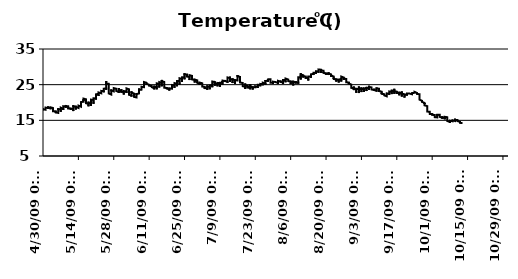
| Category | Temperature (oC) | date |
|---|---|---|
| 10/13/09 | 14.26 |  |
| 10/13/09 | 14.28 |  |
| 10/13/09 | 14.27 |  |
| 10/13/09 | 14.23 |  |
| 10/13/09 | 14.25 |  |
| 10/13/09 | 14.19 |  |
| 10/13/09 | 14.14 |  |
| 10/13/09 | 14.12 |  |
| 10/13/09 | 14.14 |  |
| 10/13/09 | 14.13 |  |
| 10/13/09 | 14.1 |  |
| 10/13/09 | 14.08 |  |
| 10/13/09 | 14.08 |  |
| 10/13/09 | 14.07 |  |
| 10/13/09 | 14.06 |  |
| 10/13/09 | 14.07 |  |
| 10/13/09 | 14.08 |  |
| 10/13/09 | 14.09 |  |
| 10/13/09 | 14.1 |  |
| 10/13/09 | 14.12 |  |
| 10/13/09 | 14.13 |  |
| 10/13/09 | 14.14 |  |
| 10/13/09 | 14.15 |  |
| 10/13/09 | 14.16 |  |
| 10/13/09 | 14.17 |  |
| 10/13/09 | 14.18 |  |
| 10/13/09 | 14.2 |  |
| 10/13/09 | 14.21 |  |
| 10/13/09 | 14.23 |  |
| 10/13/09 | 14.24 |  |
| 10/13/09 | 14.26 |  |
| 10/13/09 | 14.28 |  |
| 10/12/09 | 14.29 |  |
| 10/12/09 | 14.29 |  |
| 10/12/09 | 14.3 |  |
| 10/12/09 | 14.31 |  |
| 10/12/09 | 14.34 |  |
| 10/12/09 | 14.35 |  |
| 10/12/09 | 14.36 |  |
| 10/12/09 | 14.36 |  |
| 10/12/09 | 14.36 |  |
| 10/12/09 | 14.37 |  |
| 10/12/09 | 14.39 |  |
| 10/12/09 | 14.39 |  |
| 10/12/09 | 14.4 |  |
| 10/12/09 | 14.4 |  |
| 10/12/09 | 14.39 |  |
| 10/12/09 | 14.38 |  |
| 10/12/09 | 14.39 |  |
| 10/12/09 | 14.38 |  |
| 10/12/09 | 14.37 |  |
| 10/12/09 | 14.35 |  |
| 10/12/09 | 14.28 |  |
| 10/12/09 | 14.22 |  |
| 10/12/09 | 14.2 |  |
| 10/12/09 | 14.18 |  |
| 10/12/09 | 14.17 |  |
| 10/12/09 | 14.14 |  |
| 10/12/09 | 14.1 |  |
| 10/12/09 | 14.11 |  |
| 10/12/09 | 14.12 |  |
| 10/12/09 | 14.13 |  |
| 10/12/09 | 14.17 |  |
| 10/12/09 | 14.2 |  |
| 10/12/09 | 14.22 |  |
| 10/12/09 | 14.23 |  |
| 10/12/09 | 14.28 |  |
| 10/12/09 | 14.34 |  |
| 10/12/09 | 14.39 |  |
| 10/12/09 | 14.44 |  |
| 10/12/09 | 14.48 |  |
| 10/12/09 | 14.49 |  |
| 10/12/09 | 14.52 |  |
| 10/12/09 | 14.55 |  |
| 10/12/09 | 14.58 |  |
| 10/12/09 | 14.63 |  |
| 10/12/09 | 14.67 |  |
| 10/12/09 | 14.7 |  |
| 10/12/09 | 14.72 |  |
| 10/12/09 | 14.76 |  |
| 10/11/09 | 14.79 |  |
| 10/11/09 | 14.82 |  |
| 10/11/09 | 14.85 |  |
| 10/11/09 | 14.89 |  |
| 10/11/09 | 14.95 |  |
| 10/11/09 | 15.03 |  |
| 10/11/09 | 15.08 |  |
| 10/11/09 | 15.17 |  |
| 10/11/09 | 15.2 |  |
| 10/11/09 | 15.26 |  |
| 10/11/09 | 15.27 |  |
| 10/11/09 | 15.29 |  |
| 10/11/09 | 15.29 |  |
| 10/11/09 | 15.33 |  |
| 10/11/09 | 15.27 |  |
| 10/11/09 | 15.12 |  |
| 10/11/09 | 15.22 |  |
| 10/11/09 | 15.28 |  |
| 10/11/09 | 15.16 |  |
| 10/11/09 | 15.03 |  |
| 10/11/09 | 14.78 |  |
| 10/11/09 | 14.79 |  |
| 10/11/09 | 14.79 |  |
| 10/11/09 | 14.72 |  |
| 10/11/09 | 14.7 |  |
| 10/11/09 | 14.68 |  |
| 10/11/09 | 14.67 |  |
| 10/11/09 | 14.71 |  |
| 10/11/09 | 14.7 |  |
| 10/11/09 | 14.71 |  |
| 10/11/09 | 14.71 |  |
| 10/11/09 | 14.74 |  |
| 10/11/09 | 14.76 |  |
| 10/11/09 | 14.8 |  |
| 10/11/09 | 14.8 |  |
| 10/11/09 | 14.81 |  |
| 10/11/09 | 14.83 |  |
| 10/11/09 | 14.86 |  |
| 10/11/09 | 14.89 |  |
| 10/11/09 | 14.91 |  |
| 10/11/09 | 14.94 |  |
| 10/11/09 | 14.97 |  |
| 10/11/09 | 15 |  |
| 10/11/09 | 15.01 |  |
| 10/11/09 | 15.03 |  |
| 10/11/09 | 15.06 |  |
| 10/11/09 | 15.08 |  |
| 10/11/09 | 15.12 |  |
| 10/10/09 | 15.15 |  |
| 10/10/09 | 15.23 |  |
| 10/10/09 | 15.27 |  |
| 10/10/09 | 15.33 |  |
| 10/10/09 | 15.4 |  |
| 10/10/09 | 15.47 |  |
| 10/10/09 | 15.55 |  |
| 10/10/09 | 15.57 |  |
| 10/10/09 | 15.54 |  |
| 10/10/09 | 15.54 |  |
| 10/10/09 | 15.38 |  |
| 10/10/09 | 15.37 |  |
| 10/10/09 | 15.56 |  |
| 10/10/09 | 15.35 |  |
| 10/10/09 | 15.3 |  |
| 10/10/09 | 15.28 |  |
| 10/10/09 | 15.14 |  |
| 10/10/09 | 15.05 |  |
| 10/10/09 | 14.97 |  |
| 10/10/09 | 14.97 |  |
| 10/10/09 | 14.89 |  |
| 10/10/09 | 14.86 |  |
| 10/10/09 | 14.82 |  |
| 10/10/09 | 14.79 |  |
| 10/10/09 | 14.76 |  |
| 10/10/09 | 14.78 |  |
| 10/10/09 | 14.75 |  |
| 10/10/09 | 14.75 |  |
| 10/10/09 | 14.76 |  |
| 10/10/09 | 14.76 |  |
| 10/10/09 | 14.77 |  |
| 10/10/09 | 14.79 |  |
| 10/10/09 | 14.82 |  |
| 10/10/09 | 14.85 |  |
| 10/10/09 | 14.88 |  |
| 10/10/09 | 14.92 |  |
| 10/10/09 | 14.92 |  |
| 10/10/09 | 14.91 |  |
| 10/10/09 | 14.83 |  |
| 10/10/09 | 14.74 |  |
| 10/10/09 | 14.73 |  |
| 10/10/09 | 14.83 |  |
| 10/10/09 | 14.84 |  |
| 10/10/09 | 14.86 |  |
| 10/10/09 | 14.89 |  |
| 10/10/09 | 14.98 |  |
| 10/10/09 | 15.01 |  |
| 10/10/09 | 15.03 |  |
| 10/9/09 | 15.03 |  |
| 10/9/09 | 14.95 |  |
| 10/9/09 | 14.98 |  |
| 10/9/09 | 15.03 |  |
| 10/9/09 | 15 |  |
| 10/9/09 | 14.97 |  |
| 10/9/09 | 14.92 |  |
| 10/9/09 | 14.82 |  |
| 10/9/09 | 14.8 |  |
| 10/9/09 | 14.81 |  |
| 10/9/09 | 14.81 |  |
| 10/9/09 | 14.93 |  |
| 10/9/09 | 14.85 |  |
| 10/9/09 | 14.74 |  |
| 10/9/09 | 14.71 |  |
| 10/9/09 | 14.69 |  |
| 10/9/09 | 14.74 |  |
| 10/9/09 | 14.71 |  |
| 10/9/09 | 14.71 |  |
| 10/9/09 | 14.76 |  |
| 10/9/09 | 14.73 |  |
| 10/9/09 | 14.72 |  |
| 10/9/09 | 14.71 |  |
| 10/9/09 | 14.7 |  |
| 10/9/09 | 14.68 |  |
| 10/9/09 | 14.67 |  |
| 10/9/09 | 14.67 |  |
| 10/9/09 | 14.67 |  |
| 10/9/09 | 14.65 |  |
| 10/9/09 | 14.66 |  |
| 10/9/09 | 14.66 |  |
| 10/9/09 | 14.68 |  |
| 10/9/09 | 14.69 |  |
| 10/9/09 | 14.69 |  |
| 10/9/09 | 14.67 |  |
| 10/9/09 | 14.65 |  |
| 10/9/09 | 14.63 |  |
| 10/9/09 | 14.61 |  |
| 10/9/09 | 14.64 |  |
| 10/9/09 | 14.68 |  |
| 10/9/09 | 14.73 |  |
| 10/9/09 | 14.77 |  |
| 10/9/09 | 14.73 |  |
| 10/9/09 | 14.69 |  |
| 10/9/09 | 14.83 |  |
| 10/9/09 | 14.94 |  |
| 10/9/09 | 14.93 |  |
| 10/9/09 | 14.9 |  |
| 10/8/09 | 14.9 |  |
| 10/8/09 | 14.92 |  |
| 10/8/09 | 14.86 |  |
| 10/8/09 | 14.84 |  |
| 10/8/09 | 15 |  |
| 10/8/09 | 15.03 |  |
| 10/8/09 | 15.01 |  |
| 10/8/09 | 14.99 |  |
| 10/8/09 | 14.89 |  |
| 10/8/09 | 14.89 |  |
| 10/8/09 | 14.75 |  |
| 10/8/09 | 14.56 |  |
| 10/8/09 | 14.42 |  |
| 10/8/09 | 14.55 |  |
| 10/8/09 | 14.48 |  |
| 10/8/09 | 14.59 |  |
| 10/8/09 | 14.64 |  |
| 10/8/09 | 14.48 |  |
| 10/8/09 | 14.26 |  |
| 10/8/09 | 14.25 |  |
| 10/8/09 | 14.31 |  |
| 10/8/09 | 14.34 |  |
| 10/8/09 | 14.25 |  |
| 10/8/09 | 14.22 |  |
| 10/8/09 | 14.24 |  |
| 10/8/09 | 14.26 |  |
| 10/8/09 | 14.26 |  |
| 10/8/09 | 14.24 |  |
| 10/8/09 | 14.24 |  |
| 10/8/09 | 14.24 |  |
| 10/8/09 | 14.25 |  |
| 10/8/09 | 14.29 |  |
| 10/8/09 | 14.33 |  |
| 10/8/09 | 14.36 |  |
| 10/8/09 | 14.39 |  |
| 10/8/09 | 14.44 |  |
| 10/8/09 | 14.48 |  |
| 10/8/09 | 14.51 |  |
| 10/8/09 | 14.53 |  |
| 10/8/09 | 14.55 |  |
| 10/8/09 | 14.56 |  |
| 10/8/09 | 14.59 |  |
| 10/8/09 | 14.64 |  |
| 10/8/09 | 14.67 |  |
| 10/8/09 | 14.71 |  |
| 10/8/09 | 14.74 |  |
| 10/8/09 | 14.75 |  |
| 10/8/09 | 14.79 |  |
| 10/7/09 | 14.81 |  |
| 10/7/09 | 14.84 |  |
| 10/7/09 | 14.87 |  |
| 10/7/09 | 14.88 |  |
| 10/7/09 | 14.9 |  |
| 10/7/09 | 14.91 |  |
| 10/7/09 | 14.92 |  |
| 10/7/09 | 14.94 |  |
| 10/7/09 | 14.96 |  |
| 10/7/09 | 14.96 |  |
| 10/7/09 | 14.96 |  |
| 10/7/09 | 14.96 |  |
| 10/7/09 | 14.97 |  |
| 10/7/09 | 14.99 |  |
| 10/7/09 | 14.98 |  |
| 10/7/09 | 14.99 |  |
| 10/7/09 | 14.98 |  |
| 10/7/09 | 14.97 |  |
| 10/7/09 | 14.96 |  |
| 10/7/09 | 14.94 |  |
| 10/7/09 | 14.95 |  |
| 10/7/09 | 14.98 |  |
| 10/7/09 | 15.03 |  |
| 10/7/09 | 15.01 |  |
| 10/7/09 | 15.06 |  |
| 10/7/09 | 15.06 |  |
| 10/7/09 | 15.07 |  |
| 10/7/09 | 15.09 |  |
| 10/7/09 | 15.14 |  |
| 10/7/09 | 15.16 |  |
| 10/7/09 | 15.18 |  |
| 10/7/09 | 15.2 |  |
| 10/7/09 | 15.23 |  |
| 10/7/09 | 15.25 |  |
| 10/7/09 | 15.27 |  |
| 10/7/09 | 15.32 |  |
| 10/7/09 | 15.44 |  |
| 10/7/09 | 15.69 |  |
| 10/7/09 | 15.57 |  |
| 10/7/09 | 15.7 |  |
| 10/7/09 | 15.58 |  |
| 10/7/09 | 15.63 |  |
| 10/7/09 | 15.52 |  |
| 10/7/09 | 15.4 |  |
| 10/7/09 | 15.54 |  |
| 10/7/09 | 15.58 |  |
| 10/7/09 | 15.86 |  |
| 10/7/09 | 15.93 |  |
| 10/6/09 | 15.99 |  |
| 10/6/09 | 15.84 |  |
| 10/6/09 | 15.69 |  |
| 10/6/09 | 15.6 |  |
| 10/6/09 | 15.56 |  |
| 10/6/09 | 15.57 |  |
| 10/6/09 | 15.55 |  |
| 10/6/09 | 15.5 |  |
| 10/6/09 | 15.55 |  |
| 10/6/09 | 15.61 |  |
| 10/6/09 | 15.6 |  |
| 10/6/09 | 15.62 |  |
| 10/6/09 | 15.62 |  |
| 10/6/09 | 15.72 |  |
| 10/6/09 | 15.66 |  |
| 10/6/09 | 16.08 |  |
| 10/6/09 | 15.86 |  |
| 10/6/09 | 15.68 |  |
| 10/6/09 | 15.48 |  |
| 10/6/09 | 15.46 |  |
| 10/6/09 | 15.41 |  |
| 10/6/09 | 15.54 |  |
| 10/6/09 | 15.52 |  |
| 10/6/09 | 15.29 |  |
| 10/6/09 | 15.29 |  |
| 10/6/09 | 15.28 |  |
| 10/6/09 | 15.25 |  |
| 10/6/09 | 15.23 |  |
| 10/6/09 | 15.22 |  |
| 10/6/09 | 15.22 |  |
| 10/6/09 | 15.25 |  |
| 10/6/09 | 15.27 |  |
| 10/6/09 | 15.31 |  |
| 10/6/09 | 15.32 |  |
| 10/6/09 | 15.35 |  |
| 10/6/09 | 15.38 |  |
| 10/6/09 | 15.42 |  |
| 10/6/09 | 15.44 |  |
| 10/6/09 | 15.49 |  |
| 10/6/09 | 15.53 |  |
| 10/6/09 | 15.55 |  |
| 10/6/09 | 15.58 |  |
| 10/6/09 | 15.61 |  |
| 10/6/09 | 15.65 |  |
| 10/6/09 | 15.67 |  |
| 10/6/09 | 15.68 |  |
| 10/6/09 | 15.71 |  |
| 10/6/09 | 15.76 |  |
| 10/5/09 | 15.8 |  |
| 10/5/09 | 15.85 |  |
| 10/5/09 | 15.9 |  |
| 10/5/09 | 15.97 |  |
| 10/5/09 | 16.02 |  |
| 10/5/09 | 16.07 |  |
| 10/5/09 | 16.11 |  |
| 10/5/09 | 16.12 |  |
| 10/5/09 | 16.11 |  |
| 10/5/09 | 16.08 |  |
| 10/5/09 | 16.17 |  |
| 10/5/09 | 15.99 |  |
| 10/5/09 | 16.15 |  |
| 10/5/09 | 15.99 |  |
| 10/5/09 | 15.78 |  |
| 10/5/09 | 15.75 |  |
| 10/5/09 | 15.81 |  |
| 10/5/09 | 15.69 |  |
| 10/5/09 | 15.71 |  |
| 10/5/09 | 15.76 |  |
| 10/5/09 | 15.75 |  |
| 10/5/09 | 15.65 |  |
| 10/5/09 | 15.59 |  |
| 10/5/09 | 15.6 |  |
| 10/5/09 | 15.45 |  |
| 10/5/09 | 15.45 |  |
| 10/5/09 | 15.44 |  |
| 10/5/09 | 15.43 |  |
| 10/5/09 | 15.4 |  |
| 10/5/09 | 15.4 |  |
| 10/5/09 | 15.41 |  |
| 10/5/09 | 15.45 |  |
| 10/5/09 | 15.5 |  |
| 10/5/09 | 15.53 |  |
| 10/5/09 | 15.55 |  |
| 10/5/09 | 15.58 |  |
| 10/5/09 | 15.61 |  |
| 10/5/09 | 15.65 |  |
| 10/5/09 | 15.67 |  |
| 10/5/09 | 15.71 |  |
| 10/5/09 | 15.73 |  |
| 10/5/09 | 15.75 |  |
| 10/5/09 | 15.75 |  |
| 10/5/09 | 15.81 |  |
| 10/5/09 | 15.83 |  |
| 10/5/09 | 15.88 |  |
| 10/5/09 | 15.89 |  |
| 10/5/09 | 15.92 |  |
| 10/4/09 | 15.96 |  |
| 10/4/09 | 16 |  |
| 10/4/09 | 16.03 |  |
| 10/4/09 | 16.07 |  |
| 10/4/09 | 16.1 |  |
| 10/4/09 | 16.14 |  |
| 10/4/09 | 16.16 |  |
| 10/4/09 | 16.19 |  |
| 10/4/09 | 16.23 |  |
| 10/4/09 | 16.23 |  |
| 10/4/09 | 16.23 |  |
| 10/4/09 | 16.24 |  |
| 10/4/09 | 16.27 |  |
| 10/4/09 | 16.3 |  |
| 10/4/09 | 16.31 |  |
| 10/4/09 | 16.3 |  |
| 10/4/09 | 16.27 |  |
| 10/4/09 | 16.25 |  |
| 10/4/09 | 16.26 |  |
| 10/4/09 | 16.24 |  |
| 10/4/09 | 16.22 |  |
| 10/4/09 | 16.21 |  |
| 10/4/09 | 16.23 |  |
| 10/4/09 | 16.2 |  |
| 10/4/09 | 16.15 |  |
| 10/4/09 | 16.11 |  |
| 10/4/09 | 16.07 |  |
| 10/4/09 | 16.05 |  |
| 10/4/09 | 16.07 |  |
| 10/4/09 | 16.09 |  |
| 10/4/09 | 16.13 |  |
| 10/4/09 | 16.16 |  |
| 10/4/09 | 16.19 |  |
| 10/4/09 | 16.23 |  |
| 10/4/09 | 16.26 |  |
| 10/4/09 | 16.29 |  |
| 10/4/09 | 16.32 |  |
| 10/4/09 | 16.34 |  |
| 10/4/09 | 16.37 |  |
| 10/4/09 | 16.4 |  |
| 10/4/09 | 16.43 |  |
| 10/4/09 | 16.46 |  |
| 10/4/09 | 16.46 |  |
| 10/4/09 | 16.49 |  |
| 10/4/09 | 16.51 |  |
| 10/4/09 | 16.55 |  |
| 10/4/09 | 16.51 |  |
| 10/4/09 | 16.56 |  |
| 10/3/09 | 16.56 |  |
| 10/3/09 | 16.49 |  |
| 10/3/09 | 16.48 |  |
| 10/3/09 | 16.58 |  |
| 10/3/09 | 16.65 |  |
| 10/3/09 | 16.66 |  |
| 10/3/09 | 16.63 |  |
| 10/3/09 | 16.57 |  |
| 10/3/09 | 16.47 |  |
| 10/3/09 | 16.39 |  |
| 10/3/09 | 16.27 |  |
| 10/3/09 | 16.73 |  |
| 10/3/09 | 16.59 |  |
| 10/3/09 | 16.74 |  |
| 10/3/09 | 16.17 |  |
| 10/3/09 | 16.37 |  |
| 10/3/09 | 16.29 |  |
| 10/3/09 | 16.07 |  |
| 10/3/09 | 15.82 |  |
| 10/3/09 | 15.74 |  |
| 10/3/09 | 15.79 |  |
| 10/3/09 | 15.85 |  |
| 10/3/09 | 15.96 |  |
| 10/3/09 | 15.85 |  |
| 10/3/09 | 15.77 |  |
| 10/3/09 | 15.75 |  |
| 10/3/09 | 15.72 |  |
| 10/3/09 | 15.7 |  |
| 10/3/09 | 15.69 |  |
| 10/3/09 | 15.69 |  |
| 10/3/09 | 15.68 |  |
| 10/3/09 | 15.69 |  |
| 10/3/09 | 15.7 |  |
| 10/3/09 | 15.7 |  |
| 10/3/09 | 15.72 |  |
| 10/3/09 | 15.74 |  |
| 10/3/09 | 15.75 |  |
| 10/3/09 | 15.76 |  |
| 10/3/09 | 15.77 |  |
| 10/3/09 | 15.78 |  |
| 10/3/09 | 15.8 |  |
| 10/3/09 | 15.82 |  |
| 10/3/09 | 15.83 |  |
| 10/3/09 | 15.83 |  |
| 10/3/09 | 15.84 |  |
| 10/3/09 | 15.84 |  |
| 10/3/09 | 15.86 |  |
| 10/3/09 | 15.88 |  |
| 10/2/09 | 15.89 |  |
| 10/2/09 | 15.91 |  |
| 10/2/09 | 15.92 |  |
| 10/2/09 | 15.95 |  |
| 10/2/09 | 15.96 |  |
| 10/2/09 | 15.96 |  |
| 10/2/09 | 15.97 |  |
| 10/2/09 | 15.97 |  |
| 10/2/09 | 15.97 |  |
| 10/2/09 | 15.97 |  |
| 10/2/09 | 15.97 |  |
| 10/2/09 | 15.98 |  |
| 10/2/09 | 15.98 |  |
| 10/2/09 | 15.98 |  |
| 10/2/09 | 15.98 |  |
| 10/2/09 | 15.98 |  |
| 10/2/09 | 15.98 |  |
| 10/2/09 | 15.98 |  |
| 10/2/09 | 15.98 |  |
| 10/2/09 | 15.97 |  |
| 10/2/09 | 15.98 |  |
| 10/2/09 | 15.99 |  |
| 10/2/09 | 15.99 |  |
| 10/2/09 | 15.98 |  |
| 10/2/09 | 15.96 |  |
| 10/2/09 | 15.95 |  |
| 10/2/09 | 15.97 |  |
| 10/2/09 | 15.96 |  |
| 10/2/09 | 15.94 |  |
| 10/2/09 | 15.94 |  |
| 10/2/09 | 15.95 |  |
| 10/2/09 | 15.98 |  |
| 10/2/09 | 16.01 |  |
| 10/2/09 | 16.05 |  |
| 10/2/09 | 16.07 |  |
| 10/2/09 | 16.11 |  |
| 10/2/09 | 16.14 |  |
| 10/2/09 | 16.15 |  |
| 10/2/09 | 16.17 |  |
| 10/2/09 | 16.19 |  |
| 10/2/09 | 16.23 |  |
| 10/2/09 | 16.27 |  |
| 10/2/09 | 16.28 |  |
| 10/2/09 | 16.32 |  |
| 10/2/09 | 16.36 |  |
| 10/2/09 | 16.4 |  |
| 10/2/09 | 16.44 |  |
| 10/2/09 | 16.49 |  |
| 10/1/09 | 16.54 |  |
| 10/1/09 | 16.58 |  |
| 10/1/09 | 16.63 |  |
| 10/1/09 | 16.68 |  |
| 10/1/09 | 16.72 |  |
| 10/1/09 | 16.81 |  |
| 10/1/09 | 16.88 |  |
| 10/1/09 | 16.92 |  |
| 10/1/09 | 16.91 |  |
| 10/1/09 | 16.7 |  |
| 10/1/09 | 16.71 |  |
| 10/1/09 | 16.71 |  |
| 10/1/09 | 17 |  |
| 10/1/09 | 16.89 |  |
| 10/1/09 | 16.6 |  |
| 10/1/09 | 16.45 |  |
| 10/1/09 | 16.5 |  |
| 10/1/09 | 16.47 |  |
| 10/1/09 | 16.42 |  |
| 10/1/09 | 16.37 |  |
| 10/1/09 | 16.31 |  |
| 10/1/09 | 16.26 |  |
| 10/1/09 | 16.19 |  |
| 10/1/09 | 16.21 |  |
| 10/1/09 | 16.21 |  |
| 10/1/09 | 16.22 |  |
| 10/1/09 | 16.2 |  |
| 10/1/09 | 16.2 |  |
| 10/1/09 | 16.19 |  |
| 10/1/09 | 16.19 |  |
| 10/1/09 | 16.21 |  |
| 10/1/09 | 16.27 |  |
| 10/1/09 | 16.29 |  |
| 10/1/09 | 16.34 |  |
| 10/1/09 | 16.37 |  |
| 10/1/09 | 16.4 |  |
| 10/1/09 | 16.43 |  |
| 10/1/09 | 16.45 |  |
| 10/1/09 | 16.48 |  |
| 10/1/09 | 16.5 |  |
| 10/1/09 | 16.55 |  |
| 10/1/09 | 16.58 |  |
| 10/1/09 | 16.61 |  |
| 10/1/09 | 16.63 |  |
| 10/1/09 | 16.63 |  |
| 10/1/09 | 16.68 |  |
| 10/1/09 | 16.71 |  |
| 10/1/09 | 16.75 |  |
| 9/30/09 | 16.8 |  |
| 9/30/09 | 16.82 |  |
| 9/30/09 | 16.86 |  |
| 9/30/09 | 16.91 |  |
| 9/30/09 | 16.94 |  |
| 9/30/09 | 16.98 |  |
| 9/30/09 | 17.03 |  |
| 9/30/09 | 17.07 |  |
| 9/30/09 | 17.09 |  |
| 9/30/09 | 17.15 |  |
| 9/30/09 | 17.19 |  |
| 9/30/09 | 17.22 |  |
| 9/30/09 | 17.18 |  |
| 9/30/09 | 17.22 |  |
| 9/30/09 | 17.19 |  |
| 9/30/09 | 17.17 |  |
| 9/30/09 | 17.17 |  |
| 9/30/09 | 17.15 |  |
| 9/30/09 | 17.14 |  |
| 9/30/09 | 17.13 |  |
| 9/30/09 | 17.11 |  |
| 9/30/09 | 17.09 |  |
| 9/30/09 | 17.03 |  |
| 9/30/09 | 17 |  |
| 9/30/09 | 17.01 |  |
| 9/30/09 | 17.02 |  |
| 9/30/09 | 16.99 |  |
| 9/30/09 | 16.99 |  |
| 9/30/09 | 16.99 |  |
| 9/30/09 | 17 |  |
| 9/30/09 | 17.01 |  |
| 9/30/09 | 17.04 |  |
| 9/30/09 | 17.06 |  |
| 9/30/09 | 17.09 |  |
| 9/30/09 | 17.12 |  |
| 9/30/09 | 17.13 |  |
| 9/30/09 | 17.17 |  |
| 9/30/09 | 17.2 |  |
| 9/30/09 | 17.22 |  |
| 9/30/09 | 17.24 |  |
| 9/30/09 | 17.27 |  |
| 9/30/09 | 17.29 |  |
| 9/30/09 | 17.31 |  |
| 9/30/09 | 17.32 |  |
| 9/30/09 | 17.34 |  |
| 9/30/09 | 17.36 |  |
| 9/30/09 | 17.4 |  |
| 9/30/09 | 17.42 |  |
| 9/29/09 | 17.46 |  |
| 9/29/09 | 17.48 |  |
| 9/29/09 | 17.5 |  |
| 9/29/09 | 17.53 |  |
| 9/29/09 | 17.55 |  |
| 9/29/09 | 17.55 |  |
| 9/29/09 | 17.57 |  |
| 9/29/09 | 17.58 |  |
| 9/29/09 | 17.59 |  |
| 9/29/09 | 17.62 |  |
| 9/29/09 | 17.66 |  |
| 9/29/09 | 17.69 |  |
| 9/29/09 | 17.74 |  |
| 9/29/09 | 17.77 |  |
| 9/29/09 | 17.81 |  |
| 9/29/09 | 17.84 |  |
| 9/29/09 | 17.86 |  |
| 9/29/09 | 17.89 |  |
| 9/29/09 | 17.93 |  |
| 9/29/09 | 17.96 |  |
| 9/29/09 | 17.97 |  |
| 9/29/09 | 17.99 |  |
| 9/29/09 | 17.97 |  |
| 9/29/09 | 18.01 |  |
| 9/29/09 | 18.02 |  |
| 9/29/09 | 18.08 |  |
| 9/29/09 | 18.07 |  |
| 9/29/09 | 18.06 |  |
| 9/29/09 | 18.1 |  |
| 9/29/09 | 18.12 |  |
| 9/29/09 | 18.16 |  |
| 9/29/09 | 18.21 |  |
| 9/29/09 | 18.29 |  |
| 9/29/09 | 18.33 |  |
| 9/29/09 | 18.4 |  |
| 9/29/09 | 18.46 |  |
| 9/29/09 | 18.52 |  |
| 9/29/09 | 18.59 |  |
| 9/29/09 | 18.65 |  |
| 9/29/09 | 18.7 |  |
| 9/29/09 | 18.77 |  |
| 9/29/09 | 18.84 |  |
| 9/29/09 | 18.87 |  |
| 9/29/09 | 18.94 |  |
| 9/29/09 | 18.99 |  |
| 9/29/09 | 19.05 |  |
| 9/29/09 | 19.08 |  |
| 9/29/09 | 19.12 |  |
| 9/28/09 | 19.2 |  |
| 9/28/09 | 19.22 |  |
| 9/28/09 | 19.26 |  |
| 9/28/09 | 19.29 |  |
| 9/28/09 | 19.3 |  |
| 9/28/09 | 19.36 |  |
| 9/28/09 | 19.36 |  |
| 9/28/09 | 19.41 |  |
| 9/28/09 | 19.42 |  |
| 9/28/09 | 19.47 |  |
| 9/28/09 | 19.54 |  |
| 9/28/09 | 19.58 |  |
| 9/28/09 | 19.63 |  |
| 9/28/09 | 19.67 |  |
| 9/28/09 | 19.69 |  |
| 9/28/09 | 19.76 |  |
| 9/28/09 | 19.8 |  |
| 9/28/09 | 19.86 |  |
| 9/28/09 | 19.89 |  |
| 9/28/09 | 19.89 |  |
| 9/28/09 | 19.89 |  |
| 9/28/09 | 19.82 |  |
| 9/28/09 | 19.72 |  |
| 9/28/09 | 19.68 |  |
| 9/28/09 | 19.64 |  |
| 9/28/09 | 19.59 |  |
| 9/28/09 | 19.57 |  |
| 9/28/09 | 19.55 |  |
| 9/28/09 | 19.55 |  |
| 9/28/09 | 19.56 |  |
| 9/28/09 | 19.58 |  |
| 9/28/09 | 19.6 |  |
| 9/28/09 | 19.62 |  |
| 9/28/09 | 19.65 |  |
| 9/28/09 | 19.67 |  |
| 9/28/09 | 19.7 |  |
| 9/28/09 | 19.72 |  |
| 9/28/09 | 19.74 |  |
| 9/28/09 | 19.76 |  |
| 9/28/09 | 19.79 |  |
| 9/28/09 | 19.83 |  |
| 9/28/09 | 19.88 |  |
| 9/28/09 | 19.92 |  |
| 9/28/09 | 19.99 |  |
| 9/28/09 | 20.04 |  |
| 9/28/09 | 20.06 |  |
| 9/28/09 | 20.1 |  |
| 9/28/09 | 20.13 |  |
| 9/27/09 | 20.16 |  |
| 9/27/09 | 20.2 |  |
| 9/27/09 | 20.22 |  |
| 9/27/09 | 20.26 |  |
| 9/27/09 | 20.3 |  |
| 9/27/09 | 20.34 |  |
| 9/27/09 | 20.38 |  |
| 9/27/09 | 20.43 |  |
| 9/27/09 | 20.44 |  |
| 9/27/09 | 20.48 |  |
| 9/27/09 | 20.48 |  |
| 9/27/09 | 20.41 |  |
| 9/27/09 | 20.35 |  |
| 9/27/09 | 20.29 |  |
| 9/27/09 | 20.29 |  |
| 9/27/09 | 20.31 |  |
| 9/27/09 | 20.32 |  |
| 9/27/09 | 20.38 |  |
| 9/27/09 | 20.36 |  |
| 9/27/09 | 20.34 |  |
| 9/27/09 | 20.33 |  |
| 9/27/09 | 20.35 |  |
| 9/27/09 | 20.36 |  |
| 9/27/09 | 20.37 |  |
| 9/27/09 | 20.38 |  |
| 9/27/09 | 20.37 |  |
| 9/27/09 | 20.37 |  |
| 9/27/09 | 20.36 |  |
| 9/27/09 | 20.36 |  |
| 9/27/09 | 20.38 |  |
| 9/27/09 | 20.39 |  |
| 9/27/09 | 20.4 |  |
| 9/27/09 | 20.43 |  |
| 9/27/09 | 20.45 |  |
| 9/27/09 | 20.47 |  |
| 9/27/09 | 20.5 |  |
| 9/27/09 | 20.51 |  |
| 9/27/09 | 20.54 |  |
| 9/27/09 | 20.56 |  |
| 9/27/09 | 20.57 |  |
| 9/27/09 | 20.59 |  |
| 9/27/09 | 20.63 |  |
| 9/27/09 | 20.65 |  |
| 9/27/09 | 20.67 |  |
| 9/27/09 | 20.69 |  |
| 9/27/09 | 20.72 |  |
| 9/27/09 | 20.73 |  |
| 9/27/09 | 20.76 |  |
| 9/26/09 | 20.79 |  |
| 9/26/09 | 20.81 |  |
| 9/26/09 | 20.83 |  |
| 9/26/09 | 20.87 |  |
| 9/26/09 | 20.9 |  |
| 9/26/09 | 20.94 |  |
| 9/26/09 | 20.98 |  |
| 9/26/09 | 21 |  |
| 9/26/09 | 21.03 |  |
| 9/26/09 | 21 |  |
| 9/26/09 | 21.03 |  |
| 9/26/09 | 21.07 |  |
| 9/26/09 | 21.14 |  |
| 9/26/09 | 21.19 |  |
| 9/26/09 | 21.24 |  |
| 9/26/09 | 21.28 |  |
| 9/26/09 | 21.31 |  |
| 9/26/09 | 21.35 |  |
| 9/26/09 | 21.4 |  |
| 9/26/09 | 21.44 |  |
| 9/26/09 | 21.48 |  |
| 9/26/09 | 21.51 |  |
| 9/26/09 | 21.54 |  |
| 9/26/09 | 21.56 |  |
| 9/26/09 | 21.59 |  |
| 9/26/09 | 21.62 |  |
| 9/26/09 | 21.64 |  |
| 9/26/09 | 21.67 |  |
| 9/26/09 | 21.68 |  |
| 9/26/09 | 21.7 |  |
| 9/26/09 | 21.73 |  |
| 9/26/09 | 21.78 |  |
| 9/26/09 | 21.8 |  |
| 9/26/09 | 21.84 |  |
| 9/26/09 | 21.87 |  |
| 9/26/09 | 21.9 |  |
| 9/26/09 | 21.92 |  |
| 9/26/09 | 21.95 |  |
| 9/26/09 | 21.98 |  |
| 9/26/09 | 21.99 |  |
| 9/26/09 | 22.02 |  |
| 9/26/09 | 22.07 |  |
| 9/26/09 | 22.11 |  |
| 9/26/09 | 22.15 |  |
| 9/26/09 | 22.19 |  |
| 9/26/09 | 22.24 |  |
| 9/26/09 | 22.32 |  |
| 9/26/09 | 22.37 |  |
| 9/25/09 | 22.4 |  |
| 9/25/09 | 22.46 |  |
| 9/25/09 | 22.51 |  |
| 9/25/09 | 22.57 |  |
| 9/25/09 | 22.65 |  |
| 9/25/09 | 22.69 |  |
| 9/25/09 | 22.74 |  |
| 9/25/09 | 22.79 |  |
| 9/25/09 | 22.84 |  |
| 9/25/09 | 22.87 |  |
| 9/25/09 | 22.89 |  |
| 9/25/09 | 22.93 |  |
| 9/25/09 | 22.93 |  |
| 9/25/09 | 22.92 |  |
| 9/25/09 | 22.93 |  |
| 9/25/09 | 22.93 |  |
| 9/25/09 | 22.87 |  |
| 9/25/09 | 22.83 |  |
| 9/25/09 | 22.78 |  |
| 9/25/09 | 22.71 |  |
| 9/25/09 | 22.62 |  |
| 9/25/09 | 22.54 |  |
| 9/25/09 | 22.46 |  |
| 9/25/09 | 22.36 |  |
| 9/25/09 | 22.29 |  |
| 9/25/09 | 22.27 |  |
| 9/25/09 | 22.25 |  |
| 9/25/09 | 22.23 |  |
| 9/25/09 | 22.22 |  |
| 9/25/09 | 22.23 |  |
| 9/25/09 | 22.27 |  |
| 9/25/09 | 22.3 |  |
| 9/25/09 | 22.32 |  |
| 9/25/09 | 22.36 |  |
| 9/25/09 | 22.41 |  |
| 9/25/09 | 22.44 |  |
| 9/25/09 | 22.48 |  |
| 9/25/09 | 22.52 |  |
| 9/25/09 | 22.55 |  |
| 9/25/09 | 22.59 |  |
| 9/25/09 | 22.63 |  |
| 9/25/09 | 22.68 |  |
| 9/25/09 | 22.72 |  |
| 9/25/09 | 22.74 |  |
| 9/25/09 | 22.81 |  |
| 9/25/09 | 22.85 |  |
| 9/25/09 | 22.9 |  |
| 9/25/09 | 22.95 |  |
| 9/24/09 | 23 |  |
| 9/24/09 | 23.04 |  |
| 9/24/09 | 23.07 |  |
| 9/24/09 | 23.11 |  |
| 9/24/09 | 23.07 |  |
| 9/24/09 | 23.03 |  |
| 9/24/09 | 23 |  |
| 9/24/09 | 22.97 |  |
| 9/24/09 | 22.98 |  |
| 9/24/09 | 22.98 |  |
| 9/24/09 | 22.97 |  |
| 9/24/09 | 22.93 |  |
| 9/24/09 | 22.92 |  |
| 9/24/09 | 22.98 |  |
| 9/24/09 | 22.97 |  |
| 9/24/09 | 22.91 |  |
| 9/24/09 | 22.91 |  |
| 9/24/09 | 23.02 |  |
| 9/24/09 | 23.01 |  |
| 9/24/09 | 23.01 |  |
| 9/24/09 | 22.93 |  |
| 9/24/09 | 22.82 |  |
| 9/24/09 | 22.75 |  |
| 9/24/09 | 22.71 |  |
| 9/24/09 | 22.68 |  |
| 9/24/09 | 22.66 |  |
| 9/24/09 | 22.64 |  |
| 9/24/09 | 22.62 |  |
| 9/24/09 | 22.62 |  |
| 9/24/09 | 22.63 |  |
| 9/24/09 | 22.64 |  |
| 9/24/09 | 22.65 |  |
| 9/24/09 | 22.67 |  |
| 9/24/09 | 22.69 |  |
| 9/24/09 | 22.71 |  |
| 9/24/09 | 22.75 |  |
| 9/24/09 | 22.78 |  |
| 9/24/09 | 22.78 |  |
| 9/24/09 | 22.8 |  |
| 9/24/09 | 22.8 |  |
| 9/24/09 | 22.78 |  |
| 9/24/09 | 22.7 |  |
| 9/24/09 | 22.65 |  |
| 9/24/09 | 22.66 |  |
| 9/24/09 | 22.67 |  |
| 9/24/09 | 22.69 |  |
| 9/24/09 | 22.68 |  |
| 9/24/09 | 22.66 |  |
| 9/23/09 | 22.64 |  |
| 9/23/09 | 22.69 |  |
| 9/23/09 | 22.73 |  |
| 9/23/09 | 22.78 |  |
| 9/23/09 | 22.77 |  |
| 9/23/09 | 22.83 |  |
| 9/23/09 | 22.79 |  |
| 9/23/09 | 22.72 |  |
| 9/23/09 | 22.71 |  |
| 9/23/09 | 22.74 |  |
| 9/23/09 | 22.73 |  |
| 9/23/09 | 22.73 |  |
| 9/23/09 | 22.6 |  |
| 9/23/09 | 22.5 |  |
| 9/23/09 | 22.46 |  |
| 9/23/09 | 22.53 |  |
| 9/23/09 | 22.4 |  |
| 9/23/09 | 22.48 |  |
| 9/23/09 | 22.5 |  |
| 9/23/09 | 22.44 |  |
| 9/23/09 | 22.39 |  |
| 9/23/09 | 22.32 |  |
| 9/23/09 | 22.26 |  |
| 9/23/09 | 22.3 |  |
| 9/23/09 | 22.3 |  |
| 9/23/09 | 22.21 |  |
| 9/23/09 | 22.18 |  |
| 9/23/09 | 22.17 |  |
| 9/23/09 | 22.15 |  |
| 9/23/09 | 22.13 |  |
| 9/23/09 | 22.13 |  |
| 9/23/09 | 22.14 |  |
| 9/23/09 | 22.15 |  |
| 9/23/09 | 22.17 |  |
| 9/23/09 | 22.2 |  |
| 9/23/09 | 22.22 |  |
| 9/23/09 | 22.24 |  |
| 9/23/09 | 22.26 |  |
| 9/23/09 | 22.29 |  |
| 9/23/09 | 22.31 |  |
| 9/23/09 | 22.34 |  |
| 9/23/09 | 22.36 |  |
| 9/23/09 | 22.38 |  |
| 9/23/09 | 22.41 |  |
| 9/23/09 | 22.43 |  |
| 9/23/09 | 22.46 |  |
| 9/23/09 | 22.48 |  |
| 9/23/09 | 22.5 |  |
| 9/22/09 | 22.52 |  |
| 9/22/09 | 22.52 |  |
| 9/22/09 | 22.53 |  |
| 9/22/09 | 22.52 |  |
| 9/22/09 | 22.53 |  |
| 9/22/09 | 22.55 |  |
| 9/22/09 | 22.56 |  |
| 9/22/09 | 22.55 |  |
| 9/22/09 | 22.54 |  |
| 9/22/09 | 22.54 |  |
| 9/22/09 | 22.56 |  |
| 9/22/09 | 22.57 |  |
| 9/22/09 | 22.56 |  |
| 9/22/09 | 22.56 |  |
| 9/22/09 | 22.5 |  |
| 9/22/09 | 22.45 |  |
| 9/22/09 | 22.43 |  |
| 9/22/09 | 22.4 |  |
| 9/22/09 | 22.4 |  |
| 9/22/09 | 22.36 |  |
| 9/22/09 | 22.34 |  |
| 9/22/09 | 22.33 |  |
| 9/22/09 | 22.3 |  |
| 9/22/09 | 22.3 |  |
| 9/22/09 | 22.29 |  |
| 9/22/09 | 22.27 |  |
| 9/22/09 | 22.27 |  |
| 9/22/09 | 22.28 |  |
| 9/22/09 | 22.29 |  |
| 9/22/09 | 22.31 |  |
| 9/22/09 | 22.31 |  |
| 9/22/09 | 22.33 |  |
| 9/22/09 | 22.35 |  |
| 9/22/09 | 22.36 |  |
| 9/22/09 | 22.39 |  |
| 9/22/09 | 22.42 |  |
| 9/22/09 | 22.45 |  |
| 9/22/09 | 22.47 |  |
| 9/22/09 | 22.49 |  |
| 9/22/09 | 22.53 |  |
| 9/22/09 | 22.56 |  |
| 9/22/09 | 22.54 |  |
| 9/22/09 | 22.54 |  |
| 9/22/09 | 22.55 |  |
| 9/22/09 | 22.48 |  |
| 9/22/09 | 22.5 |  |
| 9/22/09 | 22.49 |  |
| 9/22/09 | 22.52 |  |
| 9/21/09 | 22.55 |  |
| 9/21/09 | 22.61 |  |
| 9/21/09 | 22.62 |  |
| 9/21/09 | 22.63 |  |
| 9/21/09 | 22.59 |  |
| 9/21/09 | 22.56 |  |
| 9/21/09 | 22.57 |  |
| 9/21/09 | 22.59 |  |
| 9/21/09 | 22.6 |  |
| 9/21/09 | 22.63 |  |
| 9/21/09 | 22.56 |  |
| 9/21/09 | 22.49 |  |
| 9/21/09 | 22.47 |  |
| 9/21/09 | 22.4 |  |
| 9/21/09 | 22.4 |  |
| 9/21/09 | 22.39 |  |
| 9/21/09 | 22.4 |  |
| 9/21/09 | 22.33 |  |
| 9/21/09 | 22.28 |  |
| 9/21/09 | 22.28 |  |
| 9/21/09 | 22.24 |  |
| 9/21/09 | 22.27 |  |
| 9/21/09 | 22.3 |  |
| 9/21/09 | 22.22 |  |
| 9/21/09 | 22.16 |  |
| 9/21/09 | 22.1 |  |
| 9/21/09 | 22.02 |  |
| 9/21/09 | 22 |  |
| 9/21/09 | 21.96 |  |
| 9/21/09 | 21.94 |  |
| 9/21/09 | 21.92 |  |
| 9/21/09 | 21.93 |  |
| 9/21/09 | 21.96 |  |
| 9/21/09 | 21.99 |  |
| 9/21/09 | 22.04 |  |
| 9/21/09 | 22.09 |  |
| 9/21/09 | 22.15 |  |
| 9/21/09 | 22.22 |  |
| 9/21/09 | 22.27 |  |
| 9/21/09 | 22.28 |  |
| 9/21/09 | 22.33 |  |
| 9/21/09 | 22.34 |  |
| 9/21/09 | 22.35 |  |
| 9/21/09 | 22.25 |  |
| 9/21/09 | 22.26 |  |
| 9/21/09 | 22.18 |  |
| 9/21/09 | 22.15 |  |
| 9/21/09 | 22.12 |  |
| 9/20/09 | 22.08 |  |
| 9/20/09 | 22.02 |  |
| 9/20/09 | 22.02 |  |
| 9/20/09 | 22.15 |  |
| 9/20/09 | 22.26 |  |
| 9/20/09 | 22.28 |  |
| 9/20/09 | 22.21 |  |
| 9/20/09 | 22.03 |  |
| 9/20/09 | 22.03 |  |
| 9/20/09 | 22 |  |
| 9/20/09 | 22.02 |  |
| 9/20/09 | 22.13 |  |
| 9/20/09 | 22 |  |
| 9/20/09 | 21.92 |  |
| 9/20/09 | 21.9 |  |
| 9/20/09 | 21.89 |  |
| 9/20/09 | 21.91 |  |
| 9/20/09 | 22 |  |
| 9/20/09 | 21.91 |  |
| 9/20/09 | 21.8 |  |
| 9/20/09 | 21.69 |  |
| 9/20/09 | 21.71 |  |
| 9/20/09 | 21.7 |  |
| 9/20/09 | 21.57 |  |
| 9/20/09 | 21.51 |  |
| 9/20/09 | 21.44 |  |
| 9/20/09 | 21.43 |  |
| 9/20/09 | 21.4 |  |
| 9/20/09 | 21.36 |  |
| 9/20/09 | 21.34 |  |
| 9/20/09 | 21.35 |  |
| 9/20/09 | 21.36 |  |
| 9/20/09 | 21.4 |  |
| 9/20/09 | 21.48 |  |
| 9/20/09 | 21.53 |  |
| 9/20/09 | 21.57 |  |
| 9/20/09 | 21.6 |  |
| 9/20/09 | 21.67 |  |
| 9/20/09 | 21.71 |  |
| 9/20/09 | 21.76 |  |
| 9/20/09 | 21.81 |  |
| 9/20/09 | 21.89 |  |
| 9/20/09 | 21.94 |  |
| 9/20/09 | 22.01 |  |
| 9/20/09 | 22.07 |  |
| 9/20/09 | 22.16 |  |
| 9/20/09 | 22.24 |  |
| 9/20/09 | 22.33 |  |
| 9/19/09 | 22.44 |  |
| 9/19/09 | 22.53 |  |
| 9/19/09 | 22.61 |  |
| 9/19/09 | 22.67 |  |
| 9/19/09 | 22.6 |  |
| 9/19/09 | 22.69 |  |
| 9/19/09 | 22.65 |  |
| 9/19/09 | 22.7 |  |
| 9/19/09 | 22.67 |  |
| 9/19/09 | 23.09 |  |
| 9/19/09 | 23.01 |  |
| 9/19/09 | 22.8 |  |
| 9/19/09 | 23 |  |
| 9/19/09 | 22.87 |  |
| 9/19/09 | 22.41 |  |
| 9/19/09 | 22.47 |  |
| 9/19/09 | 22.57 |  |
| 9/19/09 | 22.37 |  |
| 9/19/09 | 22.31 |  |
| 9/19/09 | 22.47 |  |
| 9/19/09 | 22.35 |  |
| 9/19/09 | 22.16 |  |
| 9/19/09 | 22 |  |
| 9/19/09 | 21.84 |  |
| 9/19/09 | 21.75 |  |
| 9/19/09 | 21.78 |  |
| 9/19/09 | 21.68 |  |
| 9/19/09 | 21.63 |  |
| 9/19/09 | 21.59 |  |
| 9/19/09 | 21.64 |  |
| 9/19/09 | 21.66 |  |
| 9/19/09 | 21.69 |  |
| 9/19/09 | 21.73 |  |
| 9/19/09 | 21.78 |  |
| 9/19/09 | 21.83 |  |
| 9/19/09 | 21.9 |  |
| 9/19/09 | 21.95 |  |
| 9/19/09 | 22.01 |  |
| 9/19/09 | 22.07 |  |
| 9/19/09 | 22.12 |  |
| 9/19/09 | 22.17 |  |
| 9/19/09 | 22.22 |  |
| 9/19/09 | 22.27 |  |
| 9/19/09 | 22.33 |  |
| 9/19/09 | 22.41 |  |
| 9/19/09 | 22.47 |  |
| 9/19/09 | 22.54 |  |
| 9/19/09 | 22.62 |  |
| 9/18/09 | 22.72 |  |
| 9/18/09 | 22.78 |  |
| 9/18/09 | 22.84 |  |
| 9/18/09 | 22.96 |  |
| 9/18/09 | 22.92 |  |
| 9/18/09 | 23.01 |  |
| 9/18/09 | 23.09 |  |
| 9/18/09 | 22.98 |  |
| 9/18/09 | 22.7 |  |
| 9/18/09 | 22.69 |  |
| 9/18/09 | 22.69 |  |
| 9/18/09 | 22.45 |  |
| 9/18/09 | 22.42 |  |
| 9/18/09 | 22.39 |  |
| 9/18/09 | 22.35 |  |
| 9/18/09 | 22.21 |  |
| 9/18/09 | 22.2 |  |
| 9/18/09 | 22.18 |  |
| 9/18/09 | 22.17 |  |
| 9/18/09 | 22.22 |  |
| 9/18/09 | 22.16 |  |
| 9/18/09 | 22.02 |  |
| 9/18/09 | 21.95 |  |
| 9/18/09 | 21.93 |  |
| 9/18/09 | 21.94 |  |
| 9/18/09 | 21.97 |  |
| 9/18/09 | 21.97 |  |
| 9/18/09 | 21.96 |  |
| 9/18/09 | 21.96 |  |
| 9/18/09 | 21.97 |  |
| 9/18/09 | 22 |  |
| 9/18/09 | 22.03 |  |
| 9/18/09 | 22.06 |  |
| 9/18/09 | 22.1 |  |
| 9/18/09 | 22.14 |  |
| 9/18/09 | 22.19 |  |
| 9/18/09 | 22.22 |  |
| 9/18/09 | 22.26 |  |
| 9/18/09 | 22.29 |  |
| 9/18/09 | 22.32 |  |
| 9/18/09 | 22.36 |  |
| 9/18/09 | 22.42 |  |
| 9/18/09 | 22.47 |  |
| 9/18/09 | 22.53 |  |
| 9/18/09 | 22.57 |  |
| 9/18/09 | 22.62 |  |
| 9/18/09 | 22.67 |  |
| 9/18/09 | 22.72 |  |
| 9/17/09 | 22.78 |  |
| 9/17/09 | 22.86 |  |
| 9/17/09 | 22.92 |  |
| 9/17/09 | 22.98 |  |
| 9/17/09 | 23.03 |  |
| 9/17/09 | 23.1 |  |
| 9/17/09 | 23.14 |  |
| 9/17/09 | 23.21 |  |
| 9/17/09 | 23.24 |  |
| 9/17/09 | 23.25 |  |
| 9/17/09 | 23.24 |  |
| 9/17/09 | 23.23 |  |
| 9/17/09 | 23.23 |  |
| 9/17/09 | 23.13 |  |
| 9/17/09 | 23.03 |  |
| 9/17/09 | 22.96 |  |
| 9/17/09 | 22.86 |  |
| 9/17/09 | 22.75 |  |
| 9/17/09 | 22.68 |  |
| 9/17/09 | 22.62 |  |
| 9/17/09 | 22.56 |  |
| 9/17/09 | 22.54 |  |
| 9/17/09 | 22.5 |  |
| 9/17/09 | 22.43 |  |
| 9/17/09 | 22.39 |  |
| 9/17/09 | 22.36 |  |
| 9/17/09 | 22.34 |  |
| 9/17/09 | 22.34 |  |
| 9/17/09 | 22.29 |  |
| 9/17/09 | 22.3 |  |
| 9/17/09 | 22.32 |  |
| 9/17/09 | 22.35 |  |
| 9/17/09 | 22.38 |  |
| 9/17/09 | 22.42 |  |
| 9/17/09 | 22.46 |  |
| 9/17/09 | 22.51 |  |
| 9/17/09 | 22.54 |  |
| 9/17/09 | 22.58 |  |
| 9/17/09 | 22.63 |  |
| 9/17/09 | 22.67 |  |
| 9/17/09 | 22.73 |  |
| 9/17/09 | 22.79 |  |
| 9/17/09 | 22.85 |  |
| 9/17/09 | 22.91 |  |
| 9/17/09 | 22.97 |  |
| 9/17/09 | 23.03 |  |
| 9/17/09 | 23.07 |  |
| 9/17/09 | 23.14 |  |
| 9/16/09 | 23.21 |  |
| 9/16/09 | 23.28 |  |
| 9/16/09 | 23.35 |  |
| 9/16/09 | 23.42 |  |
| 9/16/09 | 23.5 |  |
| 9/16/09 | 23.59 |  |
| 9/16/09 | 23.63 |  |
| 9/16/09 | 23.72 |  |
| 9/16/09 | 23.83 |  |
| 9/16/09 | 23.85 |  |
| 9/16/09 | 23.8 |  |
| 9/16/09 | 23.78 |  |
| 9/16/09 | 23.85 |  |
| 9/16/09 | 23.86 |  |
| 9/16/09 | 23.78 |  |
| 9/16/09 | 23.67 |  |
| 9/16/09 | 23.53 |  |
| 9/16/09 | 23.41 |  |
| 9/16/09 | 23.32 |  |
| 9/16/09 | 23.19 |  |
| 9/16/09 | 23.1 |  |
| 9/16/09 | 22.92 |  |
| 9/16/09 | 22.78 |  |
| 9/16/09 | 22.61 |  |
| 9/16/09 | 22.52 |  |
| 9/16/09 | 22.47 |  |
| 9/16/09 | 22.4 |  |
| 9/16/09 | 22.37 |  |
| 9/16/09 | 22.38 |  |
| 9/16/09 | 22.39 |  |
| 9/16/09 | 22.4 |  |
| 9/16/09 | 22.43 |  |
| 9/16/09 | 22.46 |  |
| 9/16/09 | 22.5 |  |
| 9/16/09 | 22.55 |  |
| 9/16/09 | 22.61 |  |
| 9/16/09 | 22.65 |  |
| 9/16/09 | 22.71 |  |
| 9/16/09 | 22.78 |  |
| 9/16/09 | 22.86 |  |
| 9/16/09 | 22.93 |  |
| 9/16/09 | 23.01 |  |
| 9/16/09 | 23.07 |  |
| 9/16/09 | 23.15 |  |
| 9/16/09 | 23.19 |  |
| 9/16/09 | 23.24 |  |
| 9/16/09 | 23.23 |  |
| 9/16/09 | 23.29 |  |
| 9/15/09 | 23.25 |  |
| 9/15/09 | 23.35 |  |
| 9/15/09 | 23.23 |  |
| 9/15/09 | 23.57 |  |
| 9/15/09 | 23.44 |  |
| 9/15/09 | 23.56 |  |
| 9/15/09 | 23.39 |  |
| 9/15/09 | 23.38 |  |
| 9/15/09 | 23.34 |  |
| 9/15/09 | 23.25 |  |
| 9/15/09 | 23.14 |  |
| 9/15/09 | 23.18 |  |
| 9/15/09 | 23.22 |  |
| 9/15/09 | 23.07 |  |
| 9/15/09 | 23.03 |  |
| 9/15/09 | 22.93 |  |
| 9/15/09 | 22.88 |  |
| 9/15/09 | 22.82 |  |
| 9/15/09 | 22.69 |  |
| 9/15/09 | 22.64 |  |
| 9/15/09 | 22.66 |  |
| 9/15/09 | 22.61 |  |
| 9/15/09 | 22.56 |  |
| 9/15/09 | 22.49 |  |
| 9/15/09 | 22.43 |  |
| 9/15/09 | 22.39 |  |
| 9/15/09 | 22.38 |  |
| 9/15/09 | 22.35 |  |
| 9/15/09 | 22.33 |  |
| 9/15/09 | 22.33 |  |
| 9/15/09 | 22.33 |  |
| 9/15/09 | 22.35 |  |
| 9/15/09 | 22.38 |  |
| 9/15/09 | 22.41 |  |
| 9/15/09 | 22.45 |  |
| 9/15/09 | 22.48 |  |
| 9/15/09 | 22.52 |  |
| 9/15/09 | 22.55 |  |
| 9/15/09 | 22.58 |  |
| 9/15/09 | 22.62 |  |
| 9/15/09 | 22.66 |  |
| 9/15/09 | 22.7 |  |
| 9/15/09 | 22.73 |  |
| 9/15/09 | 22.78 |  |
| 9/15/09 | 22.83 |  |
| 9/15/09 | 22.89 |  |
| 9/15/09 | 22.96 |  |
| 9/15/09 | 23.03 |  |
| 9/14/09 | 23.1 |  |
| 9/14/09 | 23.16 |  |
| 9/14/09 | 23.21 |  |
| 9/14/09 | 23.25 |  |
| 9/14/09 | 23.32 |  |
| 9/14/09 | 23.2 |  |
| 9/14/09 | 23.13 |  |
| 9/14/09 | 23.13 |  |
| 9/14/09 | 23.13 |  |
| 9/14/09 | 23.16 |  |
| 9/14/09 | 22.93 |  |
| 9/14/09 | 23 |  |
| 9/14/09 | 22.95 |  |
| 9/14/09 | 22.89 |  |
| 9/14/09 | 22.76 |  |
| 9/14/09 | 22.55 |  |
| 9/14/09 | 22.44 |  |
| 9/14/09 | 22.5 |  |
| 9/14/09 | 22.24 |  |
| 9/14/09 | 22.25 |  |
| 9/14/09 | 22.32 |  |
| 9/14/09 | 22.52 |  |
| 9/14/09 | 22.39 |  |
| 9/14/09 | 22.28 |  |
| 9/14/09 | 22.19 |  |
| 9/14/09 | 22.15 |  |
| 9/14/09 | 22.13 |  |
| 9/14/09 | 22.11 |  |
| 9/14/09 | 22.09 |  |
| 9/14/09 | 22.08 |  |
| 9/14/09 | 22.08 |  |
| 9/14/09 | 22.1 |  |
| 9/14/09 | 22.14 |  |
| 9/14/09 | 22.17 |  |
| 9/14/09 | 22.22 |  |
| 9/14/09 | 22.27 |  |
| 9/14/09 | 22.3 |  |
| 9/14/09 | 22.35 |  |
| 9/14/09 | 22.39 |  |
| 9/14/09 | 22.43 |  |
| 9/14/09 | 22.48 |  |
| 9/14/09 | 22.54 |  |
| 9/14/09 | 22.6 |  |
| 9/14/09 | 22.68 |  |
| 9/14/09 | 22.64 |  |
| 9/14/09 | 22.66 |  |
| 9/14/09 | 22.65 |  |
| 9/14/09 | 22.61 |  |
| 9/13/09 | 22.57 |  |
| 9/13/09 | 22.7 |  |
| 9/13/09 | 22.8 |  |
| 9/13/09 | 22.63 |  |
| 9/13/09 | 22.65 |  |
| 9/13/09 | 22.68 |  |
| 9/13/09 | 22.66 |  |
| 9/13/09 | 22.65 |  |
| 9/13/09 | 22.65 |  |
| 9/13/09 | 22.5 |  |
| 9/13/09 | 22.54 |  |
| 9/13/09 | 22.55 |  |
| 9/13/09 | 22.29 |  |
| 9/13/09 | 22.17 |  |
| 9/13/09 | 22.13 |  |
| 9/13/09 | 22.2 |  |
| 9/13/09 | 22.39 |  |
| 9/13/09 | 22.2 |  |
| 9/13/09 | 22.04 |  |
| 9/13/09 | 21.91 |  |
| 9/13/09 | 21.74 |  |
| 9/13/09 | 21.6 |  |
| 9/13/09 | 21.55 |  |
| 9/13/09 | 21.62 |  |
| 9/13/09 | 21.66 |  |
| 9/13/09 | 21.58 |  |
| 9/13/09 | 21.51 |  |
| 9/13/09 | 21.51 |  |
| 9/13/09 | 21.5 |  |
| 9/13/09 | 21.5 |  |
| 9/13/09 | 21.49 |  |
| 9/13/09 | 21.5 |  |
| 9/13/09 | 21.54 |  |
| 9/13/09 | 21.56 |  |
| 9/13/09 | 21.62 |  |
| 9/13/09 | 21.65 |  |
| 9/13/09 | 21.69 |  |
| 9/13/09 | 21.73 |  |
| 9/13/09 | 21.75 |  |
| 9/13/09 | 21.78 |  |
| 9/13/09 | 21.8 |  |
| 9/13/09 | 21.83 |  |
| 9/13/09 | 21.85 |  |
| 9/13/09 | 21.88 |  |
| 9/13/09 | 21.9 |  |
| 9/13/09 | 21.93 |  |
| 9/13/09 | 21.96 |  |
| 9/13/09 | 21.98 |  |
| 9/12/09 | 22.01 |  |
| 9/12/09 | 22.03 |  |
| 9/12/09 | 22.05 |  |
| 9/12/09 | 22.08 |  |
| 9/12/09 | 22.1 |  |
| 9/12/09 | 22.12 |  |
| 9/12/09 | 22.1 |  |
| 9/12/09 | 22.15 |  |
| 9/12/09 | 22.18 |  |
| 9/12/09 | 22.18 |  |
| 9/12/09 | 22.06 |  |
| 9/12/09 | 22.02 |  |
| 9/12/09 | 22 |  |
| 9/12/09 | 21.97 |  |
| 9/12/09 | 21.99 |  |
| 9/12/09 | 22.02 |  |
| 9/12/09 | 22.02 |  |
| 9/12/09 | 21.98 |  |
| 9/12/09 | 21.99 |  |
| 9/12/09 | 21.98 |  |
| 9/12/09 | 21.97 |  |
| 9/12/09 | 21.96 |  |
| 9/12/09 | 22.01 |  |
| 9/12/09 | 21.96 |  |
| 9/12/09 | 21.89 |  |
| 9/12/09 | 21.88 |  |
| 9/12/09 | 21.9 |  |
| 9/12/09 | 21.91 |  |
| 9/12/09 | 21.9 |  |
| 9/12/09 | 21.89 |  |
| 9/12/09 | 21.88 |  |
| 9/12/09 | 21.89 |  |
| 9/12/09 | 21.92 |  |
| 9/12/09 | 21.94 |  |
| 9/12/09 | 21.97 |  |
| 9/12/09 | 21.99 |  |
| 9/12/09 | 22.02 |  |
| 9/12/09 | 22.05 |  |
| 9/12/09 | 22.08 |  |
| 9/12/09 | 22.11 |  |
| 9/12/09 | 22.13 |  |
| 9/12/09 | 22.16 |  |
| 9/12/09 | 22.19 |  |
| 9/12/09 | 22.22 |  |
| 9/12/09 | 22.27 |  |
| 9/12/09 | 22.29 |  |
| 9/12/09 | 22.34 |  |
| 9/12/09 | 22.38 |  |
| 9/11/09 | 22.42 |  |
| 9/11/09 | 22.44 |  |
| 9/11/09 | 22.46 |  |
| 9/11/09 | 22.47 |  |
| 9/11/09 | 22.51 |  |
| 9/11/09 | 22.55 |  |
| 9/11/09 | 22.56 |  |
| 9/11/09 | 22.58 |  |
| 9/11/09 | 22.64 |  |
| 9/11/09 | 22.68 |  |
| 9/11/09 | 22.69 |  |
| 9/11/09 | 22.69 |  |
| 9/11/09 | 22.65 |  |
| 9/11/09 | 22.67 |  |
| 9/11/09 | 22.75 |  |
| 9/11/09 | 22.78 |  |
| 9/11/09 | 22.85 |  |
| 9/11/09 | 22.75 |  |
| 9/11/09 | 22.89 |  |
| 9/11/09 | 22.73 |  |
| 9/11/09 | 22.63 |  |
| 9/11/09 | 22.58 |  |
| 9/11/09 | 22.54 |  |
| 9/11/09 | 22.51 |  |
| 9/11/09 | 22.44 |  |
| 9/11/09 | 22.38 |  |
| 9/11/09 | 22.29 |  |
| 9/11/09 | 22.31 |  |
| 9/11/09 | 22.32 |  |
| 9/11/09 | 22.36 |  |
| 9/11/09 | 22.38 |  |
| 9/11/09 | 22.41 |  |
| 9/11/09 | 22.46 |  |
| 9/11/09 | 22.51 |  |
| 9/11/09 | 22.58 |  |
| 9/11/09 | 22.64 |  |
| 9/11/09 | 22.71 |  |
| 9/11/09 | 22.74 |  |
| 9/11/09 | 22.76 |  |
| 9/11/09 | 22.82 |  |
| 9/11/09 | 22.84 |  |
| 9/11/09 | 22.87 |  |
| 9/11/09 | 22.94 |  |
| 9/11/09 | 22.98 |  |
| 9/11/09 | 23.03 |  |
| 9/11/09 | 23.09 |  |
| 9/11/09 | 23.15 |  |
| 9/10/09 | 23.2 |  |
| 9/10/09 | 23.25 |  |
| 9/10/09 | 23.31 |  |
| 9/10/09 | 23.36 |  |
| 9/10/09 | 23.43 |  |
| 9/10/09 | 23.48 |  |
| 9/10/09 | 23.54 |  |
| 9/10/09 | 23.59 |  |
| 9/10/09 | 23.59 |  |
| 9/10/09 | 23.6 |  |
| 9/10/09 | 23.65 |  |
| 9/10/09 | 23.64 |  |
| 9/10/09 | 23.57 |  |
| 9/10/09 | 23.61 |  |
| 9/10/09 | 23.62 |  |
| 9/10/09 | 23.59 |  |
| 9/10/09 | 23.53 |  |
| 9/10/09 | 23.49 |  |
| 9/10/09 | 23.47 |  |
| 9/10/09 | 23.43 |  |
| 9/10/09 | 23.31 |  |
| 9/10/09 | 23.27 |  |
| 9/10/09 | 23.24 |  |
| 9/10/09 | 23.22 |  |
| 9/10/09 | 23.19 |  |
| 9/10/09 | 23.17 |  |
| 9/10/09 | 23.15 |  |
| 9/10/09 | 23.13 |  |
| 9/10/09 | 23.14 |  |
| 9/10/09 | 23.16 |  |
| 9/10/09 | 23.19 |  |
| 9/10/09 | 23.21 |  |
| 9/10/09 | 23.24 |  |
| 9/10/09 | 23.28 |  |
| 9/10/09 | 23.32 |  |
| 9/10/09 | 23.36 |  |
| 9/10/09 | 23.4 |  |
| 9/10/09 | 23.43 |  |
| 9/10/09 | 23.46 |  |
| 9/10/09 | 23.5 |  |
| 9/10/09 | 23.54 |  |
| 9/10/09 | 23.57 |  |
| 9/10/09 | 23.61 |  |
| 9/10/09 | 23.67 |  |
| 9/10/09 | 23.72 |  |
| 9/10/09 | 23.77 |  |
| 9/10/09 | 23.82 |  |
| 9/10/09 | 23.88 |  |
| 9/9/09 | 23.92 |  |
| 9/9/09 | 23.91 |  |
| 9/9/09 | 23.9 |  |
| 9/9/09 | 23.9 |  |
| 9/9/09 | 23.96 |  |
| 9/9/09 | 24 |  |
| 9/9/09 | 24.06 |  |
| 9/9/09 | 24.06 |  |
| 9/9/09 | 24.02 |  |
| 9/9/09 | 24.06 |  |
| 9/9/09 | 24.21 |  |
| 9/9/09 | 24.4 |  |
| 9/9/09 | 24.38 |  |
| 9/9/09 | 24.34 |  |
| 9/9/09 | 24.27 |  |
| 9/9/09 | 24.24 |  |
| 9/9/09 | 24.35 |  |
| 9/9/09 | 24.04 |  |
| 9/9/09 | 23.9 |  |
| 9/9/09 | 23.87 |  |
| 9/9/09 | 23.83 |  |
| 9/9/09 | 23.67 |  |
| 9/9/09 | 23.36 |  |
| 9/9/09 | 23.15 |  |
| 9/9/09 | 23.13 |  |
| 9/9/09 | 23.1 |  |
| 9/9/09 | 23.09 |  |
| 9/9/09 | 23.05 |  |
| 9/9/09 | 23.03 |  |
| 9/9/09 | 23.03 |  |
| 9/9/09 | 23.06 |  |
| 9/9/09 | 23.08 |  |
| 9/9/09 | 23.11 |  |
| 9/9/09 | 23.13 |  |
| 9/9/09 | 23.16 |  |
| 9/9/09 | 23.18 |  |
| 9/9/09 | 23.21 |  |
| 9/9/09 | 23.24 |  |
| 9/9/09 | 23.27 |  |
| 9/9/09 | 23.3 |  |
| 9/9/09 | 23.32 |  |
| 9/9/09 | 23.34 |  |
| 9/9/09 | 23.37 |  |
| 9/9/09 | 23.4 |  |
| 9/9/09 | 23.43 |  |
| 9/9/09 | 23.46 |  |
| 9/9/09 | 23.49 |  |
| 9/9/09 | 23.53 |  |
| 9/8/09 | 23.57 |  |
| 9/8/09 | 23.6 |  |
| 9/8/09 | 23.62 |  |
| 9/8/09 | 23.65 |  |
| 9/8/09 | 23.69 |  |
| 9/8/09 | 23.73 |  |
| 9/8/09 | 23.74 |  |
| 9/8/09 | 23.79 |  |
| 9/8/09 | 23.83 |  |
| 9/8/09 | 23.85 |  |
| 9/8/09 | 23.83 |  |
| 9/8/09 | 23.87 |  |
| 9/8/09 | 23.88 |  |
| 9/8/09 | 23.85 |  |
| 9/8/09 | 23.79 |  |
| 9/8/09 | 23.75 |  |
| 9/8/09 | 23.75 |  |
| 9/8/09 | 23.72 |  |
| 9/8/09 | 23.63 |  |
| 9/8/09 | 23.49 |  |
| 9/8/09 | 23.34 |  |
| 9/8/09 | 23.34 |  |
| 9/8/09 | 23.33 |  |
| 9/8/09 | 23.32 |  |
| 9/8/09 | 23.29 |  |
| 9/8/09 | 23.27 |  |
| 9/8/09 | 23.26 |  |
| 9/8/09 | 23.28 |  |
| 9/8/09 | 23.28 |  |
| 9/8/09 | 23.28 |  |
| 9/8/09 | 23.28 |  |
| 9/8/09 | 23.29 |  |
| 9/8/09 | 23.3 |  |
| 9/8/09 | 23.32 |  |
| 9/8/09 | 23.34 |  |
| 9/8/09 | 23.36 |  |
| 9/8/09 | 23.39 |  |
| 9/8/09 | 23.41 |  |
| 9/8/09 | 23.43 |  |
| 9/8/09 | 23.46 |  |
| 9/8/09 | 23.48 |  |
| 9/8/09 | 23.5 |  |
| 9/8/09 | 23.52 |  |
| 9/8/09 | 23.53 |  |
| 9/8/09 | 23.56 |  |
| 9/8/09 | 23.59 |  |
| 9/8/09 | 23.61 |  |
| 9/8/09 | 23.64 |  |
| 9/7/09 | 23.66 |  |
| 9/7/09 | 23.69 |  |
| 9/7/09 | 23.72 |  |
| 9/7/09 | 23.74 |  |
| 9/7/09 | 23.77 |  |
| 9/7/09 | 23.8 |  |
| 9/7/09 | 23.83 |  |
| 9/7/09 | 23.86 |  |
| 9/7/09 | 23.89 |  |
| 9/7/09 | 23.92 |  |
| 9/7/09 | 23.94 |  |
| 9/7/09 | 23.94 |  |
| 9/7/09 | 23.93 |  |
| 9/7/09 | 23.95 |  |
| 9/7/09 | 23.91 |  |
| 9/7/09 | 23.9 |  |
| 9/7/09 | 23.88 |  |
| 9/7/09 | 23.87 |  |
| 9/7/09 | 23.84 |  |
| 9/7/09 | 23.85 |  |
| 9/7/09 | 23.82 |  |
| 9/7/09 | 23.81 |  |
| 9/7/09 | 23.8 |  |
| 9/7/09 | 23.77 |  |
| 9/7/09 | 23.77 |  |
| 9/7/09 | 23.78 |  |
| 9/7/09 | 23.77 |  |
| 9/7/09 | 23.77 |  |
| 9/7/09 | 23.77 |  |
| 9/7/09 | 23.79 |  |
| 9/7/09 | 23.8 |  |
| 9/7/09 | 23.82 |  |
| 9/7/09 | 23.85 |  |
| 9/7/09 | 23.86 |  |
| 9/7/09 | 23.9 |  |
| 9/7/09 | 23.93 |  |
| 9/7/09 | 23.96 |  |
| 9/7/09 | 23.99 |  |
| 9/7/09 | 24.02 |  |
| 9/7/09 | 24.04 |  |
| 9/7/09 | 24.09 |  |
| 9/7/09 | 24.12 |  |
| 9/7/09 | 24.17 |  |
| 9/7/09 | 24.21 |  |
| 9/7/09 | 24.24 |  |
| 9/7/09 | 24.27 |  |
| 9/7/09 | 24.3 |  |
| 9/7/09 | 24.34 |  |
| 9/6/09 | 24.38 |  |
| 9/6/09 | 24.4 |  |
| 9/6/09 | 24.41 |  |
| 9/6/09 | 24.43 |  |
| 9/6/09 | 24.46 |  |
| 9/6/09 | 24.53 |  |
| 9/6/09 | 24.62 |  |
| 9/6/09 | 24.64 |  |
| 9/6/09 | 24.68 |  |
| 9/6/09 | 24.73 |  |
| 9/6/09 | 24.84 |  |
| 9/6/09 | 24.9 |  |
| 9/6/09 | 24.88 |  |
| 9/6/09 | 24.74 |  |
| 9/6/09 | 24.71 |  |
| 9/6/09 | 24.69 |  |
| 9/6/09 | 24.62 |  |
| 9/6/09 | 24.49 |  |
| 9/6/09 | 24.39 |  |
| 9/6/09 | 24.29 |  |
| 9/6/09 | 24.12 |  |
| 9/6/09 | 24.01 |  |
| 9/6/09 | 23.89 |  |
| 9/6/09 | 23.73 |  |
| 9/6/09 | 23.57 |  |
| 9/6/09 | 23.45 |  |
| 9/6/09 | 23.38 |  |
| 9/6/09 | 23.34 |  |
| 9/6/09 | 23.32 |  |
| 9/6/09 | 23.3 |  |
| 9/6/09 | 23.31 |  |
| 9/6/09 | 23.34 |  |
| 9/6/09 | 23.39 |  |
| 9/6/09 | 23.44 |  |
| 9/6/09 | 23.51 |  |
| 9/6/09 | 23.57 |  |
| 9/6/09 | 23.64 |  |
| 9/6/09 | 23.71 |  |
| 9/6/09 | 23.78 |  |
| 9/6/09 | 23.87 |  |
| 9/6/09 | 23.96 |  |
| 9/6/09 | 24.04 |  |
| 9/6/09 | 24.11 |  |
| 9/6/09 | 24.17 |  |
| 9/6/09 | 24.17 |  |
| 9/6/09 | 24.27 |  |
| 9/6/09 | 24.28 |  |
| 9/6/09 | 24.45 |  |
| 9/5/09 | 24.15 |  |
| 9/5/09 | 24.27 |  |
| 9/5/09 | 24.15 |  |
| 9/5/09 | 24.05 |  |
| 9/5/09 | 24.12 |  |
| 9/5/09 | 24.01 |  |
| 9/5/09 | 23.96 |  |
| 9/5/09 | 23.86 |  |
| 9/5/09 | 23.83 |  |
| 9/5/09 | 24.08 |  |
| 9/5/09 | 24.36 |  |
| 9/5/09 | 24.2 |  |
| 9/5/09 | 24.45 |  |
| 9/5/09 | 24.35 |  |
| 9/5/09 | 23.82 |  |
| 9/5/09 | 23.7 |  |
| 9/5/09 | 23.7 |  |
| 9/5/09 | 23.76 |  |
| 9/5/09 | 23.53 |  |
| 9/5/09 | 23.6 |  |
| 9/5/09 | 23.52 |  |
| 9/5/09 | 23.48 |  |
| 9/5/09 | 23.46 |  |
| 9/5/09 | 23.44 |  |
| 9/5/09 | 23.28 |  |
| 9/5/09 | 23.21 |  |
| 9/5/09 | 23.18 |  |
| 9/5/09 | 23.16 |  |
| 9/5/09 | 23.13 |  |
| 9/5/09 | 23.13 |  |
| 9/5/09 | 23.15 |  |
| 9/5/09 | 23.18 |  |
| 9/5/09 | 23.23 |  |
| 9/5/09 | 23.28 |  |
| 9/5/09 | 23.35 |  |
| 9/5/09 | 23.41 |  |
| 9/5/09 | 23.47 |  |
| 9/5/09 | 23.51 |  |
| 9/5/09 | 23.54 |  |
| 9/5/09 | 23.6 |  |
| 9/5/09 | 23.66 |  |
| 9/5/09 | 23.7 |  |
| 9/5/09 | 23.83 |  |
| 9/5/09 | 23.89 |  |
| 9/5/09 | 23.96 |  |
| 9/5/09 | 24.04 |  |
| 9/5/09 | 24.04 |  |
| 9/5/09 | 23.91 |  |
| 9/4/09 | 24 |  |
| 9/4/09 | 23.97 |  |
| 9/4/09 | 24.01 |  |
| 9/4/09 | 24.03 |  |
| 9/4/09 | 23.82 |  |
| 9/4/09 | 23.74 |  |
| 9/4/09 | 23.63 |  |
| 9/4/09 | 23.64 |  |
| 9/4/09 | 23.77 |  |
| 9/4/09 | 23.71 |  |
| 9/4/09 | 23.67 |  |
| 9/4/09 | 23.63 |  |
| 9/4/09 | 23.69 |  |
| 9/4/09 | 23.7 |  |
| 9/4/09 | 23.55 |  |
| 9/4/09 | 23.47 |  |
| 9/4/09 | 23.39 |  |
| 9/4/09 | 23.38 |  |
| 9/4/09 | 23.32 |  |
| 9/4/09 | 23.31 |  |
| 9/4/09 | 23.24 |  |
| 9/4/09 | 23.18 |  |
| 9/4/09 | 23.11 |  |
| 9/4/09 | 23.12 |  |
| 9/4/09 | 23.03 |  |
| 9/4/09 | 22.92 |  |
| 9/4/09 | 22.89 |  |
| 9/4/09 | 22.88 |  |
| 9/4/09 | 22.86 |  |
| 9/4/09 | 22.84 |  |
| 9/4/09 | 22.86 |  |
| 9/4/09 | 22.9 |  |
| 9/4/09 | 22.94 |  |
| 9/4/09 | 23 |  |
| 9/4/09 | 23.06 |  |
| 9/4/09 | 23.1 |  |
| 9/4/09 | 23.17 |  |
| 9/4/09 | 23.23 |  |
| 9/4/09 | 23.31 |  |
| 9/4/09 | 23.4 |  |
| 9/4/09 | 23.49 |  |
| 9/4/09 | 23.58 |  |
| 9/4/09 | 23.65 |  |
| 9/4/09 | 23.73 |  |
| 9/4/09 | 23.78 |  |
| 9/4/09 | 23.83 |  |
| 9/4/09 | 23.81 |  |
| 9/4/09 | 23.81 |  |
| 9/3/09 | 23.88 |  |
| 9/3/09 | 23.92 |  |
| 9/3/09 | 23.87 |  |
| 9/3/09 | 23.81 |  |
| 9/3/09 | 23.84 |  |
| 9/3/09 | 23.79 |  |
| 9/3/09 | 23.82 |  |
| 9/3/09 | 23.81 |  |
| 9/3/09 | 23.59 |  |
| 9/3/09 | 23.62 |  |
| 9/3/09 | 23.64 |  |
| 9/3/09 | 23.67 |  |
| 9/3/09 | 23.92 |  |
| 9/3/09 | 23.63 |  |
| 9/3/09 | 23.85 |  |
| 9/3/09 | 24.18 |  |
| 9/3/09 | 24.09 |  |
| 9/3/09 | 23.99 |  |
| 9/3/09 | 23.96 |  |
| 9/3/09 | 24.05 |  |
| 9/3/09 | 23.86 |  |
| 9/3/09 | 23.62 |  |
| 9/3/09 | 23.25 |  |
| 9/3/09 | 22.92 |  |
| 9/3/09 | 22.91 |  |
| 9/3/09 | 22.85 |  |
| 9/3/09 | 22.73 |  |
| 9/3/09 | 22.74 |  |
| 9/3/09 | 22.73 |  |
| 9/3/09 | 22.7 |  |
| 9/3/09 | 22.73 |  |
| 9/3/09 | 22.77 |  |
| 9/3/09 | 22.82 |  |
| 9/3/09 | 22.86 |  |
| 9/3/09 | 22.93 |  |
| 9/3/09 | 23 |  |
| 9/3/09 | 23.07 |  |
| 9/3/09 | 23.16 |  |
| 9/3/09 | 23.24 |  |
| 9/3/09 | 23.32 |  |
| 9/3/09 | 23.42 |  |
| 9/3/09 | 23.52 |  |
| 9/3/09 | 23.59 |  |
| 9/3/09 | 23.66 |  |
| 9/3/09 | 23.71 |  |
| 9/3/09 | 23.78 |  |
| 9/3/09 | 23.81 |  |
| 9/3/09 | 23.77 |  |
| 9/2/09 | 24.01 |  |
| 9/2/09 | 23.9 |  |
| 9/2/09 | 23.83 |  |
| 9/2/09 | 23.77 |  |
| 9/2/09 | 23.71 |  |
| 9/2/09 | 23.63 |  |
| 9/2/09 | 23.66 |  |
| 9/2/09 | 23.64 |  |
| 9/2/09 | 23.78 |  |
| 9/2/09 | 23.97 |  |
| 9/2/09 | 23.73 |  |
| 9/2/09 | 24.05 |  |
| 9/2/09 | 24 |  |
| 9/2/09 | 24.05 |  |
| 9/2/09 | 24.48 |  |
| 9/2/09 | 24.28 |  |
| 9/2/09 | 24.46 |  |
| 9/2/09 | 24.25 |  |
| 9/2/09 | 24.29 |  |
| 9/2/09 | 24.04 |  |
| 9/2/09 | 23.68 |  |
| 9/2/09 | 22.99 |  |
| 9/2/09 | 23 |  |
| 9/2/09 | 22.78 |  |
| 9/2/09 | 22.72 |  |
| 9/2/09 | 22.65 |  |
| 9/2/09 | 22.65 |  |
| 9/2/09 | 22.65 |  |
| 9/2/09 | 22.64 |  |
| 9/2/09 | 22.63 |  |
| 9/2/09 | 22.64 |  |
| 9/2/09 | 22.68 |  |
| 9/2/09 | 22.72 |  |
| 9/2/09 | 22.78 |  |
| 9/2/09 | 22.85 |  |
| 9/2/09 | 22.9 |  |
| 9/2/09 | 22.96 |  |
| 9/2/09 | 23.01 |  |
| 9/2/09 | 23.06 |  |
| 9/2/09 | 23.11 |  |
| 9/2/09 | 23.18 |  |
| 9/2/09 | 23.24 |  |
| 9/2/09 | 23.31 |  |
| 9/2/09 | 23.39 |  |
| 9/2/09 | 23.5 |  |
| 9/2/09 | 23.58 |  |
| 9/2/09 | 23.69 |  |
| 9/2/09 | 23.76 |  |
| 9/1/09 | 23.86 |  |
| 9/1/09 | 23.95 |  |
| 9/1/09 | 23.88 |  |
| 9/1/09 | 23.85 |  |
| 9/1/09 | 23.81 |  |
| 9/1/09 | 23.91 |  |
| 9/1/09 | 23.85 |  |
| 9/1/09 | 23.85 |  |
| 9/1/09 | 23.69 |  |
| 9/1/09 | 23.63 |  |
| 9/1/09 | 23.64 |  |
| 9/1/09 | 24.12 |  |
| 9/1/09 | 24.13 |  |
| 9/1/09 | 23.96 |  |
| 9/1/09 | 23.95 |  |
| 9/1/09 | 23.87 |  |
| 9/1/09 | 23.89 |  |
| 9/1/09 | 24.02 |  |
| 9/1/09 | 23.99 |  |
| 9/1/09 | 23.73 |  |
| 9/1/09 | 23.59 |  |
| 9/1/09 | 23.46 |  |
| 9/1/09 | 23.33 |  |
| 9/1/09 | 23.14 |  |
| 9/1/09 | 22.92 |  |
| 9/1/09 | 22.75 |  |
| 9/1/09 | 22.74 |  |
| 9/1/09 | 22.77 |  |
| 9/1/09 | 22.78 |  |
| 9/1/09 | 22.79 |  |
| 9/1/09 | 22.81 |  |
| 9/1/09 | 22.86 |  |
| 9/1/09 | 22.89 |  |
| 9/1/09 | 22.93 |  |
| 9/1/09 | 22.98 |  |
| 9/1/09 | 23.03 |  |
| 9/1/09 | 23.09 |  |
| 9/1/09 | 23.14 |  |
| 9/1/09 | 23.2 |  |
| 9/1/09 | 23.25 |  |
| 9/1/09 | 23.3 |  |
| 9/1/09 | 23.35 |  |
| 9/1/09 | 23.4 |  |
| 9/1/09 | 23.48 |  |
| 9/1/09 | 23.55 |  |
| 9/1/09 | 23.64 |  |
| 9/1/09 | 23.73 |  |
| 9/1/09 | 23.8 |  |
| 8/31/09 | 23.87 |  |
| 8/31/09 | 23.96 |  |
| 8/31/09 | 24.07 |  |
| 8/31/09 | 24.17 |  |
| 8/31/09 | 24.27 |  |
| 8/31/09 | 24.33 |  |
| 8/31/09 | 24.43 |  |
| 8/31/09 | 24.46 |  |
| 8/31/09 | 24.29 |  |
| 8/31/09 | 24.69 |  |
| 8/31/09 | 24.25 |  |
| 8/31/09 | 24.34 |  |
| 8/31/09 | 24.09 |  |
| 8/31/09 | 23.99 |  |
| 8/31/09 | 24.03 |  |
| 8/31/09 | 24.02 |  |
| 8/31/09 | 24.07 |  |
| 8/31/09 | 24.1 |  |
| 8/31/09 | 24.09 |  |
| 8/31/09 | 24.01 |  |
| 8/31/09 | 23.99 |  |
| 8/31/09 | 23.8 |  |
| 8/31/09 | 23.76 |  |
| 8/31/09 | 23.68 |  |
| 8/31/09 | 23.56 |  |
| 8/31/09 | 23.47 |  |
| 8/31/09 | 23.4 |  |
| 8/31/09 | 23.37 |  |
| 8/31/09 | 23.34 |  |
| 8/31/09 | 23.3 |  |
| 8/31/09 | 23.27 |  |
| 8/31/09 | 23.29 |  |
| 8/31/09 | 23.29 |  |
| 8/31/09 | 23.37 |  |
| 8/31/09 | 23.43 |  |
| 8/31/09 | 23.5 |  |
| 8/31/09 | 23.56 |  |
| 8/31/09 | 23.62 |  |
| 8/31/09 | 23.68 |  |
| 8/31/09 | 23.73 |  |
| 8/31/09 | 23.77 |  |
| 8/31/09 | 23.82 |  |
| 8/31/09 | 23.86 |  |
| 8/31/09 | 23.91 |  |
| 8/31/09 | 23.96 |  |
| 8/31/09 | 24 |  |
| 8/31/09 | 24.03 |  |
| 8/31/09 | 24.06 |  |
| 8/30/09 | 24.1 |  |
| 8/30/09 | 24.13 |  |
| 8/30/09 | 24.17 |  |
| 8/30/09 | 24.2 |  |
| 8/30/09 | 24.24 |  |
| 8/30/09 | 24.28 |  |
| 8/30/09 | 24.33 |  |
| 8/30/09 | 24.36 |  |
| 8/30/09 | 24.41 |  |
| 8/30/09 | 24.47 |  |
| 8/30/09 | 24.49 |  |
| 8/30/09 | 24.5 |  |
| 8/30/09 | 24.51 |  |
| 8/30/09 | 24.55 |  |
| 8/30/09 | 24.57 |  |
| 8/30/09 | 24.61 |  |
| 8/30/09 | 24.55 |  |
| 8/30/09 | 24.54 |  |
| 8/30/09 | 24.56 |  |
| 8/30/09 | 24.55 |  |
| 8/30/09 | 24.57 |  |
| 8/30/09 | 24.58 |  |
| 8/30/09 | 24.62 |  |
| 8/30/09 | 24.63 |  |
| 8/30/09 | 24.55 |  |
| 8/30/09 | 24.48 |  |
| 8/30/09 | 24.48 |  |
| 8/30/09 | 24.48 |  |
| 8/30/09 | 24.45 |  |
| 8/30/09 | 24.45 |  |
| 8/30/09 | 24.49 |  |
| 8/30/09 | 24.52 |  |
| 8/30/09 | 24.57 |  |
| 8/30/09 | 24.63 |  |
| 8/30/09 | 24.69 |  |
| 8/30/09 | 24.74 |  |
| 8/30/09 | 24.78 |  |
| 8/30/09 | 24.83 |  |
| 8/30/09 | 24.86 |  |
| 8/30/09 | 24.9 |  |
| 8/30/09 | 24.94 |  |
| 8/30/09 | 24.97 |  |
| 8/30/09 | 25 |  |
| 8/30/09 | 25.04 |  |
| 8/30/09 | 25.08 |  |
| 8/30/09 | 25.13 |  |
| 8/30/09 | 25.18 |  |
| 8/30/09 | 25.24 |  |
| 8/29/09 | 25.31 |  |
| 8/29/09 | 25.37 |  |
| 8/29/09 | 25.44 |  |
| 8/29/09 | 25.51 |  |
| 8/29/09 | 25.59 |  |
| 8/29/09 | 25.66 |  |
| 8/29/09 | 25.7 |  |
| 8/29/09 | 25.73 |  |
| 8/29/09 | 25.7 |  |
| 8/29/09 | 25.64 |  |
| 8/29/09 | 25.6 |  |
| 8/29/09 | 25.73 |  |
| 8/29/09 | 25.71 |  |
| 8/29/09 | 25.47 |  |
| 8/29/09 | 25.52 |  |
| 8/29/09 | 25.32 |  |
| 8/29/09 | 25.3 |  |
| 8/29/09 | 25.25 |  |
| 8/29/09 | 25.21 |  |
| 8/29/09 | 25.19 |  |
| 8/29/09 | 25.26 |  |
| 8/29/09 | 25.29 |  |
| 8/29/09 | 25.18 |  |
| 8/29/09 | 25.15 |  |
| 8/29/09 | 25.14 |  |
| 8/29/09 | 25.17 |  |
| 8/29/09 | 25.17 |  |
| 8/29/09 | 25.17 |  |
| 8/29/09 | 25.16 |  |
| 8/29/09 | 25.18 |  |
| 8/29/09 | 25.19 |  |
| 8/29/09 | 25.21 |  |
| 8/29/09 | 25.23 |  |
| 8/29/09 | 25.25 |  |
| 8/29/09 | 25.28 |  |
| 8/29/09 | 25.3 |  |
| 8/29/09 | 25.33 |  |
| 8/29/09 | 25.36 |  |
| 8/29/09 | 25.38 |  |
| 8/29/09 | 25.41 |  |
| 8/29/09 | 25.44 |  |
| 8/29/09 | 25.47 |  |
| 8/29/09 | 25.5 |  |
| 8/29/09 | 25.53 |  |
| 8/29/09 | 25.55 |  |
| 8/29/09 | 25.59 |  |
| 8/29/09 | 25.62 |  |
| 8/29/09 | 25.64 |  |
| 8/28/09 | 25.67 |  |
| 8/28/09 | 25.7 |  |
| 8/28/09 | 25.73 |  |
| 8/28/09 | 25.76 |  |
| 8/28/09 | 25.78 |  |
| 8/28/09 | 25.8 |  |
| 8/28/09 | 25.83 |  |
| 8/28/09 | 25.86 |  |
| 8/28/09 | 25.88 |  |
| 8/28/09 | 25.9 |  |
| 8/28/09 | 25.91 |  |
| 8/28/09 | 25.93 |  |
| 8/28/09 | 25.91 |  |
| 8/28/09 | 25.85 |  |
| 8/28/09 | 25.78 |  |
| 8/28/09 | 25.76 |  |
| 8/28/09 | 25.74 |  |
| 8/28/09 | 25.72 |  |
| 8/28/09 | 25.72 |  |
| 8/28/09 | 25.71 |  |
| 8/28/09 | 25.72 |  |
| 8/28/09 | 25.77 |  |
| 8/28/09 | 25.87 |  |
| 8/28/09 | 25.81 |  |
| 8/28/09 | 25.81 |  |
| 8/28/09 | 25.82 |  |
| 8/28/09 | 25.82 |  |
| 8/28/09 | 25.83 |  |
| 8/28/09 | 25.82 |  |
| 8/28/09 | 25.82 |  |
| 8/28/09 | 25.83 |  |
| 8/28/09 | 25.86 |  |
| 8/28/09 | 25.87 |  |
| 8/28/09 | 25.91 |  |
| 8/28/09 | 25.93 |  |
| 8/28/09 | 25.99 |  |
| 8/28/09 | 26.05 |  |
| 8/28/09 | 26.09 |  |
| 8/28/09 | 26.12 |  |
| 8/28/09 | 26.16 |  |
| 8/28/09 | 26.24 |  |
| 8/28/09 | 26.28 |  |
| 8/28/09 | 26.33 |  |
| 8/28/09 | 26.37 |  |
| 8/28/09 | 26.43 |  |
| 8/28/09 | 26.5 |  |
| 8/28/09 | 26.55 |  |
| 8/28/09 | 26.61 |  |
| 8/27/09 | 26.68 |  |
| 8/27/09 | 26.74 |  |
| 8/27/09 | 26.81 |  |
| 8/27/09 | 26.86 |  |
| 8/27/09 | 26.96 |  |
| 8/27/09 | 26.99 |  |
| 8/27/09 | 27.12 |  |
| 8/27/09 | 27.21 |  |
| 8/27/09 | 27.26 |  |
| 8/27/09 | 27.19 |  |
| 8/27/09 | 27.07 |  |
| 8/27/09 | 26.99 |  |
| 8/27/09 | 26.8 |  |
| 8/27/09 | 26.66 |  |
| 8/27/09 | 26.85 |  |
| 8/27/09 | 26.7 |  |
| 8/27/09 | 26.62 |  |
| 8/27/09 | 26.57 |  |
| 8/27/09 | 26.5 |  |
| 8/27/09 | 26.44 |  |
| 8/27/09 | 26.46 |  |
| 8/27/09 | 26.48 |  |
| 8/27/09 | 26.42 |  |
| 8/27/09 | 26.37 |  |
| 8/27/09 | 26.36 |  |
| 8/27/09 | 26.32 |  |
| 8/27/09 | 26.29 |  |
| 8/27/09 | 26.28 |  |
| 8/27/09 | 26.32 |  |
| 8/27/09 | 26.32 |  |
| 8/27/09 | 26.32 |  |
| 8/27/09 | 26.34 |  |
| 8/27/09 | 26.38 |  |
| 8/27/09 | 26.41 |  |
| 8/27/09 | 26.46 |  |
| 8/27/09 | 26.5 |  |
| 8/27/09 | 26.56 |  |
| 8/27/09 | 26.62 |  |
| 8/27/09 | 26.68 |  |
| 8/27/09 | 26.72 |  |
| 8/27/09 | 26.81 |  |
| 8/27/09 | 26.87 |  |
| 8/27/09 | 26.94 |  |
| 8/27/09 | 27.01 |  |
| 8/27/09 | 27.06 |  |
| 8/27/09 | 27.12 |  |
| 8/27/09 | 27.16 |  |
| 8/27/09 | 27.23 |  |
| 8/26/09 | 27.28 |  |
| 8/26/09 | 27.36 |  |
| 8/26/09 | 27.41 |  |
| 8/26/09 | 27.45 |  |
| 8/26/09 | 27.53 |  |
| 8/26/09 | 27.47 |  |
| 8/26/09 | 27.49 |  |
| 8/26/09 | 27.42 |  |
| 8/26/09 | 27.27 |  |
| 8/26/09 | 27.13 |  |
| 8/26/09 | 26.86 |  |
| 8/26/09 | 26.9 |  |
| 8/26/09 | 26.91 |  |
| 8/26/09 | 26.6 |  |
| 8/26/09 | 26.54 |  |
| 8/26/09 | 26.43 |  |
| 8/26/09 | 26.46 |  |
| 8/26/09 | 26.32 |  |
| 8/26/09 | 26.33 |  |
| 8/26/09 | 26.24 |  |
| 8/26/09 | 26.13 |  |
| 8/26/09 | 25.92 |  |
| 8/26/09 | 25.92 |  |
| 8/26/09 | 26.04 |  |
| 8/26/09 | 26 |  |
| 8/26/09 | 25.92 |  |
| 8/26/09 | 25.89 |  |
| 8/26/09 | 25.86 |  |
| 8/26/09 | 25.84 |  |
| 8/26/09 | 25.82 |  |
| 8/26/09 | 25.82 |  |
| 8/26/09 | 25.85 |  |
| 8/26/09 | 25.9 |  |
| 8/26/09 | 25.96 |  |
| 8/26/09 | 26.02 |  |
| 8/26/09 | 26.1 |  |
| 8/26/09 | 26.15 |  |
| 8/26/09 | 26.22 |  |
| 8/26/09 | 26.29 |  |
| 8/26/09 | 26.37 |  |
| 8/26/09 | 26.43 |  |
| 8/26/09 | 26.49 |  |
| 8/26/09 | 26.41 |  |
| 8/26/09 | 26.61 |  |
| 8/26/09 | 26.47 |  |
| 8/26/09 | 26.49 |  |
| 8/26/09 | 26.46 |  |
| 8/26/09 | 26.46 |  |
| 8/25/09 | 26.42 |  |
| 8/25/09 | 26.41 |  |
| 8/25/09 | 26.41 |  |
| 8/25/09 | 26.33 |  |
| 8/25/09 | 26.3 |  |
| 8/25/09 | 26.3 |  |
| 8/25/09 | 26.33 |  |
| 8/25/09 | 26.38 |  |
| 8/25/09 | 26.48 |  |
| 8/25/09 | 26.53 |  |
| 8/25/09 | 26.37 |  |
| 8/25/09 | 26.37 |  |
| 8/25/09 | 26.36 |  |
| 8/25/09 | 26.18 |  |
| 8/25/09 | 25.99 |  |
| 8/25/09 | 26.04 |  |
| 8/25/09 | 26.01 |  |
| 8/25/09 | 26.05 |  |
| 8/25/09 | 26.01 |  |
| 8/25/09 | 25.91 |  |
| 8/25/09 | 25.81 |  |
| 8/25/09 | 25.82 |  |
| 8/25/09 | 25.76 |  |
| 8/25/09 | 25.74 |  |
| 8/25/09 | 25.64 |  |
| 8/25/09 | 25.59 |  |
| 8/25/09 | 25.56 |  |
| 8/25/09 | 25.55 |  |
| 8/25/09 | 25.53 |  |
| 8/25/09 | 25.53 |  |
| 8/25/09 | 25.52 |  |
| 8/25/09 | 25.53 |  |
| 8/25/09 | 25.57 |  |
| 8/25/09 | 25.61 |  |
| 8/25/09 | 25.66 |  |
| 8/25/09 | 25.71 |  |
| 8/25/09 | 25.77 |  |
| 8/25/09 | 25.82 |  |
| 8/25/09 | 25.88 |  |
| 8/25/09 | 25.93 |  |
| 8/25/09 | 25.97 |  |
| 8/25/09 | 26.05 |  |
| 8/25/09 | 26.12 |  |
| 8/25/09 | 26.16 |  |
| 8/25/09 | 26.2 |  |
| 8/25/09 | 26.31 |  |
| 8/25/09 | 26.37 |  |
| 8/25/09 | 26.44 |  |
| 8/24/09 | 26.53 |  |
| 8/24/09 | 26.61 |  |
| 8/24/09 | 26.61 |  |
| 8/24/09 | 26.71 |  |
| 8/24/09 | 26.66 |  |
| 8/24/09 | 26.62 |  |
| 8/24/09 | 26.76 |  |
| 8/24/09 | 26.7 |  |
| 8/24/09 | 26.55 |  |
| 8/24/09 | 26.39 |  |
| 8/24/09 | 26.32 |  |
| 8/24/09 | 26.43 |  |
| 8/24/09 | 26.42 |  |
| 8/24/09 | 26.26 |  |
| 8/24/09 | 26.16 |  |
| 8/24/09 | 26.12 |  |
| 8/24/09 | 26.06 |  |
| 8/24/09 | 26.12 |  |
| 8/24/09 | 26.09 |  |
| 8/24/09 | 26.13 |  |
| 8/24/09 | 26.18 |  |
| 8/24/09 | 26.11 |  |
| 8/24/09 | 25.91 |  |
| 8/24/09 | 25.86 |  |
| 8/24/09 | 25.88 |  |
| 8/24/09 | 25.84 |  |
| 8/24/09 | 25.84 |  |
| 8/24/09 | 25.79 |  |
| 8/24/09 | 25.8 |  |
| 8/24/09 | 25.8 |  |
| 8/24/09 | 25.83 |  |
| 8/24/09 | 25.87 |  |
| 8/24/09 | 25.91 |  |
| 8/24/09 | 25.95 |  |
| 8/24/09 | 26.01 |  |
| 8/24/09 | 26.07 |  |
| 8/24/09 | 26.11 |  |
| 8/24/09 | 26.16 |  |
| 8/24/09 | 26.2 |  |
| 8/24/09 | 26.23 |  |
| 8/24/09 | 26.27 |  |
| 8/24/09 | 26.32 |  |
| 8/24/09 | 26.35 |  |
| 8/24/09 | 26.38 |  |
| 8/24/09 | 26.41 |  |
| 8/24/09 | 26.46 |  |
| 8/24/09 | 26.5 |  |
| 8/24/09 | 26.53 |  |
| 8/23/09 | 26.59 |  |
| 8/23/09 | 26.63 |  |
| 8/23/09 | 26.68 |  |
| 8/23/09 | 26.75 |  |
| 8/23/09 | 26.82 |  |
| 8/23/09 | 26.87 |  |
| 8/23/09 | 26.95 |  |
| 8/23/09 | 27.02 |  |
| 8/23/09 | 27.06 |  |
| 8/23/09 | 27.07 |  |
| 8/23/09 | 27.09 |  |
| 8/23/09 | 27.06 |  |
| 8/23/09 | 27.01 |  |
| 8/23/09 | 26.9 |  |
| 8/23/09 | 26.93 |  |
| 8/23/09 | 26.89 |  |
| 8/23/09 | 26.88 |  |
| 8/23/09 | 26.71 |  |
| 8/23/09 | 26.75 |  |
| 8/23/09 | 26.77 |  |
| 8/23/09 | 26.78 |  |
| 8/23/09 | 26.72 |  |
| 8/23/09 | 26.66 |  |
| 8/23/09 | 26.64 |  |
| 8/23/09 | 26.61 |  |
| 8/23/09 | 26.57 |  |
| 8/23/09 | 26.57 |  |
| 8/23/09 | 26.59 |  |
| 8/23/09 | 26.62 |  |
| 8/23/09 | 26.64 |  |
| 8/23/09 | 26.67 |  |
| 8/23/09 | 26.71 |  |
| 8/23/09 | 26.72 |  |
| 8/23/09 | 26.75 |  |
| 8/23/09 | 26.8 |  |
| 8/23/09 | 26.83 |  |
| 8/23/09 | 26.89 |  |
| 8/23/09 | 26.92 |  |
| 8/23/09 | 26.98 |  |
| 8/23/09 | 27.04 |  |
| 8/23/09 | 27.07 |  |
| 8/23/09 | 27.13 |  |
| 8/23/09 | 27.18 |  |
| 8/23/09 | 27.24 |  |
| 8/23/09 | 27.3 |  |
| 8/23/09 | 27.37 |  |
| 8/23/09 | 27.44 |  |
| 8/23/09 | 27.5 |  |
| 8/22/09 | 27.57 |  |
| 8/22/09 | 27.64 |  |
| 8/22/09 | 27.73 |  |
| 8/22/09 | 27.82 |  |
| 8/22/09 | 27.88 |  |
| 8/22/09 | 27.78 |  |
| 8/22/09 | 27.78 |  |
| 8/22/09 | 27.85 |  |
| 8/22/09 | 27.89 |  |
| 8/22/09 | 27.77 |  |
| 8/22/09 | 27.76 |  |
| 8/22/09 | 27.72 |  |
| 8/22/09 | 27.79 |  |
| 8/22/09 | 27.64 |  |
| 8/22/09 | 27.57 |  |
| 8/22/09 | 27.57 |  |
| 8/22/09 | 27.47 |  |
| 8/22/09 | 27.47 |  |
| 8/22/09 | 27.55 |  |
| 8/22/09 | 27.47 |  |
| 8/22/09 | 27.56 |  |
| 8/22/09 | 27.48 |  |
| 8/22/09 | 27.38 |  |
| 8/22/09 | 27.32 |  |
| 8/22/09 | 27.29 |  |
| 8/22/09 | 27.25 |  |
| 8/22/09 | 27.22 |  |
| 8/22/09 | 27.21 |  |
| 8/22/09 | 27.2 |  |
| 8/22/09 | 27.18 |  |
| 8/22/09 | 27.17 |  |
| 8/22/09 | 27.18 |  |
| 8/22/09 | 27.22 |  |
| 8/22/09 | 27.26 |  |
| 8/22/09 | 27.29 |  |
| 8/22/09 | 27.34 |  |
| 8/22/09 | 27.4 |  |
| 8/22/09 | 27.45 |  |
| 8/22/09 | 27.5 |  |
| 8/22/09 | 27.55 |  |
| 8/22/09 | 27.59 |  |
| 8/22/09 | 27.63 |  |
| 8/22/09 | 27.7 |  |
| 8/22/09 | 27.76 |  |
| 8/22/09 | 27.83 |  |
| 8/22/09 | 27.88 |  |
| 8/22/09 | 27.97 |  |
| 8/22/09 | 28.03 |  |
| 8/21/09 | 28.15 |  |
| 8/21/09 | 28.23 |  |
| 8/21/09 | 28.31 |  |
| 8/21/09 | 28.43 |  |
| 8/21/09 | 28.47 |  |
| 8/21/09 | 28.42 |  |
| 8/21/09 | 28.41 |  |
| 8/21/09 | 28.26 |  |
| 8/21/09 | 28.24 |  |
| 8/21/09 | 28.12 |  |
| 8/21/09 | 28.2 |  |
| 8/21/09 | 28.06 |  |
| 8/21/09 | 27.98 |  |
| 8/21/09 | 28.17 |  |
| 8/21/09 | 27.94 |  |
| 8/21/09 | 28 |  |
| 8/21/09 | 28.03 |  |
| 8/21/09 | 27.85 |  |
| 8/21/09 | 27.7 |  |
| 8/21/09 | 27.68 |  |
| 8/21/09 | 27.7 |  |
| 8/21/09 | 27.7 |  |
| 8/21/09 | 27.58 |  |
| 8/21/09 | 27.58 |  |
| 8/21/09 | 27.56 |  |
| 8/21/09 | 27.55 |  |
| 8/21/09 | 27.54 |  |
| 8/21/09 | 27.54 |  |
| 8/21/09 | 27.56 |  |
| 8/21/09 | 27.58 |  |
| 8/21/09 | 27.61 |  |
| 8/21/09 | 27.64 |  |
| 8/21/09 | 27.67 |  |
| 8/21/09 | 27.7 |  |
| 8/21/09 | 27.73 |  |
| 8/21/09 | 27.76 |  |
| 8/21/09 | 27.82 |  |
| 8/21/09 | 27.84 |  |
| 8/21/09 | 27.9 |  |
| 8/21/09 | 27.93 |  |
| 8/21/09 | 27.97 |  |
| 8/21/09 | 28.02 |  |
| 8/21/09 | 28.08 |  |
| 8/21/09 | 28.13 |  |
| 8/21/09 | 28.2 |  |
| 8/21/09 | 28.27 |  |
| 8/21/09 | 28.26 |  |
| 8/21/09 | 28.11 |  |
| 8/20/09 | 28.13 |  |
| 8/20/09 | 28.28 |  |
| 8/20/09 | 28.25 |  |
| 8/20/09 | 28.11 |  |
| 8/20/09 | 28.24 |  |
| 8/20/09 | 28.26 |  |
| 8/20/09 | 28.24 |  |
| 8/20/09 | 28.13 |  |
| 8/20/09 | 28.18 |  |
| 8/20/09 | 28.23 |  |
| 8/20/09 | 28.05 |  |
| 8/20/09 | 28.06 |  |
| 8/20/09 | 28.27 |  |
| 8/20/09 | 28.29 |  |
| 8/20/09 | 28.03 |  |
| 8/20/09 | 28.08 |  |
| 8/20/09 | 28.06 |  |
| 8/20/09 | 27.92 |  |
| 8/20/09 | 27.78 |  |
| 8/20/09 | 27.8 |  |
| 8/20/09 | 27.84 |  |
| 8/20/09 | 27.82 |  |
| 8/20/09 | 27.73 |  |
| 8/20/09 | 27.71 |  |
| 8/20/09 | 27.68 |  |
| 8/20/09 | 27.64 |  |
| 8/20/09 | 27.65 |  |
| 8/20/09 | 27.65 |  |
| 8/20/09 | 27.66 |  |
| 8/20/09 | 27.67 |  |
| 8/20/09 | 27.66 |  |
| 8/20/09 | 27.66 |  |
| 8/20/09 | 27.68 |  |
| 8/20/09 | 27.7 |  |
| 8/20/09 | 27.73 |  |
| 8/20/09 | 27.78 |  |
| 8/20/09 | 27.82 |  |
| 8/20/09 | 27.86 |  |
| 8/20/09 | 27.9 |  |
| 8/20/09 | 27.92 |  |
| 8/20/09 | 27.95 |  |
| 8/20/09 | 27.99 |  |
| 8/20/09 | 28.03 |  |
| 8/20/09 | 28.06 |  |
| 8/20/09 | 28.11 |  |
| 8/20/09 | 28.15 |  |
| 8/20/09 | 28.2 |  |
| 8/20/09 | 28.24 |  |
| 8/19/09 | 28.29 |  |
| 8/19/09 | 28.32 |  |
| 8/19/09 | 28.38 |  |
| 8/19/09 | 28.42 |  |
| 8/19/09 | 28.48 |  |
| 8/19/09 | 28.52 |  |
| 8/19/09 | 28.56 |  |
| 8/19/09 | 28.6 |  |
| 8/19/09 | 28.66 |  |
| 8/19/09 | 28.64 |  |
| 8/19/09 | 28.61 |  |
| 8/19/09 | 28.59 |  |
| 8/19/09 | 28.53 |  |
| 8/19/09 | 28.54 |  |
| 8/19/09 | 28.51 |  |
| 8/19/09 | 28.5 |  |
| 8/19/09 | 28.48 |  |
| 8/19/09 | 28.54 |  |
| 8/19/09 | 28.53 |  |
| 8/19/09 | 28.52 |  |
| 8/19/09 | 28.5 |  |
| 8/19/09 | 28.52 |  |
| 8/19/09 | 28.51 |  |
| 8/19/09 | 28.45 |  |
| 8/19/09 | 28.4 |  |
| 8/19/09 | 28.35 |  |
| 8/19/09 | 28.32 |  |
| 8/19/09 | 28.35 |  |
| 8/19/09 | 28.3 |  |
| 8/19/09 | 28.31 |  |
| 8/19/09 | 28.31 |  |
| 8/19/09 | 28.3 |  |
| 8/19/09 | 28.32 |  |
| 8/19/09 | 28.36 |  |
| 8/19/09 | 28.39 |  |
| 8/19/09 | 28.43 |  |
| 8/19/09 | 28.48 |  |
| 8/19/09 | 28.51 |  |
| 8/19/09 | 28.56 |  |
| 8/19/09 | 28.6 |  |
| 8/19/09 | 28.63 |  |
| 8/19/09 | 28.68 |  |
| 8/19/09 | 28.7 |  |
| 8/19/09 | 28.76 |  |
| 8/19/09 | 28.81 |  |
| 8/19/09 | 28.86 |  |
| 8/19/09 | 28.91 |  |
| 8/19/09 | 28.97 |  |
| 8/18/09 | 29.03 |  |
| 8/18/09 | 29.09 |  |
| 8/18/09 | 29.1 |  |
| 8/18/09 | 29.13 |  |
| 8/18/09 | 29.14 |  |
| 8/18/09 | 29.14 |  |
| 8/18/09 | 29.03 |  |
| 8/18/09 | 28.96 |  |
| 8/18/09 | 28.97 |  |
| 8/18/09 | 29.09 |  |
| 8/18/09 | 29.04 |  |
| 8/18/09 | 29.18 |  |
| 8/18/09 | 29.04 |  |
| 8/18/09 | 28.88 |  |
| 8/18/09 | 29.02 |  |
| 8/18/09 | 28.94 |  |
| 8/18/09 | 28.87 |  |
| 8/18/09 | 28.76 |  |
| 8/18/09 | 28.61 |  |
| 8/18/09 | 28.57 |  |
| 8/18/09 | 28.55 |  |
| 8/18/09 | 28.6 |  |
| 8/18/09 | 28.51 |  |
| 8/18/09 | 28.47 |  |
| 8/18/09 | 28.39 |  |
| 8/18/09 | 28.28 |  |
| 8/18/09 | 28.33 |  |
| 8/18/09 | 28.33 |  |
| 8/18/09 | 28.29 |  |
| 8/18/09 | 28.28 |  |
| 8/18/09 | 28.27 |  |
| 8/18/09 | 28.32 |  |
| 8/18/09 | 28.37 |  |
| 8/18/09 | 28.4 |  |
| 8/18/09 | 28.48 |  |
| 8/18/09 | 28.54 |  |
| 8/18/09 | 28.6 |  |
| 8/18/09 | 28.66 |  |
| 8/18/09 | 28.72 |  |
| 8/18/09 | 28.78 |  |
| 8/18/09 | 28.84 |  |
| 8/18/09 | 28.9 |  |
| 8/18/09 | 28.99 |  |
| 8/18/09 | 29.04 |  |
| 8/18/09 | 29.13 |  |
| 8/18/09 | 29.2 |  |
| 8/18/09 | 29.24 |  |
| 8/18/09 | 29.24 |  |
| 8/17/09 | 29.27 |  |
| 8/17/09 | 29.34 |  |
| 8/17/09 | 29.4 |  |
| 8/17/09 | 29.46 |  |
| 8/17/09 | 29.31 |  |
| 8/17/09 | 29.1 |  |
| 8/17/09 | 29.19 |  |
| 8/17/09 | 28.96 |  |
| 8/17/09 | 29.05 |  |
| 8/17/09 | 28.91 |  |
| 8/17/09 | 28.85 |  |
| 8/17/09 | 29.03 |  |
| 8/17/09 | 29.14 |  |
| 8/17/09 | 29.12 |  |
| 8/17/09 | 29.08 |  |
| 8/17/09 | 29.04 |  |
| 8/17/09 | 28.98 |  |
| 8/17/09 | 28.95 |  |
| 8/17/09 | 28.87 |  |
| 8/17/09 | 28.87 |  |
| 8/17/09 | 28.86 |  |
| 8/17/09 | 28.8 |  |
| 8/17/09 | 28.75 |  |
| 8/17/09 | 28.67 |  |
| 8/17/09 | 28.51 |  |
| 8/17/09 | 28.42 |  |
| 8/17/09 | 28.39 |  |
| 8/17/09 | 28.36 |  |
| 8/17/09 | 28.34 |  |
| 8/17/09 | 28.3 |  |
| 8/17/09 | 28.31 |  |
| 8/17/09 | 28.35 |  |
| 8/17/09 | 28.4 |  |
| 8/17/09 | 28.46 |  |
| 8/17/09 | 28.53 |  |
| 8/17/09 | 28.62 |  |
| 8/17/09 | 28.69 |  |
| 8/17/09 | 28.77 |  |
| 8/17/09 | 28.84 |  |
| 8/17/09 | 28.88 |  |
| 8/17/09 | 28.9 |  |
| 8/17/09 | 28.85 |  |
| 8/17/09 | 28.84 |  |
| 8/17/09 | 28.81 |  |
| 8/17/09 | 28.79 |  |
| 8/17/09 | 28.79 |  |
| 8/17/09 | 28.84 |  |
| 8/17/09 | 28.75 |  |
| 8/16/09 | 28.77 |  |
| 8/16/09 | 28.76 |  |
| 8/16/09 | 28.86 |  |
| 8/16/09 | 28.88 |  |
| 8/16/09 | 28.87 |  |
| 8/16/09 | 28.9 |  |
| 8/16/09 | 28.87 |  |
| 8/16/09 | 28.76 |  |
| 8/16/09 | 28.74 |  |
| 8/16/09 | 28.7 |  |
| 8/16/09 | 28.72 |  |
| 8/16/09 | 28.87 |  |
| 8/16/09 | 28.93 |  |
| 8/16/09 | 28.88 |  |
| 8/16/09 | 28.64 |  |
| 8/16/09 | 28.78 |  |
| 8/16/09 | 28.79 |  |
| 8/16/09 | 28.6 |  |
| 8/16/09 | 28.55 |  |
| 8/16/09 | 28.38 |  |
| 8/16/09 | 28.45 |  |
| 8/16/09 | 28.36 |  |
| 8/16/09 | 28.29 |  |
| 8/16/09 | 28.28 |  |
| 8/16/09 | 28.14 |  |
| 8/16/09 | 28.04 |  |
| 8/16/09 | 28.01 |  |
| 8/16/09 | 27.97 |  |
| 8/16/09 | 27.95 |  |
| 8/16/09 | 27.91 |  |
| 8/16/09 | 27.93 |  |
| 8/16/09 | 27.96 |  |
| 8/16/09 | 28.01 |  |
| 8/16/09 | 28.07 |  |
| 8/16/09 | 28.14 |  |
| 8/16/09 | 28.2 |  |
| 8/16/09 | 28.29 |  |
| 8/16/09 | 28.35 |  |
| 8/16/09 | 28.36 |  |
| 8/16/09 | 28.34 |  |
| 8/16/09 | 28.3 |  |
| 8/16/09 | 28.33 |  |
| 8/16/09 | 28.32 |  |
| 8/16/09 | 28.33 |  |
| 8/16/09 | 28.33 |  |
| 8/16/09 | 28.32 |  |
| 8/16/09 | 28.32 |  |
| 8/16/09 | 28.34 |  |
| 8/15/09 | 28.34 |  |
| 8/15/09 | 28.29 |  |
| 8/15/09 | 28.36 |  |
| 8/15/09 | 28.36 |  |
| 8/15/09 | 28.43 |  |
| 8/15/09 | 28.37 |  |
| 8/15/09 | 28.38 |  |
| 8/15/09 | 28.42 |  |
| 8/15/09 | 28.39 |  |
| 8/15/09 | 28.32 |  |
| 8/15/09 | 28.38 |  |
| 8/15/09 | 28.36 |  |
| 8/15/09 | 28.35 |  |
| 8/15/09 | 28.41 |  |
| 8/15/09 | 28.4 |  |
| 8/15/09 | 28.43 |  |
| 8/15/09 | 28.25 |  |
| 8/15/09 | 28.16 |  |
| 8/15/09 | 28.15 |  |
| 8/15/09 | 27.98 |  |
| 8/15/09 | 27.94 |  |
| 8/15/09 | 27.88 |  |
| 8/15/09 | 27.82 |  |
| 8/15/09 | 27.8 |  |
| 8/15/09 | 27.74 |  |
| 8/15/09 | 27.69 |  |
| 8/15/09 | 27.69 |  |
| 8/15/09 | 27.66 |  |
| 8/15/09 | 27.62 |  |
| 8/15/09 | 27.59 |  |
| 8/15/09 | 27.57 |  |
| 8/15/09 | 27.58 |  |
| 8/15/09 | 27.64 |  |
| 8/15/09 | 27.71 |  |
| 8/15/09 | 27.79 |  |
| 8/15/09 | 27.89 |  |
| 8/15/09 | 27.97 |  |
| 8/15/09 | 28.03 |  |
| 8/15/09 | 28.08 |  |
| 8/15/09 | 28.08 |  |
| 8/15/09 | 27.97 |  |
| 8/15/09 | 27.86 |  |
| 8/15/09 | 27.93 |  |
| 8/15/09 | 27.95 |  |
| 8/15/09 | 27.91 |  |
| 8/15/09 | 27.9 |  |
| 8/15/09 | 27.91 |  |
| 8/15/09 | 27.91 |  |
| 8/14/09 | 27.9 |  |
| 8/14/09 | 27.85 |  |
| 8/14/09 | 27.91 |  |
| 8/14/09 | 28.03 |  |
| 8/14/09 | 28.05 |  |
| 8/14/09 | 27.95 |  |
| 8/14/09 | 27.93 |  |
| 8/14/09 | 27.89 |  |
| 8/14/09 | 27.86 |  |
| 8/14/09 | 27.76 |  |
| 8/14/09 | 27.71 |  |
| 8/14/09 | 27.73 |  |
| 8/14/09 | 27.69 |  |
| 8/14/09 | 27.7 |  |
| 8/14/09 | 27.85 |  |
| 8/14/09 | 27.77 |  |
| 8/14/09 | 27.69 |  |
| 8/14/09 | 27.61 |  |
| 8/14/09 | 27.62 |  |
| 8/14/09 | 27.52 |  |
| 8/14/09 | 27.52 |  |
| 8/14/09 | 27.26 |  |
| 8/14/09 | 27.25 |  |
| 8/14/09 | 27.24 |  |
| 8/14/09 | 27.12 |  |
| 8/14/09 | 27.1 |  |
| 8/14/09 | 27.03 |  |
| 8/14/09 | 26.99 |  |
| 8/14/09 | 26.96 |  |
| 8/14/09 | 26.94 |  |
| 8/14/09 | 26.92 |  |
| 8/14/09 | 26.96 |  |
| 8/14/09 | 27 |  |
| 8/14/09 | 27.06 |  |
| 8/14/09 | 27.13 |  |
| 8/14/09 | 27.22 |  |
| 8/14/09 | 27.33 |  |
| 8/14/09 | 27.41 |  |
| 8/14/09 | 27.47 |  |
| 8/14/09 | 27.53 |  |
| 8/14/09 | 27.52 |  |
| 8/14/09 | 27.29 |  |
| 8/14/09 | 27.54 |  |
| 8/14/09 | 27.27 |  |
| 8/14/09 | 27.25 |  |
| 8/14/09 | 27.2 |  |
| 8/14/09 | 27.24 |  |
| 8/14/09 | 27.29 |  |
| 8/13/09 | 27.28 |  |
| 8/13/09 | 27.24 |  |
| 8/13/09 | 27.28 |  |
| 8/13/09 | 27.27 |  |
| 8/13/09 | 27.24 |  |
| 8/13/09 | 27.21 |  |
| 8/13/09 | 27.33 |  |
| 8/13/09 | 27.45 |  |
| 8/13/09 | 27.39 |  |
| 8/13/09 | 27.27 |  |
| 8/13/09 | 27.27 |  |
| 8/13/09 | 27.17 |  |
| 8/13/09 | 27.1 |  |
| 8/13/09 | 27.03 |  |
| 8/13/09 | 26.88 |  |
| 8/13/09 | 26.7 |  |
| 8/13/09 | 26.85 |  |
| 8/13/09 | 26.93 |  |
| 8/13/09 | 26.94 |  |
| 8/13/09 | 26.99 |  |
| 8/13/09 | 26.81 |  |
| 8/13/09 | 26.72 |  |
| 8/13/09 | 26.8 |  |
| 8/13/09 | 26.49 |  |
| 8/13/09 | 26.33 |  |
| 8/13/09 | 26.29 |  |
| 8/13/09 | 26.2 |  |
| 8/13/09 | 26.14 |  |
| 8/13/09 | 26.11 |  |
| 8/13/09 | 26.11 |  |
| 8/13/09 | 26.12 |  |
| 8/13/09 | 26.14 |  |
| 8/13/09 | 26.16 |  |
| 8/13/09 | 26.2 |  |
| 8/13/09 | 26.25 |  |
| 8/13/09 | 26.28 |  |
| 8/13/09 | 26.34 |  |
| 8/13/09 | 26.37 |  |
| 8/13/09 | 26.42 |  |
| 8/13/09 | 26.46 |  |
| 8/13/09 | 26.52 |  |
| 8/13/09 | 26.55 |  |
| 8/13/09 | 26.6 |  |
| 8/13/09 | 26.64 |  |
| 8/13/09 | 26.69 |  |
| 8/13/09 | 26.74 |  |
| 8/13/09 | 26.8 |  |
| 8/13/09 | 26.89 |  |
| 8/12/09 | 26.97 |  |
| 8/12/09 | 27.04 |  |
| 8/12/09 | 27.11 |  |
| 8/12/09 | 27.14 |  |
| 8/12/09 | 27.1 |  |
| 8/12/09 | 27.03 |  |
| 8/12/09 | 27.03 |  |
| 8/12/09 | 26.94 |  |
| 8/12/09 | 26.93 |  |
| 8/12/09 | 26.9 |  |
| 8/12/09 | 26.86 |  |
| 8/12/09 | 26.89 |  |
| 8/12/09 | 26.94 |  |
| 8/12/09 | 26.98 |  |
| 8/12/09 | 26.87 |  |
| 8/12/09 | 26.8 |  |
| 8/12/09 | 26.89 |  |
| 8/12/09 | 26.91 |  |
| 8/12/09 | 26.7 |  |
| 8/12/09 | 26.66 |  |
| 8/12/09 | 26.62 |  |
| 8/12/09 | 26.56 |  |
| 8/12/09 | 26.55 |  |
| 8/12/09 | 26.54 |  |
| 8/12/09 | 26.53 |  |
| 8/12/09 | 26.53 |  |
| 8/12/09 | 26.53 |  |
| 8/12/09 | 26.52 |  |
| 8/12/09 | 26.54 |  |
| 8/12/09 | 26.55 |  |
| 8/12/09 | 26.56 |  |
| 8/12/09 | 26.58 |  |
| 8/12/09 | 26.6 |  |
| 8/12/09 | 26.64 |  |
| 8/12/09 | 26.67 |  |
| 8/12/09 | 26.72 |  |
| 8/12/09 | 26.76 |  |
| 8/12/09 | 26.81 |  |
| 8/12/09 | 26.86 |  |
| 8/12/09 | 26.91 |  |
| 8/12/09 | 26.93 |  |
| 8/12/09 | 27 |  |
| 8/12/09 | 27.05 |  |
| 8/12/09 | 27.09 |  |
| 8/12/09 | 27.13 |  |
| 8/12/09 | 27.19 |  |
| 8/12/09 | 27.24 |  |
| 8/12/09 | 27.31 |  |
| 8/11/09 | 27.34 |  |
| 8/11/09 | 27.4 |  |
| 8/11/09 | 27.45 |  |
| 8/11/09 | 27.48 |  |
| 8/11/09 | 27.49 |  |
| 8/11/09 | 27.53 |  |
| 8/11/09 | 27.58 |  |
| 8/11/09 | 27.65 |  |
| 8/11/09 | 27.65 |  |
| 8/11/09 | 27.61 |  |
| 8/11/09 | 27.46 |  |
| 8/11/09 | 27.38 |  |
| 8/11/09 | 27.37 |  |
| 8/11/09 | 27.34 |  |
| 8/11/09 | 27.16 |  |
| 8/11/09 | 27.13 |  |
| 8/11/09 | 27.34 |  |
| 8/11/09 | 27.33 |  |
| 8/11/09 | 27.26 |  |
| 8/11/09 | 27.23 |  |
| 8/11/09 | 27.12 |  |
| 8/11/09 | 27.03 |  |
| 8/11/09 | 26.99 |  |
| 8/11/09 | 26.99 |  |
| 8/11/09 | 26.94 |  |
| 8/11/09 | 26.99 |  |
| 8/11/09 | 27.01 |  |
| 8/11/09 | 26.98 |  |
| 8/11/09 | 26.96 |  |
| 8/11/09 | 26.96 |  |
| 8/11/09 | 26.97 |  |
| 8/11/09 | 26.98 |  |
| 8/11/09 | 27.01 |  |
| 8/11/09 | 27.09 |  |
| 8/11/09 | 27.13 |  |
| 8/11/09 | 27.19 |  |
| 8/11/09 | 27.24 |  |
| 8/11/09 | 27.29 |  |
| 8/11/09 | 27.34 |  |
| 8/11/09 | 27.4 |  |
| 8/11/09 | 27.46 |  |
| 8/11/09 | 27.53 |  |
| 8/11/09 | 27.6 |  |
| 8/11/09 | 27.65 |  |
| 8/11/09 | 27.52 |  |
| 8/11/09 | 27.79 |  |
| 8/11/09 | 27.76 |  |
| 8/11/09 | 27.82 |  |
| 8/10/09 | 27.85 |  |
| 8/10/09 | 27.9 |  |
| 8/10/09 | 28.05 |  |
| 8/10/09 | 28.19 |  |
| 8/10/09 | 27.93 |  |
| 8/10/09 | 27.96 |  |
| 8/10/09 | 27.78 |  |
| 8/10/09 | 27.81 |  |
| 8/10/09 | 27.3 |  |
| 8/10/09 | 27.4 |  |
| 8/10/09 | 27.29 |  |
| 8/10/09 | 27.62 |  |
| 8/10/09 | 27.85 |  |
| 8/10/09 | 27.55 |  |
| 8/10/09 | 27.45 |  |
| 8/10/09 | 27.4 |  |
| 8/10/09 | 27.21 |  |
| 8/10/09 | 26.93 |  |
| 8/10/09 | 26.93 |  |
| 8/10/09 | 26.85 |  |
| 8/10/09 | 26.78 |  |
| 8/10/09 | 26.72 |  |
| 8/10/09 | 26.65 |  |
| 8/10/09 | 26.63 |  |
| 8/10/09 | 26.47 |  |
| 8/10/09 | 26.42 |  |
| 8/10/09 | 26.37 |  |
| 8/10/09 | 26.36 |  |
| 8/10/09 | 26.39 |  |
| 8/10/09 | 26.4 |  |
| 8/10/09 | 26.39 |  |
| 8/10/09 | 26.41 |  |
| 8/10/09 | 26.44 |  |
| 8/10/09 | 26.48 |  |
| 8/10/09 | 26.52 |  |
| 8/10/09 | 26.56 |  |
| 8/10/09 | 26.6 |  |
| 8/10/09 | 26.65 |  |
| 8/10/09 | 26.67 |  |
| 8/10/09 | 26.74 |  |
| 8/10/09 | 26.78 |  |
| 8/10/09 | 26.82 |  |
| 8/10/09 | 26.89 |  |
| 8/10/09 | 26.95 |  |
| 8/10/09 | 27.02 |  |
| 8/10/09 | 27.02 |  |
| 8/10/09 | 27.05 |  |
| 8/10/09 | 27.07 |  |
| 8/9/09 | 27.08 |  |
| 8/9/09 | 27.04 |  |
| 8/9/09 | 27.08 |  |
| 8/9/09 | 27.13 |  |
| 8/9/09 | 27.09 |  |
| 8/9/09 | 27.06 |  |
| 8/9/09 | 26.86 |  |
| 8/9/09 | 26.66 |  |
| 8/9/09 | 26.69 |  |
| 8/9/09 | 26.6 |  |
| 8/9/09 | 26.17 |  |
| 8/9/09 | 26.22 |  |
| 8/9/09 | 26.31 |  |
| 8/9/09 | 26.16 |  |
| 8/9/09 | 26.13 |  |
| 8/9/09 | 26.13 |  |
| 8/9/09 | 25.74 |  |
| 8/9/09 | 25.57 |  |
| 8/9/09 | 25.66 |  |
| 8/9/09 | 25.65 |  |
| 8/9/09 | 25.68 |  |
| 8/9/09 | 25.64 |  |
| 8/9/09 | 25.64 |  |
| 8/9/09 | 25.51 |  |
| 8/9/09 | 25.29 |  |
| 8/9/09 | 25.28 |  |
| 8/9/09 | 25.28 |  |
| 8/9/09 | 25.3 |  |
| 8/9/09 | 25.28 |  |
| 8/9/09 | 25.28 |  |
| 8/9/09 | 25.27 |  |
| 8/9/09 | 25.26 |  |
| 8/9/09 | 25.27 |  |
| 8/9/09 | 25.28 |  |
| 8/9/09 | 25.31 |  |
| 8/9/09 | 25.32 |  |
| 8/9/09 | 25.35 |  |
| 8/9/09 | 25.38 |  |
| 8/9/09 | 25.41 |  |
| 8/9/09 | 25.49 |  |
| 8/9/09 | 25.54 |  |
| 8/9/09 | 25.59 |  |
| 8/9/09 | 25.67 |  |
| 8/9/09 | 25.72 |  |
| 8/9/09 | 25.72 |  |
| 8/9/09 | 25.64 |  |
| 8/9/09 | 25.67 |  |
| 8/9/09 | 25.66 |  |
| 8/8/09 | 25.64 |  |
| 8/8/09 | 25.63 |  |
| 8/8/09 | 25.59 |  |
| 8/8/09 | 25.6 |  |
| 8/8/09 | 25.69 |  |
| 8/8/09 | 25.71 |  |
| 8/8/09 | 25.74 |  |
| 8/8/09 | 25.78 |  |
| 8/8/09 | 25.78 |  |
| 8/8/09 | 25.99 |  |
| 8/8/09 | 25.99 |  |
| 8/8/09 | 25.81 |  |
| 8/8/09 | 25.74 |  |
| 8/8/09 | 25.67 |  |
| 8/8/09 | 25.64 |  |
| 8/8/09 | 25.64 |  |
| 8/8/09 | 25.61 |  |
| 8/8/09 | 25.51 |  |
| 8/8/09 | 25.43 |  |
| 8/8/09 | 25.48 |  |
| 8/8/09 | 25.5 |  |
| 8/8/09 | 25.55 |  |
| 8/8/09 | 25.42 |  |
| 8/8/09 | 25.36 |  |
| 8/8/09 | 25.29 |  |
| 8/8/09 | 25.19 |  |
| 8/8/09 | 25.13 |  |
| 8/8/09 | 25.11 |  |
| 8/8/09 | 25.09 |  |
| 8/8/09 | 25.08 |  |
| 8/8/09 | 25.08 |  |
| 8/8/09 | 25.1 |  |
| 8/8/09 | 25.13 |  |
| 8/8/09 | 25.18 |  |
| 8/8/09 | 25.24 |  |
| 8/8/09 | 25.28 |  |
| 8/8/09 | 25.34 |  |
| 8/8/09 | 25.41 |  |
| 8/8/09 | 25.46 |  |
| 8/8/09 | 25.53 |  |
| 8/8/09 | 25.59 |  |
| 8/8/09 | 25.66 |  |
| 8/8/09 | 25.74 |  |
| 8/8/09 | 25.82 |  |
| 8/8/09 | 25.89 |  |
| 8/8/09 | 25.91 |  |
| 8/8/09 | 25.77 |  |
| 8/8/09 | 25.79 |  |
| 8/7/09 | 25.78 |  |
| 8/7/09 | 25.76 |  |
| 8/7/09 | 25.72 |  |
| 8/7/09 | 25.69 |  |
| 8/7/09 | 25.84 |  |
| 8/7/09 | 25.93 |  |
| 8/7/09 | 26 |  |
| 8/7/09 | 26.03 |  |
| 8/7/09 | 26.09 |  |
| 8/7/09 | 25.98 |  |
| 8/7/09 | 25.92 |  |
| 8/7/09 | 25.79 |  |
| 8/7/09 | 25.61 |  |
| 8/7/09 | 25.58 |  |
| 8/7/09 | 25.47 |  |
| 8/7/09 | 25.44 |  |
| 8/7/09 | 25.31 |  |
| 8/7/09 | 25.23 |  |
| 8/7/09 | 25.17 |  |
| 8/7/09 | 25.12 |  |
| 8/7/09 | 25.04 |  |
| 8/7/09 | 25.14 |  |
| 8/7/09 | 25.05 |  |
| 8/7/09 | 25.07 |  |
| 8/7/09 | 24.8 |  |
| 8/7/09 | 24.8 |  |
| 8/7/09 | 24.79 |  |
| 8/7/09 | 24.8 |  |
| 8/7/09 | 24.81 |  |
| 8/7/09 | 24.83 |  |
| 8/7/09 | 24.85 |  |
| 8/7/09 | 24.88 |  |
| 8/7/09 | 24.93 |  |
| 8/7/09 | 24.98 |  |
| 8/7/09 | 25.03 |  |
| 8/7/09 | 25.08 |  |
| 8/7/09 | 25.14 |  |
| 8/7/09 | 25.21 |  |
| 8/7/09 | 25.25 |  |
| 8/7/09 | 25.3 |  |
| 8/7/09 | 25.36 |  |
| 8/7/09 | 25.43 |  |
| 8/7/09 | 25.51 |  |
| 8/7/09 | 25.58 |  |
| 8/7/09 | 25.68 |  |
| 8/7/09 | 25.78 |  |
| 8/6/09 | 25.89 |  |
| 8/6/09 | 25.98 |  |
| 8/6/09 | 25.99 |  |
| 8/6/09 | 26.02 |  |
| 8/6/09 | 25.9 |  |
| 8/6/09 | 25.83 |  |
| 8/6/09 | 25.75 |  |
| 8/6/09 | 25.75 |  |
| 8/6/09 | 25.83 |  |
| 8/6/09 | 25.97 |  |
| 8/6/09 | 25.78 |  |
| 8/6/09 | 25.84 |  |
| 8/6/09 | 25.69 |  |
| 8/6/09 | 25.59 |  |
| 8/6/09 | 25.62 |  |
| 8/6/09 | 25.62 |  |
| 8/6/09 | 25.69 |  |
| 8/6/09 | 25.65 |  |
| 8/6/09 | 25.38 |  |
| 8/6/09 | 25.37 |  |
| 8/6/09 | 25.4 |  |
| 8/6/09 | 25.36 |  |
| 8/6/09 | 25.39 |  |
| 8/6/09 | 25.35 |  |
| 8/6/09 | 25.19 |  |
| 8/6/09 | 25.07 |  |
| 8/6/09 | 24.99 |  |
| 8/6/09 | 24.97 |  |
| 8/6/09 | 24.96 |  |
| 8/6/09 | 24.99 |  |
| 8/6/09 | 25 |  |
| 8/6/09 | 25.02 |  |
| 8/6/09 | 25.06 |  |
| 8/6/09 | 25.1 |  |
| 8/6/09 | 25.13 |  |
| 8/6/09 | 25.18 |  |
| 8/6/09 | 25.22 |  |
| 8/6/09 | 25.27 |  |
| 8/6/09 | 25.33 |  |
| 8/6/09 | 25.39 |  |
| 8/6/09 | 25.45 |  |
| 8/6/09 | 25.51 |  |
| 8/6/09 | 25.59 |  |
| 8/6/09 | 25.64 |  |
| 8/6/09 | 25.71 |  |
| 8/6/09 | 25.78 |  |
| 8/6/09 | 25.86 |  |
| 8/6/09 | 25.94 |  |
| 8/5/09 | 26.01 |  |
| 8/5/09 | 26.07 |  |
| 8/5/09 | 26.12 |  |
| 8/5/09 | 26.17 |  |
| 8/5/09 | 26.23 |  |
| 8/5/09 | 26.16 |  |
| 8/5/09 | 26.16 |  |
| 8/5/09 | 26.12 |  |
| 8/5/09 | 26.16 |  |
| 8/5/09 | 26.1 |  |
| 8/5/09 | 26.06 |  |
| 8/5/09 | 26.09 |  |
| 8/5/09 | 26.03 |  |
| 8/5/09 | 26.01 |  |
| 8/5/09 | 26.11 |  |
| 8/5/09 | 26 |  |
| 8/5/09 | 25.95 |  |
| 8/5/09 | 25.92 |  |
| 8/5/09 | 25.87 |  |
| 8/5/09 | 25.82 |  |
| 8/5/09 | 25.79 |  |
| 8/5/09 | 25.79 |  |
| 8/5/09 | 25.77 |  |
| 8/5/09 | 25.78 |  |
| 8/5/09 | 25.78 |  |
| 8/5/09 | 25.78 |  |
| 8/5/09 | 25.77 |  |
| 8/5/09 | 25.77 |  |
| 8/5/09 | 25.77 |  |
| 8/5/09 | 25.78 |  |
| 8/5/09 | 25.81 |  |
| 8/5/09 | 25.84 |  |
| 8/5/09 | 25.87 |  |
| 8/5/09 | 25.9 |  |
| 8/5/09 | 25.94 |  |
| 8/5/09 | 25.98 |  |
| 8/5/09 | 26.04 |  |
| 8/5/09 | 26.1 |  |
| 8/5/09 | 26.14 |  |
| 8/5/09 | 26.19 |  |
| 8/5/09 | 26.2 |  |
| 8/5/09 | 26.22 |  |
| 8/5/09 | 26.27 |  |
| 8/5/09 | 26.26 |  |
| 8/5/09 | 26.24 |  |
| 8/5/09 | 26.45 |  |
| 8/5/09 | 26.63 |  |
| 8/5/09 | 26.69 |  |
| 8/4/09 | 26.71 |  |
| 8/4/09 | 26.72 |  |
| 8/4/09 | 26.69 |  |
| 8/4/09 | 26.6 |  |
| 8/4/09 | 26.65 |  |
| 8/4/09 | 26.62 |  |
| 8/4/09 | 26.56 |  |
| 8/4/09 | 26.59 |  |
| 8/4/09 | 26.52 |  |
| 8/4/09 | 26.5 |  |
| 8/4/09 | 26.53 |  |
| 8/4/09 | 26.58 |  |
| 8/4/09 | 26.6 |  |
| 8/4/09 | 26.56 |  |
| 8/4/09 | 26.44 |  |
| 8/4/09 | 26.35 |  |
| 8/4/09 | 26.15 |  |
| 8/4/09 | 26.34 |  |
| 8/4/09 | 26.17 |  |
| 8/4/09 | 26.18 |  |
| 8/4/09 | 26 |  |
| 8/4/09 | 25.86 |  |
| 8/4/09 | 25.78 |  |
| 8/4/09 | 25.82 |  |
| 8/4/09 | 25.78 |  |
| 8/4/09 | 25.73 |  |
| 8/4/09 | 25.7 |  |
| 8/4/09 | 25.7 |  |
| 8/4/09 | 25.68 |  |
| 8/4/09 | 25.64 |  |
| 8/4/09 | 25.63 |  |
| 8/4/09 | 25.64 |  |
| 8/4/09 | 25.65 |  |
| 8/4/09 | 25.69 |  |
| 8/4/09 | 25.75 |  |
| 8/4/09 | 25.81 |  |
| 8/4/09 | 25.87 |  |
| 8/4/09 | 25.95 |  |
| 8/4/09 | 26.01 |  |
| 8/4/09 | 26.1 |  |
| 8/4/09 | 26.18 |  |
| 8/4/09 | 26.26 |  |
| 8/4/09 | 26.35 |  |
| 8/4/09 | 26.43 |  |
| 8/4/09 | 26.48 |  |
| 8/4/09 | 26.51 |  |
| 8/4/09 | 26.47 |  |
| 8/4/09 | 26.33 |  |
| 8/3/09 | 26.29 |  |
| 8/3/09 | 26.26 |  |
| 8/3/09 | 26.21 |  |
| 8/3/09 | 26.26 |  |
| 8/3/09 | 26.33 |  |
| 8/3/09 | 26.37 |  |
| 8/3/09 | 26.46 |  |
| 8/3/09 | 26.54 |  |
| 8/3/09 | 26.58 |  |
| 8/3/09 | 26.48 |  |
| 8/3/09 | 26.31 |  |
| 8/3/09 | 26.23 |  |
| 8/3/09 | 26.31 |  |
| 8/3/09 | 26.29 |  |
| 8/3/09 | 26.09 |  |
| 8/3/09 | 25.91 |  |
| 8/3/09 | 25.98 |  |
| 8/3/09 | 25.78 |  |
| 8/3/09 | 25.72 |  |
| 8/3/09 | 25.58 |  |
| 8/3/09 | 25.45 |  |
| 8/3/09 | 25.34 |  |
| 8/3/09 | 25.4 |  |
| 8/3/09 | 25.37 |  |
| 8/3/09 | 25.36 |  |
| 8/3/09 | 25.2 |  |
| 8/3/09 | 25.16 |  |
| 8/3/09 | 25.14 |  |
| 8/3/09 | 25.1 |  |
| 8/3/09 | 25.09 |  |
| 8/3/09 | 25.09 |  |
| 8/3/09 | 25.11 |  |
| 8/3/09 | 25.14 |  |
| 8/3/09 | 25.17 |  |
| 8/3/09 | 25.21 |  |
| 8/3/09 | 25.26 |  |
| 8/3/09 | 25.31 |  |
| 8/3/09 | 25.35 |  |
| 8/3/09 | 25.39 |  |
| 8/3/09 | 25.43 |  |
| 8/3/09 | 25.48 |  |
| 8/3/09 | 25.52 |  |
| 8/3/09 | 25.56 |  |
| 8/3/09 | 25.6 |  |
| 8/3/09 | 25.65 |  |
| 8/3/09 | 25.69 |  |
| 8/3/09 | 25.74 |  |
| 8/3/09 | 25.79 |  |
| 8/2/09 | 25.85 |  |
| 8/2/09 | 25.93 |  |
| 8/2/09 | 26.01 |  |
| 8/2/09 | 26.09 |  |
| 8/2/09 | 26.14 |  |
| 8/2/09 | 26.12 |  |
| 8/2/09 | 26.11 |  |
| 8/2/09 | 26.07 |  |
| 8/2/09 | 26.09 |  |
| 8/2/09 | 26.05 |  |
| 8/2/09 | 25.98 |  |
| 8/2/09 | 25.94 |  |
| 8/2/09 | 25.87 |  |
| 8/2/09 | 25.81 |  |
| 8/2/09 | 25.73 |  |
| 8/2/09 | 25.83 |  |
| 8/2/09 | 25.78 |  |
| 8/2/09 | 25.74 |  |
| 8/2/09 | 25.74 |  |
| 8/2/09 | 25.78 |  |
| 8/2/09 | 25.8 |  |
| 8/2/09 | 25.79 |  |
| 8/2/09 | 25.74 |  |
| 8/2/09 | 25.67 |  |
| 8/2/09 | 25.66 |  |
| 8/2/09 | 25.66 |  |
| 8/2/09 | 25.64 |  |
| 8/2/09 | 25.64 |  |
| 8/2/09 | 25.66 |  |
| 8/2/09 | 25.71 |  |
| 8/2/09 | 25.75 |  |
| 8/2/09 | 25.78 |  |
| 8/2/09 | 25.83 |  |
| 8/2/09 | 25.87 |  |
| 8/2/09 | 25.92 |  |
| 8/2/09 | 25.97 |  |
| 8/2/09 | 26.04 |  |
| 8/2/09 | 26.09 |  |
| 8/2/09 | 26.08 |  |
| 8/2/09 | 26.02 |  |
| 8/2/09 | 25.98 |  |
| 8/2/09 | 25.92 |  |
| 8/2/09 | 25.97 |  |
| 8/2/09 | 25.98 |  |
| 8/2/09 | 26 |  |
| 8/2/09 | 26.04 |  |
| 8/2/09 | 26.06 |  |
| 8/2/09 | 26.06 |  |
| 8/1/09 | 26.08 |  |
| 8/1/09 | 26.03 |  |
| 8/1/09 | 25.98 |  |
| 8/1/09 | 26.03 |  |
| 8/1/09 | 25.97 |  |
| 8/1/09 | 25.97 |  |
| 8/1/09 | 25.93 |  |
| 8/1/09 | 26.03 |  |
| 8/1/09 | 26 |  |
| 8/1/09 | 26.03 |  |
| 8/1/09 | 26 |  |
| 8/1/09 | 26.08 |  |
| 8/1/09 | 26.18 |  |
| 8/1/09 | 26.31 |  |
| 8/1/09 | 26.09 |  |
| 8/1/09 | 25.95 |  |
| 8/1/09 | 25.79 |  |
| 8/1/09 | 25.72 |  |
| 8/1/09 | 25.55 |  |
| 8/1/09 | 25.6 |  |
| 8/1/09 | 25.48 |  |
| 8/1/09 | 25.48 |  |
| 8/1/09 | 25.47 |  |
| 8/1/09 | 25.37 |  |
| 8/1/09 | 25.3 |  |
| 8/1/09 | 25.23 |  |
| 8/1/09 | 25.19 |  |
| 8/1/09 | 25.13 |  |
| 8/1/09 | 25.12 |  |
| 8/1/09 | 25.11 |  |
| 8/1/09 | 25.12 |  |
| 8/1/09 | 25.13 |  |
| 8/1/09 | 25.15 |  |
| 8/1/09 | 25.18 |  |
| 8/1/09 | 25.2 |  |
| 8/1/09 | 25.23 |  |
| 8/1/09 | 25.26 |  |
| 8/1/09 | 25.29 |  |
| 8/1/09 | 25.32 |  |
| 8/1/09 | 25.35 |  |
| 8/1/09 | 25.39 |  |
| 8/1/09 | 25.42 |  |
| 8/1/09 | 25.45 |  |
| 8/1/09 | 25.48 |  |
| 8/1/09 | 25.53 |  |
| 8/1/09 | 25.58 |  |
| 8/1/09 | 25.64 |  |
| 8/1/09 | 25.68 |  |
| 7/31/09 | 25.74 |  |
| 7/31/09 | 25.79 |  |
| 7/31/09 | 25.84 |  |
| 7/31/09 | 25.87 |  |
| 7/31/09 | 25.87 |  |
| 7/31/09 | 25.87 |  |
| 7/31/09 | 25.88 |  |
| 7/31/09 | 25.84 |  |
| 7/31/09 | 25.84 |  |
| 7/31/09 | 25.8 |  |
| 7/31/09 | 25.76 |  |
| 7/31/09 | 25.79 |  |
| 7/31/09 | 25.76 |  |
| 7/31/09 | 25.71 |  |
| 7/31/09 | 25.7 |  |
| 7/31/09 | 25.71 |  |
| 7/31/09 | 25.67 |  |
| 7/31/09 | 25.62 |  |
| 7/31/09 | 25.58 |  |
| 7/31/09 | 25.56 |  |
| 7/31/09 | 25.57 |  |
| 7/31/09 | 25.57 |  |
| 7/31/09 | 25.53 |  |
| 7/31/09 | 25.54 |  |
| 7/31/09 | 25.54 |  |
| 7/31/09 | 25.54 |  |
| 7/31/09 | 25.56 |  |
| 7/31/09 | 25.58 |  |
| 7/31/09 | 25.59 |  |
| 7/31/09 | 25.61 |  |
| 7/31/09 | 25.61 |  |
| 7/31/09 | 25.66 |  |
| 7/31/09 | 25.69 |  |
| 7/31/09 | 25.73 |  |
| 7/31/09 | 25.76 |  |
| 7/31/09 | 25.81 |  |
| 7/31/09 | 25.84 |  |
| 7/31/09 | 25.87 |  |
| 7/31/09 | 25.85 |  |
| 7/31/09 | 25.88 |  |
| 7/31/09 | 25.91 |  |
| 7/31/09 | 25.92 |  |
| 7/31/09 | 25.92 |  |
| 7/31/09 | 25.93 |  |
| 7/31/09 | 25.94 |  |
| 7/31/09 | 25.86 |  |
| 7/31/09 | 25.84 |  |
| 7/31/09 | 25.87 |  |
| 7/30/09 | 25.85 |  |
| 7/30/09 | 25.85 |  |
| 7/30/09 | 25.82 |  |
| 7/30/09 | 25.75 |  |
| 7/30/09 | 25.76 |  |
| 7/30/09 | 25.79 |  |
| 7/30/09 | 25.8 |  |
| 7/30/09 | 25.86 |  |
| 7/30/09 | 25.86 |  |
| 7/30/09 | 25.96 |  |
| 7/30/09 | 25.95 |  |
| 7/30/09 | 25.92 |  |
| 7/30/09 | 25.78 |  |
| 7/30/09 | 25.77 |  |
| 7/30/09 | 25.87 |  |
| 7/30/09 | 25.68 |  |
| 7/30/09 | 25.69 |  |
| 7/30/09 | 25.54 |  |
| 7/30/09 | 25.43 |  |
| 7/30/09 | 25.42 |  |
| 7/30/09 | 25.41 |  |
| 7/30/09 | 25.43 |  |
| 7/30/09 | 25.42 |  |
| 7/30/09 | 25.35 |  |
| 7/30/09 | 25.32 |  |
| 7/30/09 | 25.22 |  |
| 7/30/09 | 25.18 |  |
| 7/30/09 | 25.16 |  |
| 7/30/09 | 25.14 |  |
| 7/30/09 | 25.14 |  |
| 7/30/09 | 25.14 |  |
| 7/30/09 | 25.14 |  |
| 7/30/09 | 25.15 |  |
| 7/30/09 | 25.16 |  |
| 7/30/09 | 25.18 |  |
| 7/30/09 | 25.2 |  |
| 7/30/09 | 25.22 |  |
| 7/30/09 | 25.26 |  |
| 7/30/09 | 25.28 |  |
| 7/30/09 | 25.31 |  |
| 7/30/09 | 25.33 |  |
| 7/30/09 | 25.36 |  |
| 7/30/09 | 25.39 |  |
| 7/30/09 | 25.41 |  |
| 7/30/09 | 25.43 |  |
| 7/30/09 | 25.46 |  |
| 7/30/09 | 25.49 |  |
| 7/30/09 | 25.51 |  |
| 7/29/09 | 25.54 |  |
| 7/29/09 | 25.56 |  |
| 7/29/09 | 25.62 |  |
| 7/29/09 | 25.64 |  |
| 7/29/09 | 25.68 |  |
| 7/29/09 | 25.72 |  |
| 7/29/09 | 25.76 |  |
| 7/29/09 | 25.78 |  |
| 7/29/09 | 25.79 |  |
| 7/29/09 | 25.82 |  |
| 7/29/09 | 25.86 |  |
| 7/29/09 | 25.88 |  |
| 7/29/09 | 25.9 |  |
| 7/29/09 | 25.94 |  |
| 7/29/09 | 25.95 |  |
| 7/29/09 | 25.95 |  |
| 7/29/09 | 25.99 |  |
| 7/29/09 | 25.97 |  |
| 7/29/09 | 25.93 |  |
| 7/29/09 | 25.9 |  |
| 7/29/09 | 25.87 |  |
| 7/29/09 | 25.85 |  |
| 7/29/09 | 25.84 |  |
| 7/29/09 | 25.84 |  |
| 7/29/09 | 25.86 |  |
| 7/29/09 | 25.86 |  |
| 7/29/09 | 25.86 |  |
| 7/29/09 | 25.89 |  |
| 7/29/09 | 25.93 |  |
| 7/29/09 | 26 |  |
| 7/29/09 | 26.06 |  |
| 7/29/09 | 26.13 |  |
| 7/29/09 | 26.2 |  |
| 7/29/09 | 26.26 |  |
| 7/29/09 | 26.32 |  |
| 7/29/09 | 26.38 |  |
| 7/29/09 | 26.45 |  |
| 7/29/09 | 26.52 |  |
| 7/29/09 | 26.59 |  |
| 7/29/09 | 26.61 |  |
| 7/29/09 | 26.63 |  |
| 7/29/09 | 26.57 |  |
| 7/29/09 | 26.54 |  |
| 7/29/09 | 26.53 |  |
| 7/29/09 | 26.5 |  |
| 7/29/09 | 26.51 |  |
| 7/29/09 | 26.51 |  |
| 7/29/09 | 26.48 |  |
| 7/28/09 | 26.48 |  |
| 7/28/09 | 26.52 |  |
| 7/28/09 | 26.52 |  |
| 7/28/09 | 26.51 |  |
| 7/28/09 | 26.58 |  |
| 7/28/09 | 26.7 |  |
| 7/28/09 | 26.65 |  |
| 7/28/09 | 26.72 |  |
| 7/28/09 | 26.73 |  |
| 7/28/09 | 26.74 |  |
| 7/28/09 | 26.66 |  |
| 7/28/09 | 26.68 |  |
| 7/28/09 | 26.59 |  |
| 7/28/09 | 26.66 |  |
| 7/28/09 | 26.57 |  |
| 7/28/09 | 26.41 |  |
| 7/28/09 | 26.37 |  |
| 7/28/09 | 26.27 |  |
| 7/28/09 | 26.18 |  |
| 7/28/09 | 26.19 |  |
| 7/28/09 | 26.12 |  |
| 7/28/09 | 26.03 |  |
| 7/28/09 | 26.02 |  |
| 7/28/09 | 25.94 |  |
| 7/28/09 | 25.9 |  |
| 7/28/09 | 25.83 |  |
| 7/28/09 | 25.72 |  |
| 7/28/09 | 25.69 |  |
| 7/28/09 | 25.64 |  |
| 7/28/09 | 25.61 |  |
| 7/28/09 | 25.61 |  |
| 7/28/09 | 25.62 |  |
| 7/28/09 | 25.64 |  |
| 7/28/09 | 25.67 |  |
| 7/28/09 | 25.72 |  |
| 7/28/09 | 25.77 |  |
| 7/28/09 | 25.82 |  |
| 7/28/09 | 25.87 |  |
| 7/28/09 | 25.94 |  |
| 7/28/09 | 26 |  |
| 7/28/09 | 26.08 |  |
| 7/28/09 | 26.15 |  |
| 7/28/09 | 26.16 |  |
| 7/28/09 | 26.12 |  |
| 7/28/09 | 26.07 |  |
| 7/28/09 | 26.04 |  |
| 7/28/09 | 26.06 |  |
| 7/28/09 | 26.03 |  |
| 7/27/09 | 26.01 |  |
| 7/27/09 | 26.01 |  |
| 7/27/09 | 25.98 |  |
| 7/27/09 | 26.08 |  |
| 7/27/09 | 26.22 |  |
| 7/27/09 | 26.23 |  |
| 7/27/09 | 26.25 |  |
| 7/27/09 | 26.3 |  |
| 7/27/09 | 26.33 |  |
| 7/27/09 | 26.2 |  |
| 7/27/09 | 26.06 |  |
| 7/27/09 | 26.01 |  |
| 7/27/09 | 26.04 |  |
| 7/27/09 | 25.98 |  |
| 7/27/09 | 25.88 |  |
| 7/27/09 | 25.72 |  |
| 7/27/09 | 25.53 |  |
| 7/27/09 | 25.43 |  |
| 7/27/09 | 25.32 |  |
| 7/27/09 | 25.26 |  |
| 7/27/09 | 25.18 |  |
| 7/27/09 | 25.2 |  |
| 7/27/09 | 25.16 |  |
| 7/27/09 | 24.98 |  |
| 7/27/09 | 24.88 |  |
| 7/27/09 | 24.85 |  |
| 7/27/09 | 24.8 |  |
| 7/27/09 | 24.76 |  |
| 7/27/09 | 24.74 |  |
| 7/27/09 | 24.72 |  |
| 7/27/09 | 24.72 |  |
| 7/27/09 | 24.71 |  |
| 7/27/09 | 24.71 |  |
| 7/27/09 | 24.73 |  |
| 7/27/09 | 24.77 |  |
| 7/27/09 | 24.81 |  |
| 7/27/09 | 24.85 |  |
| 7/27/09 | 24.91 |  |
| 7/27/09 | 24.97 |  |
| 7/27/09 | 25.03 |  |
| 7/27/09 | 25.08 |  |
| 7/27/09 | 25.14 |  |
| 7/27/09 | 25.2 |  |
| 7/27/09 | 25.26 |  |
| 7/27/09 | 25.33 |  |
| 7/27/09 | 25.38 |  |
| 7/27/09 | 25.43 |  |
| 7/27/09 | 25.5 |  |
| 7/26/09 | 25.56 |  |
| 7/26/09 | 25.6 |  |
| 7/26/09 | 25.64 |  |
| 7/26/09 | 25.73 |  |
| 7/26/09 | 25.77 |  |
| 7/26/09 | 25.75 |  |
| 7/26/09 | 25.77 |  |
| 7/26/09 | 25.73 |  |
| 7/26/09 | 25.54 |  |
| 7/26/09 | 25.44 |  |
| 7/26/09 | 25.39 |  |
| 7/26/09 | 25.4 |  |
| 7/26/09 | 25.12 |  |
| 7/26/09 | 25.04 |  |
| 7/26/09 | 25.03 |  |
| 7/26/09 | 25.06 |  |
| 7/26/09 | 25.02 |  |
| 7/26/09 | 24.88 |  |
| 7/26/09 | 24.86 |  |
| 7/26/09 | 24.82 |  |
| 7/26/09 | 24.75 |  |
| 7/26/09 | 24.69 |  |
| 7/26/09 | 24.72 |  |
| 7/26/09 | 24.7 |  |
| 7/26/09 | 24.62 |  |
| 7/26/09 | 24.61 |  |
| 7/26/09 | 24.61 |  |
| 7/26/09 | 24.61 |  |
| 7/26/09 | 24.57 |  |
| 7/26/09 | 24.57 |  |
| 7/26/09 | 24.58 |  |
| 7/26/09 | 24.59 |  |
| 7/26/09 | 24.6 |  |
| 7/26/09 | 24.62 |  |
| 7/26/09 | 24.65 |  |
| 7/26/09 | 24.68 |  |
| 7/26/09 | 24.72 |  |
| 7/26/09 | 24.76 |  |
| 7/26/09 | 24.79 |  |
| 7/26/09 | 24.82 |  |
| 7/26/09 | 24.86 |  |
| 7/26/09 | 24.89 |  |
| 7/26/09 | 24.92 |  |
| 7/26/09 | 24.97 |  |
| 7/26/09 | 25.01 |  |
| 7/26/09 | 25.08 |  |
| 7/26/09 | 25.13 |  |
| 7/26/09 | 25.18 |  |
| 7/25/09 | 25.21 |  |
| 7/25/09 | 25.28 |  |
| 7/25/09 | 25.37 |  |
| 7/25/09 | 25.34 |  |
| 7/25/09 | 25.34 |  |
| 7/25/09 | 25.33 |  |
| 7/25/09 | 25.21 |  |
| 7/25/09 | 25.18 |  |
| 7/25/09 | 25.08 |  |
| 7/25/09 | 25 |  |
| 7/25/09 | 24.97 |  |
| 7/25/09 | 24.91 |  |
| 7/25/09 | 24.92 |  |
| 7/25/09 | 24.81 |  |
| 7/25/09 | 25.04 |  |
| 7/25/09 | 24.91 |  |
| 7/25/09 | 24.9 |  |
| 7/25/09 | 24.75 |  |
| 7/25/09 | 24.68 |  |
| 7/25/09 | 24.67 |  |
| 7/25/09 | 24.65 |  |
| 7/25/09 | 24.86 |  |
| 7/25/09 | 24.85 |  |
| 7/25/09 | 24.56 |  |
| 7/25/09 | 24.52 |  |
| 7/25/09 | 24.56 |  |
| 7/25/09 | 24.47 |  |
| 7/25/09 | 24.4 |  |
| 7/25/09 | 24.4 |  |
| 7/25/09 | 24.39 |  |
| 7/25/09 | 24.37 |  |
| 7/25/09 | 24.38 |  |
| 7/25/09 | 24.4 |  |
| 7/25/09 | 24.44 |  |
| 7/25/09 | 24.48 |  |
| 7/25/09 | 24.54 |  |
| 7/25/09 | 24.58 |  |
| 7/25/09 | 24.63 |  |
| 7/25/09 | 24.69 |  |
| 7/25/09 | 24.72 |  |
| 7/25/09 | 24.77 |  |
| 7/25/09 | 24.83 |  |
| 7/25/09 | 24.91 |  |
| 7/25/09 | 24.97 |  |
| 7/25/09 | 25.03 |  |
| 7/25/09 | 25.11 |  |
| 7/25/09 | 25.14 |  |
| 7/25/09 | 25.09 |  |
| 7/24/09 | 24.96 |  |
| 7/24/09 | 24.87 |  |
| 7/24/09 | 24.93 |  |
| 7/24/09 | 24.91 |  |
| 7/24/09 | 24.97 |  |
| 7/24/09 | 25.1 |  |
| 7/24/09 | 25.18 |  |
| 7/24/09 | 25.08 |  |
| 7/24/09 | 25.1 |  |
| 7/24/09 | 25.06 |  |
| 7/24/09 | 24.72 |  |
| 7/24/09 | 24.73 |  |
| 7/24/09 | 24.71 |  |
| 7/24/09 | 24.81 |  |
| 7/24/09 | 24.4 |  |
| 7/24/09 | 24.41 |  |
| 7/24/09 | 24.38 |  |
| 7/24/09 | 24.3 |  |
| 7/24/09 | 24.28 |  |
| 7/24/09 | 24.24 |  |
| 7/24/09 | 24.23 |  |
| 7/24/09 | 24.08 |  |
| 7/24/09 | 24.03 |  |
| 7/24/09 | 23.99 |  |
| 7/24/09 | 23.94 |  |
| 7/24/09 | 23.92 |  |
| 7/24/09 | 23.92 |  |
| 7/24/09 | 23.91 |  |
| 7/24/09 | 23.92 |  |
| 7/24/09 | 23.91 |  |
| 7/24/09 | 23.9 |  |
| 7/24/09 | 23.91 |  |
| 7/24/09 | 23.93 |  |
| 7/24/09 | 23.96 |  |
| 7/24/09 | 23.98 |  |
| 7/24/09 | 24.02 |  |
| 7/24/09 | 24.06 |  |
| 7/24/09 | 24.08 |  |
| 7/24/09 | 24.13 |  |
| 7/24/09 | 24.17 |  |
| 7/24/09 | 24.21 |  |
| 7/24/09 | 24.24 |  |
| 7/24/09 | 24.27 |  |
| 7/24/09 | 24.31 |  |
| 7/24/09 | 24.37 |  |
| 7/24/09 | 24.43 |  |
| 7/24/09 | 24.47 |  |
| 7/24/09 | 24.52 |  |
| 7/23/09 | 24.56 |  |
| 7/23/09 | 24.58 |  |
| 7/23/09 | 24.62 |  |
| 7/23/09 | 24.62 |  |
| 7/23/09 | 24.61 |  |
| 7/23/09 | 24.57 |  |
| 7/23/09 | 24.59 |  |
| 7/23/09 | 24.46 |  |
| 7/23/09 | 24.74 |  |
| 7/23/09 | 24.62 |  |
| 7/23/09 | 24.65 |  |
| 7/23/09 | 24.73 |  |
| 7/23/09 | 24.69 |  |
| 7/23/09 | 24.65 |  |
| 7/23/09 | 24.31 |  |
| 7/23/09 | 24.37 |  |
| 7/23/09 | 24.25 |  |
| 7/23/09 | 24.17 |  |
| 7/23/09 | 24.16 |  |
| 7/23/09 | 24.14 |  |
| 7/23/09 | 24.14 |  |
| 7/23/09 | 24.06 |  |
| 7/23/09 | 24.09 |  |
| 7/23/09 | 24.11 |  |
| 7/23/09 | 24.06 |  |
| 7/23/09 | 24.03 |  |
| 7/23/09 | 24.04 |  |
| 7/23/09 | 24.02 |  |
| 7/23/09 | 24.02 |  |
| 7/23/09 | 24.03 |  |
| 7/23/09 | 24.01 |  |
| 7/23/09 | 24 |  |
| 7/23/09 | 24.02 |  |
| 7/23/09 | 24.05 |  |
| 7/23/09 | 24.09 |  |
| 7/23/09 | 24.13 |  |
| 7/23/09 | 24.2 |  |
| 7/23/09 | 24.2 |  |
| 7/23/09 | 24.44 |  |
| 7/23/09 | 24.42 |  |
| 7/23/09 | 24.35 |  |
| 7/23/09 | 24.25 |  |
| 7/23/09 | 24.28 |  |
| 7/23/09 | 24.26 |  |
| 7/23/09 | 24.24 |  |
| 7/23/09 | 24.21 |  |
| 7/23/09 | 24.17 |  |
| 7/23/09 | 24.25 |  |
| 7/22/09 | 24.3 |  |
| 7/22/09 | 24.28 |  |
| 7/22/09 | 24.24 |  |
| 7/22/09 | 24.22 |  |
| 7/22/09 | 24.22 |  |
| 7/22/09 | 24.32 |  |
| 7/22/09 | 24.48 |  |
| 7/22/09 | 24.21 |  |
| 7/22/09 | 24.12 |  |
| 7/22/09 | 24.07 |  |
| 7/22/09 | 24.14 |  |
| 7/22/09 | 24.21 |  |
| 7/22/09 | 24.2 |  |
| 7/22/09 | 24.11 |  |
| 7/22/09 | 24.13 |  |
| 7/22/09 | 24.04 |  |
| 7/22/09 | 24.07 |  |
| 7/22/09 | 24.18 |  |
| 7/22/09 | 24.06 |  |
| 7/22/09 | 24.07 |  |
| 7/22/09 | 23.99 |  |
| 7/22/09 | 23.91 |  |
| 7/22/09 | 24 |  |
| 7/22/09 | 23.94 |  |
| 7/22/09 | 23.82 |  |
| 7/22/09 | 23.75 |  |
| 7/22/09 | 23.74 |  |
| 7/22/09 | 23.71 |  |
| 7/22/09 | 23.66 |  |
| 7/22/09 | 23.64 |  |
| 7/22/09 | 23.65 |  |
| 7/22/09 | 23.63 |  |
| 7/22/09 | 23.64 |  |
| 7/22/09 | 23.67 |  |
| 7/22/09 | 23.69 |  |
| 7/22/09 | 23.73 |  |
| 7/22/09 | 23.77 |  |
| 7/22/09 | 23.83 |  |
| 7/22/09 | 23.89 |  |
| 7/22/09 | 23.96 |  |
| 7/22/09 | 24.01 |  |
| 7/22/09 | 24.07 |  |
| 7/22/09 | 24.12 |  |
| 7/22/09 | 24.18 |  |
| 7/22/09 | 24.23 |  |
| 7/22/09 | 24.29 |  |
| 7/22/09 | 24.35 |  |
| 7/22/09 | 24.38 |  |
| 7/21/09 | 24.37 |  |
| 7/21/09 | 24.45 |  |
| 7/21/09 | 24.51 |  |
| 7/21/09 | 24.53 |  |
| 7/21/09 | 24.36 |  |
| 7/21/09 | 24.39 |  |
| 7/21/09 | 24.38 |  |
| 7/21/09 | 24.44 |  |
| 7/21/09 | 24.47 |  |
| 7/21/09 | 24.4 |  |
| 7/21/09 | 24.73 |  |
| 7/21/09 | 24.25 |  |
| 7/21/09 | 24.39 |  |
| 7/21/09 | 24.57 |  |
| 7/21/09 | 24.6 |  |
| 7/21/09 | 25.13 |  |
| 7/21/09 | 25.03 |  |
| 7/21/09 | 25.01 |  |
| 7/21/09 | 24.85 |  |
| 7/21/09 | 24.44 |  |
| 7/21/09 | 24.16 |  |
| 7/21/09 | 24.01 |  |
| 7/21/09 | 23.87 |  |
| 7/21/09 | 23.77 |  |
| 7/21/09 | 23.74 |  |
| 7/21/09 | 23.7 |  |
| 7/21/09 | 23.69 |  |
| 7/21/09 | 23.67 |  |
| 7/21/09 | 23.67 |  |
| 7/21/09 | 23.68 |  |
| 7/21/09 | 23.69 |  |
| 7/21/09 | 23.7 |  |
| 7/21/09 | 23.72 |  |
| 7/21/09 | 23.73 |  |
| 7/21/09 | 23.75 |  |
| 7/21/09 | 23.77 |  |
| 7/21/09 | 23.79 |  |
| 7/21/09 | 23.84 |  |
| 7/21/09 | 23.87 |  |
| 7/21/09 | 23.9 |  |
| 7/21/09 | 23.94 |  |
| 7/21/09 | 23.97 |  |
| 7/21/09 | 24.01 |  |
| 7/21/09 | 24.05 |  |
| 7/21/09 | 24.09 |  |
| 7/21/09 | 24.14 |  |
| 7/21/09 | 24.19 |  |
| 7/21/09 | 24.23 |  |
| 7/20/09 | 24.28 |  |
| 7/20/09 | 24.33 |  |
| 7/20/09 | 24.37 |  |
| 7/20/09 | 24.42 |  |
| 7/20/09 | 24.47 |  |
| 7/20/09 | 24.51 |  |
| 7/20/09 | 24.55 |  |
| 7/20/09 | 24.56 |  |
| 7/20/09 | 24.56 |  |
| 7/20/09 | 24.51 |  |
| 7/20/09 | 24.55 |  |
| 7/20/09 | 24.62 |  |
| 7/20/09 | 24.56 |  |
| 7/20/09 | 24.71 |  |
| 7/20/09 | 24.81 |  |
| 7/20/09 | 24.74 |  |
| 7/20/09 | 24.59 |  |
| 7/20/09 | 24.56 |  |
| 7/20/09 | 24.57 |  |
| 7/20/09 | 24.51 |  |
| 7/20/09 | 24.45 |  |
| 7/20/09 | 24.48 |  |
| 7/20/09 | 24.31 |  |
| 7/20/09 | 24.19 |  |
| 7/20/09 | 24.13 |  |
| 7/20/09 | 24.02 |  |
| 7/20/09 | 23.94 |  |
| 7/20/09 | 23.9 |  |
| 7/20/09 | 23.93 |  |
| 7/20/09 | 23.91 |  |
| 7/20/09 | 23.87 |  |
| 7/20/09 | 23.86 |  |
| 7/20/09 | 23.88 |  |
| 7/20/09 | 23.92 |  |
| 7/20/09 | 23.96 |  |
| 7/20/09 | 24.01 |  |
| 7/20/09 | 24.07 |  |
| 7/20/09 | 24.13 |  |
| 7/20/09 | 24.19 |  |
| 7/20/09 | 24.27 |  |
| 7/20/09 | 24.34 |  |
| 7/20/09 | 24.41 |  |
| 7/20/09 | 24.51 |  |
| 7/20/09 | 24.57 |  |
| 7/20/09 | 24.58 |  |
| 7/20/09 | 24.69 |  |
| 7/20/09 | 24.7 |  |
| 7/20/09 | 24.81 |  |
| 7/19/09 | 24.75 |  |
| 7/19/09 | 24.53 |  |
| 7/19/09 | 24.52 |  |
| 7/19/09 | 24.55 |  |
| 7/19/09 | 24.52 |  |
| 7/19/09 | 24.51 |  |
| 7/19/09 | 24.62 |  |
| 7/19/09 | 24.71 |  |
| 7/19/09 | 25.01 |  |
| 7/19/09 | 25.31 |  |
| 7/19/09 | 24.86 |  |
| 7/19/09 | 24.83 |  |
| 7/19/09 | 24.52 |  |
| 7/19/09 | 24.38 |  |
| 7/19/09 | 24.3 |  |
| 7/19/09 | 24.28 |  |
| 7/19/09 | 24.1 |  |
| 7/19/09 | 24 |  |
| 7/19/09 | 24.16 |  |
| 7/19/09 | 24.16 |  |
| 7/19/09 | 24.37 |  |
| 7/19/09 | 24.25 |  |
| 7/19/09 | 23.97 |  |
| 7/19/09 | 24.01 |  |
| 7/19/09 | 23.89 |  |
| 7/19/09 | 23.88 |  |
| 7/19/09 | 23.86 |  |
| 7/19/09 | 23.84 |  |
| 7/19/09 | 23.83 |  |
| 7/19/09 | 23.83 |  |
| 7/19/09 | 23.81 |  |
| 7/19/09 | 23.83 |  |
| 7/19/09 | 23.87 |  |
| 7/19/09 | 23.91 |  |
| 7/19/09 | 23.95 |  |
| 7/19/09 | 23.99 |  |
| 7/19/09 | 24.03 |  |
| 7/19/09 | 24.07 |  |
| 7/19/09 | 24.13 |  |
| 7/19/09 | 24.2 |  |
| 7/19/09 | 24.25 |  |
| 7/19/09 | 24.29 |  |
| 7/19/09 | 24.33 |  |
| 7/19/09 | 24.36 |  |
| 7/19/09 | 24.41 |  |
| 7/19/09 | 24.45 |  |
| 7/19/09 | 24.49 |  |
| 7/19/09 | 24.53 |  |
| 7/18/09 | 24.57 |  |
| 7/18/09 | 24.62 |  |
| 7/18/09 | 24.67 |  |
| 7/18/09 | 24.72 |  |
| 7/18/09 | 24.77 |  |
| 7/18/09 | 24.82 |  |
| 7/18/09 | 24.87 |  |
| 7/18/09 | 24.9 |  |
| 7/18/09 | 24.93 |  |
| 7/18/09 | 24.96 |  |
| 7/18/09 | 24.95 |  |
| 7/18/09 | 24.91 |  |
| 7/18/09 | 24.86 |  |
| 7/18/09 | 24.93 |  |
| 7/18/09 | 24.94 |  |
| 7/18/09 | 24.94 |  |
| 7/18/09 | 24.97 |  |
| 7/18/09 | 24.94 |  |
| 7/18/09 | 24.9 |  |
| 7/18/09 | 24.91 |  |
| 7/18/09 | 24.93 |  |
| 7/18/09 | 24.95 |  |
| 7/18/09 | 24.97 |  |
| 7/18/09 | 24.95 |  |
| 7/18/09 | 24.93 |  |
| 7/18/09 | 24.87 |  |
| 7/18/09 | 24.76 |  |
| 7/18/09 | 24.76 |  |
| 7/18/09 | 24.8 |  |
| 7/18/09 | 24.84 |  |
| 7/18/09 | 24.79 |  |
| 7/18/09 | 24.8 |  |
| 7/18/09 | 24.82 |  |
| 7/18/09 | 24.85 |  |
| 7/18/09 | 24.89 |  |
| 7/18/09 | 24.96 |  |
| 7/18/09 | 25.02 |  |
| 7/18/09 | 25.09 |  |
| 7/18/09 | 25.12 |  |
| 7/18/09 | 25.18 |  |
| 7/18/09 | 25.22 |  |
| 7/18/09 | 25.28 |  |
| 7/18/09 | 25.33 |  |
| 7/18/09 | 25.38 |  |
| 7/18/09 | 25.43 |  |
| 7/18/09 | 25.47 |  |
| 7/18/09 | 25.53 |  |
| 7/18/09 | 25.57 |  |
| 7/17/09 | 25.61 |  |
| 7/17/09 | 25.66 |  |
| 7/17/09 | 25.71 |  |
| 7/17/09 | 25.76 |  |
| 7/17/09 | 25.82 |  |
| 7/17/09 | 25.87 |  |
| 7/17/09 | 25.91 |  |
| 7/17/09 | 25.96 |  |
| 7/17/09 | 26 |  |
| 7/17/09 | 26.07 |  |
| 7/17/09 | 26.16 |  |
| 7/17/09 | 26.06 |  |
| 7/17/09 | 26.01 |  |
| 7/17/09 | 26.04 |  |
| 7/17/09 | 26.02 |  |
| 7/17/09 | 25.96 |  |
| 7/17/09 | 25.91 |  |
| 7/17/09 | 25.9 |  |
| 7/17/09 | 25.94 |  |
| 7/17/09 | 25.99 |  |
| 7/17/09 | 26.03 |  |
| 7/17/09 | 26.07 |  |
| 7/17/09 | 26.09 |  |
| 7/17/09 | 26.11 |  |
| 7/17/09 | 26.1 |  |
| 7/17/09 | 26.09 |  |
| 7/17/09 | 26.1 |  |
| 7/17/09 | 26.14 |  |
| 7/17/09 | 26.15 |  |
| 7/17/09 | 26.16 |  |
| 7/17/09 | 26.17 |  |
| 7/17/09 | 26.2 |  |
| 7/17/09 | 26.25 |  |
| 7/17/09 | 26.3 |  |
| 7/17/09 | 26.35 |  |
| 7/17/09 | 26.41 |  |
| 7/17/09 | 26.48 |  |
| 7/17/09 | 26.54 |  |
| 7/17/09 | 26.6 |  |
| 7/17/09 | 26.67 |  |
| 7/17/09 | 26.73 |  |
| 7/17/09 | 26.81 |  |
| 7/17/09 | 26.86 |  |
| 7/17/09 | 26.94 |  |
| 7/17/09 | 27.01 |  |
| 7/17/09 | 27.09 |  |
| 7/17/09 | 27.17 |  |
| 7/17/09 | 27.25 |  |
| 7/16/09 | 27.36 |  |
| 7/16/09 | 27.47 |  |
| 7/16/09 | 27.56 |  |
| 7/16/09 | 27.63 |  |
| 7/16/09 | 27.68 |  |
| 7/16/09 | 27.7 |  |
| 7/16/09 | 27.61 |  |
| 7/16/09 | 27.53 |  |
| 7/16/09 | 27.47 |  |
| 7/16/09 | 27.42 |  |
| 7/16/09 | 27.47 |  |
| 7/16/09 | 27.36 |  |
| 7/16/09 | 27.28 |  |
| 7/16/09 | 27.41 |  |
| 7/16/09 | 27.22 |  |
| 7/16/09 | 27.08 |  |
| 7/16/09 | 27.23 |  |
| 7/16/09 | 27.11 |  |
| 7/16/09 | 26.71 |  |
| 7/16/09 | 26.63 |  |
| 7/16/09 | 26.69 |  |
| 7/16/09 | 26.43 |  |
| 7/16/09 | 26.18 |  |
| 7/16/09 | 26.27 |  |
| 7/16/09 | 26.46 |  |
| 7/16/09 | 26.23 |  |
| 7/16/09 | 26.18 |  |
| 7/16/09 | 26.13 |  |
| 7/16/09 | 25.97 |  |
| 7/16/09 | 26.13 |  |
| 7/16/09 | 26.09 |  |
| 7/16/09 | 26.18 |  |
| 7/16/09 | 26.21 |  |
| 7/16/09 | 26.17 |  |
| 7/16/09 | 26.12 |  |
| 7/16/09 | 26.14 |  |
| 7/16/09 | 26.18 |  |
| 7/16/09 | 26.2 |  |
| 7/16/09 | 26.18 |  |
| 7/16/09 | 26.2 |  |
| 7/16/09 | 26.2 |  |
| 7/16/09 | 26.26 |  |
| 7/16/09 | 26.23 |  |
| 7/16/09 | 26.2 |  |
| 7/16/09 | 26.15 |  |
| 7/16/09 | 26.2 |  |
| 7/16/09 | 26.16 |  |
| 7/16/09 | 26.28 |  |
| 7/15/09 | 26.24 |  |
| 7/15/09 | 26.24 |  |
| 7/15/09 | 26.31 |  |
| 7/15/09 | 26.31 |  |
| 7/15/09 | 26.32 |  |
| 7/15/09 | 26.26 |  |
| 7/15/09 | 26.23 |  |
| 7/15/09 | 26.2 |  |
| 7/15/09 | 26.21 |  |
| 7/15/09 | 26.21 |  |
| 7/15/09 | 26.15 |  |
| 7/15/09 | 26.09 |  |
| 7/15/09 | 26.23 |  |
| 7/15/09 | 25.97 |  |
| 7/15/09 | 26.15 |  |
| 7/15/09 | 26 |  |
| 7/15/09 | 25.91 |  |
| 7/15/09 | 25.8 |  |
| 7/15/09 | 25.92 |  |
| 7/15/09 | 25.56 |  |
| 7/15/09 | 25.68 |  |
| 7/15/09 | 25.66 |  |
| 7/15/09 | 25.67 |  |
| 7/15/09 | 25.5 |  |
| 7/15/09 | 25.5 |  |
| 7/15/09 | 25.45 |  |
| 7/15/09 | 25.33 |  |
| 7/15/09 | 25.26 |  |
| 7/15/09 | 25.23 |  |
| 7/15/09 | 25.23 |  |
| 7/15/09 | 25.21 |  |
| 7/15/09 | 25.2 |  |
| 7/15/09 | 25.21 |  |
| 7/15/09 | 25.25 |  |
| 7/15/09 | 25.31 |  |
| 7/15/09 | 25.36 |  |
| 7/15/09 | 25.44 |  |
| 7/15/09 | 25.5 |  |
| 7/15/09 | 25.57 |  |
| 7/15/09 | 25.65 |  |
| 7/15/09 | 25.72 |  |
| 7/15/09 | 25.8 |  |
| 7/15/09 | 25.89 |  |
| 7/15/09 | 25.98 |  |
| 7/15/09 | 26.05 |  |
| 7/15/09 | 26.17 |  |
| 7/15/09 | 26.27 |  |
| 7/15/09 | 26.37 |  |
| 7/14/09 | 26.46 |  |
| 7/14/09 | 26.56 |  |
| 7/14/09 | 26.67 |  |
| 7/14/09 | 26.75 |  |
| 7/14/09 | 26.8 |  |
| 7/14/09 | 26.73 |  |
| 7/14/09 | 26.64 |  |
| 7/14/09 | 26.83 |  |
| 7/14/09 | 26.64 |  |
| 7/14/09 | 26.69 |  |
| 7/14/09 | 26.57 |  |
| 7/14/09 | 26.56 |  |
| 7/14/09 | 26.35 |  |
| 7/14/09 | 26.24 |  |
| 7/14/09 | 26.09 |  |
| 7/14/09 | 26.07 |  |
| 7/14/09 | 26.08 |  |
| 7/14/09 | 26.14 |  |
| 7/14/09 | 26.01 |  |
| 7/14/09 | 25.76 |  |
| 7/14/09 | 25.85 |  |
| 7/14/09 | 25.45 |  |
| 7/14/09 | 25.37 |  |
| 7/14/09 | 25.38 |  |
| 7/14/09 | 25.42 |  |
| 7/14/09 | 25.33 |  |
| 7/14/09 | 25.32 |  |
| 7/14/09 | 25.33 |  |
| 7/14/09 | 25.27 |  |
| 7/14/09 | 25.25 |  |
| 7/14/09 | 25.23 |  |
| 7/14/09 | 25.24 |  |
| 7/14/09 | 25.26 |  |
| 7/14/09 | 25.29 |  |
| 7/14/09 | 25.36 |  |
| 7/14/09 | 25.41 |  |
| 7/14/09 | 25.49 |  |
| 7/14/09 | 25.57 |  |
| 7/14/09 | 25.65 |  |
| 7/14/09 | 25.72 |  |
| 7/14/09 | 25.79 |  |
| 7/14/09 | 25.87 |  |
| 7/14/09 | 25.94 |  |
| 7/14/09 | 26.03 |  |
| 7/14/09 | 26.13 |  |
| 7/14/09 | 26.22 |  |
| 7/14/09 | 26.31 |  |
| 7/14/09 | 26.44 |  |
| 7/13/09 | 26.55 |  |
| 7/13/09 | 26.66 |  |
| 7/13/09 | 26.78 |  |
| 7/13/09 | 26.9 |  |
| 7/13/09 | 27.02 |  |
| 7/13/09 | 27.12 |  |
| 7/13/09 | 27.25 |  |
| 7/13/09 | 27.31 |  |
| 7/13/09 | 27.18 |  |
| 7/13/09 | 27.1 |  |
| 7/13/09 | 27.02 |  |
| 7/13/09 | 27.03 |  |
| 7/13/09 | 26.99 |  |
| 7/13/09 | 26.75 |  |
| 7/13/09 | 26.74 |  |
| 7/13/09 | 26.83 |  |
| 7/13/09 | 26.79 |  |
| 7/13/09 | 26.36 |  |
| 7/13/09 | 26.48 |  |
| 7/13/09 | 26.34 |  |
| 7/13/09 | 26.19 |  |
| 7/13/09 | 26.06 |  |
| 7/13/09 | 26.02 |  |
| 7/13/09 | 26.03 |  |
| 7/13/09 | 25.98 |  |
| 7/13/09 | 25.9 |  |
| 7/13/09 | 25.81 |  |
| 7/13/09 | 25.79 |  |
| 7/13/09 | 25.77 |  |
| 7/13/09 | 25.74 |  |
| 7/13/09 | 25.71 |  |
| 7/13/09 | 25.69 |  |
| 7/13/09 | 25.71 |  |
| 7/13/09 | 25.76 |  |
| 7/13/09 | 25.82 |  |
| 7/13/09 | 25.88 |  |
| 7/13/09 | 25.95 |  |
| 7/13/09 | 26.02 |  |
| 7/13/09 | 26.08 |  |
| 7/13/09 | 26.18 |  |
| 7/13/09 | 26.26 |  |
| 7/13/09 | 26.36 |  |
| 7/13/09 | 26.46 |  |
| 7/13/09 | 26.55 |  |
| 7/13/09 | 26.65 |  |
| 7/13/09 | 26.73 |  |
| 7/13/09 | 26.84 |  |
| 7/13/09 | 26.93 |  |
| 7/12/09 | 27.03 |  |
| 7/12/09 | 27.12 |  |
| 7/12/09 | 27.22 |  |
| 7/12/09 | 27.3 |  |
| 7/12/09 | 27.29 |  |
| 7/12/09 | 27.17 |  |
| 7/12/09 | 26.96 |  |
| 7/12/09 | 26.83 |  |
| 7/12/09 | 26.8 |  |
| 7/12/09 | 26.9 |  |
| 7/12/09 | 26.9 |  |
| 7/12/09 | 26.82 |  |
| 7/12/09 | 26.76 |  |
| 7/12/09 | 26.53 |  |
| 7/12/09 | 26.34 |  |
| 7/12/09 | 26.36 |  |
| 7/12/09 | 26.23 |  |
| 7/12/09 | 26.04 |  |
| 7/12/09 | 26.13 |  |
| 7/12/09 | 25.92 |  |
| 7/12/09 | 25.89 |  |
| 7/12/09 | 25.9 |  |
| 7/12/09 | 25.81 |  |
| 7/12/09 | 25.84 |  |
| 7/12/09 | 25.8 |  |
| 7/12/09 | 25.66 |  |
| 7/12/09 | 25.54 |  |
| 7/12/09 | 25.48 |  |
| 7/12/09 | 25.44 |  |
| 7/12/09 | 25.44 |  |
| 7/12/09 | 25.39 |  |
| 7/12/09 | 25.38 |  |
| 7/12/09 | 25.38 |  |
| 7/12/09 | 25.4 |  |
| 7/12/09 | 25.45 |  |
| 7/12/09 | 25.5 |  |
| 7/12/09 | 25.57 |  |
| 7/12/09 | 25.62 |  |
| 7/12/09 | 25.67 |  |
| 7/12/09 | 25.72 |  |
| 7/12/09 | 25.76 |  |
| 7/12/09 | 25.8 |  |
| 7/12/09 | 25.85 |  |
| 7/12/09 | 25.9 |  |
| 7/12/09 | 25.93 |  |
| 7/12/09 | 25.97 |  |
| 7/12/09 | 25.98 |  |
| 7/12/09 | 26 |  |
| 7/11/09 | 26.04 |  |
| 7/11/09 | 26.18 |  |
| 7/11/09 | 26.18 |  |
| 7/11/09 | 26.21 |  |
| 7/11/09 | 26.24 |  |
| 7/11/09 | 26.33 |  |
| 7/11/09 | 26.38 |  |
| 7/11/09 | 26.44 |  |
| 7/11/09 | 26.18 |  |
| 7/11/09 | 26.31 |  |
| 7/11/09 | 26.46 |  |
| 7/11/09 | 26.57 |  |
| 7/11/09 | 26.42 |  |
| 7/11/09 | 26.32 |  |
| 7/11/09 | 26.38 |  |
| 7/11/09 | 26.28 |  |
| 7/11/09 | 26.14 |  |
| 7/11/09 | 26.11 |  |
| 7/11/09 | 26.03 |  |
| 7/11/09 | 26.04 |  |
| 7/11/09 | 26.09 |  |
| 7/11/09 | 26.16 |  |
| 7/11/09 | 26.13 |  |
| 7/11/09 | 26.07 |  |
| 7/11/09 | 26.03 |  |
| 7/11/09 | 26.04 |  |
| 7/11/09 | 26.02 |  |
| 7/11/09 | 26.03 |  |
| 7/11/09 | 25.97 |  |
| 7/11/09 | 25.96 |  |
| 7/11/09 | 25.98 |  |
| 7/11/09 | 26 |  |
| 7/11/09 | 26.02 |  |
| 7/11/09 | 26.03 |  |
| 7/11/09 | 26.08 |  |
| 7/11/09 | 26.14 |  |
| 7/11/09 | 26.19 |  |
| 7/11/09 | 26.26 |  |
| 7/11/09 | 26.28 |  |
| 7/11/09 | 26.19 |  |
| 7/11/09 | 26.24 |  |
| 7/11/09 | 26.22 |  |
| 7/11/09 | 26.26 |  |
| 7/11/09 | 26.27 |  |
| 7/11/09 | 26.21 |  |
| 7/11/09 | 26.21 |  |
| 7/11/09 | 26.2 |  |
| 7/11/09 | 26.16 |  |
| 7/10/09 | 26.15 |  |
| 7/10/09 | 26.16 |  |
| 7/10/09 | 26.12 |  |
| 7/10/09 | 26.04 |  |
| 7/10/09 | 26.05 |  |
| 7/10/09 | 26.11 |  |
| 7/10/09 | 26.14 |  |
| 7/10/09 | 26.2 |  |
| 7/10/09 | 26.16 |  |
| 7/10/09 | 26.04 |  |
| 7/10/09 | 25.92 |  |
| 7/10/09 | 25.93 |  |
| 7/10/09 | 25.97 |  |
| 7/10/09 | 25.93 |  |
| 7/10/09 | 25.74 |  |
| 7/10/09 | 25.67 |  |
| 7/10/09 | 25.78 |  |
| 7/10/09 | 25.79 |  |
| 7/10/09 | 25.75 |  |
| 7/10/09 | 26.03 |  |
| 7/10/09 | 25.67 |  |
| 7/10/09 | 25.63 |  |
| 7/10/09 | 25.49 |  |
| 7/10/09 | 25.4 |  |
| 7/10/09 | 25.25 |  |
| 7/10/09 | 25.16 |  |
| 7/10/09 | 25.08 |  |
| 7/10/09 | 25 |  |
| 7/10/09 | 25 |  |
| 7/10/09 | 24.99 |  |
| 7/10/09 | 24.95 |  |
| 7/10/09 | 24.95 |  |
| 7/10/09 | 24.96 |  |
| 7/10/09 | 24.99 |  |
| 7/10/09 | 25.07 |  |
| 7/10/09 | 25.16 |  |
| 7/10/09 | 25.26 |  |
| 7/10/09 | 25.35 |  |
| 7/10/09 | 25.44 |  |
| 7/10/09 | 25.5 |  |
| 7/10/09 | 25.57 |  |
| 7/10/09 | 25.56 |  |
| 7/10/09 | 25.55 |  |
| 7/10/09 | 25.47 |  |
| 7/10/09 | 25.5 |  |
| 7/10/09 | 25.49 |  |
| 7/10/09 | 25.47 |  |
| 7/10/09 | 25.54 |  |
| 7/9/09 | 25.53 |  |
| 7/9/09 | 25.49 |  |
| 7/9/09 | 25.52 |  |
| 7/9/09 | 25.46 |  |
| 7/9/09 | 25.36 |  |
| 7/9/09 | 25.26 |  |
| 7/9/09 | 25.29 |  |
| 7/9/09 | 25.2 |  |
| 7/9/09 | 25.27 |  |
| 7/9/09 | 25.29 |  |
| 7/9/09 | 25.39 |  |
| 7/9/09 | 25.48 |  |
| 7/9/09 | 25.29 |  |
| 7/9/09 | 25.36 |  |
| 7/9/09 | 25.13 |  |
| 7/9/09 | 25.08 |  |
| 7/9/09 | 25.26 |  |
| 7/9/09 | 25.33 |  |
| 7/9/09 | 25.53 |  |
| 7/9/09 | 25.25 |  |
| 7/9/09 | 25.35 |  |
| 7/9/09 | 25.06 |  |
| 7/9/09 | 25.03 |  |
| 7/9/09 | 24.68 |  |
| 7/9/09 | 24.75 |  |
| 7/9/09 | 24.63 |  |
| 7/9/09 | 24.49 |  |
| 7/9/09 | 24.43 |  |
| 7/9/09 | 24.39 |  |
| 7/9/09 | 24.39 |  |
| 7/9/09 | 24.38 |  |
| 7/9/09 | 24.36 |  |
| 7/9/09 | 24.37 |  |
| 7/9/09 | 24.38 |  |
| 7/9/09 | 24.4 |  |
| 7/9/09 | 24.46 |  |
| 7/9/09 | 24.51 |  |
| 7/9/09 | 24.6 |  |
| 7/9/09 | 24.67 |  |
| 7/9/09 | 24.73 |  |
| 7/9/09 | 24.79 |  |
| 7/9/09 | 24.85 |  |
| 7/9/09 | 24.92 |  |
| 7/9/09 | 25 |  |
| 7/9/09 | 25.09 |  |
| 7/9/09 | 25.19 |  |
| 7/9/09 | 25.28 |  |
| 7/9/09 | 25.39 |  |
| 7/8/09 | 25.49 |  |
| 7/8/09 | 25.56 |  |
| 7/8/09 | 25.63 |  |
| 7/8/09 | 25.49 |  |
| 7/8/09 | 25.4 |  |
| 7/8/09 | 25.35 |  |
| 7/8/09 | 25.31 |  |
| 7/8/09 | 25.33 |  |
| 7/8/09 | 25.54 |  |
| 7/8/09 | 25.48 |  |
| 7/8/09 | 25.43 |  |
| 7/8/09 | 25.47 |  |
| 7/8/09 | 25.48 |  |
| 7/8/09 | 25.39 |  |
| 7/8/09 | 25.15 |  |
| 7/8/09 | 25.11 |  |
| 7/8/09 | 25.01 |  |
| 7/8/09 | 24.92 |  |
| 7/8/09 | 24.85 |  |
| 7/8/09 | 24.84 |  |
| 7/8/09 | 24.82 |  |
| 7/8/09 | 24.71 |  |
| 7/8/09 | 24.58 |  |
| 7/8/09 | 24.65 |  |
| 7/8/09 | 24.63 |  |
| 7/8/09 | 24.57 |  |
| 7/8/09 | 24.53 |  |
| 7/8/09 | 24.47 |  |
| 7/8/09 | 24.43 |  |
| 7/8/09 | 24.42 |  |
| 7/8/09 | 24.4 |  |
| 7/8/09 | 24.39 |  |
| 7/8/09 | 24.42 |  |
| 7/8/09 | 24.45 |  |
| 7/8/09 | 24.49 |  |
| 7/8/09 | 24.55 |  |
| 7/8/09 | 24.61 |  |
| 7/8/09 | 24.67 |  |
| 7/8/09 | 24.73 |  |
| 7/8/09 | 24.79 |  |
| 7/8/09 | 24.88 |  |
| 7/8/09 | 24.96 |  |
| 7/8/09 | 25.03 |  |
| 7/8/09 | 25.12 |  |
| 7/8/09 | 25.2 |  |
| 7/8/09 | 25.29 |  |
| 7/8/09 | 25.36 |  |
| 7/8/09 | 25.43 |  |
| 7/7/09 | 25.48 |  |
| 7/7/09 | 25.52 |  |
| 7/7/09 | 25.59 |  |
| 7/7/09 | 25.69 |  |
| 7/7/09 | 25.8 |  |
| 7/7/09 | 25.87 |  |
| 7/7/09 | 25.94 |  |
| 7/7/09 | 25.92 |  |
| 7/7/09 | 26 |  |
| 7/7/09 | 25.93 |  |
| 7/7/09 | 25.79 |  |
| 7/7/09 | 25.8 |  |
| 7/7/09 | 25.94 |  |
| 7/7/09 | 25.7 |  |
| 7/7/09 | 25.67 |  |
| 7/7/09 | 25.95 |  |
| 7/7/09 | 25.38 |  |
| 7/7/09 | 25.38 |  |
| 7/7/09 | 25.39 |  |
| 7/7/09 | 25.24 |  |
| 7/7/09 | 25.45 |  |
| 7/7/09 | 25.39 |  |
| 7/7/09 | 25.21 |  |
| 7/7/09 | 25.11 |  |
| 7/7/09 | 25.02 |  |
| 7/7/09 | 24.87 |  |
| 7/7/09 | 24.8 |  |
| 7/7/09 | 24.83 |  |
| 7/7/09 | 24.74 |  |
| 7/7/09 | 24.71 |  |
| 7/7/09 | 24.71 |  |
| 7/7/09 | 24.68 |  |
| 7/7/09 | 24.68 |  |
| 7/7/09 | 24.71 |  |
| 7/7/09 | 24.76 |  |
| 7/7/09 | 24.83 |  |
| 7/7/09 | 24.92 |  |
| 7/7/09 | 24.99 |  |
| 7/7/09 | 25.09 |  |
| 7/7/09 | 25.16 |  |
| 7/7/09 | 25.24 |  |
| 7/7/09 | 25.31 |  |
| 7/7/09 | 25.4 |  |
| 7/7/09 | 25.47 |  |
| 7/7/09 | 25.58 |  |
| 7/7/09 | 25.67 |  |
| 7/7/09 | 25.77 |  |
| 7/7/09 | 25.85 |  |
| 7/6/09 | 25.88 |  |
| 7/6/09 | 25.97 |  |
| 7/6/09 | 25.95 |  |
| 7/6/09 | 26.02 |  |
| 7/6/09 | 26.08 |  |
| 7/6/09 | 26.02 |  |
| 7/6/09 | 25.9 |  |
| 7/6/09 | 25.86 |  |
| 7/6/09 | 25.65 |  |
| 7/6/09 | 25.57 |  |
| 7/6/09 | 25.57 |  |
| 7/6/09 | 25.45 |  |
| 7/6/09 | 25.43 |  |
| 7/6/09 | 25.21 |  |
| 7/6/09 | 25.33 |  |
| 7/6/09 | 25 |  |
| 7/6/09 | 24.91 |  |
| 7/6/09 | 24.79 |  |
| 7/6/09 | 24.98 |  |
| 7/6/09 | 24.6 |  |
| 7/6/09 | 24.64 |  |
| 7/6/09 | 24.54 |  |
| 7/6/09 | 24.62 |  |
| 7/6/09 | 24.61 |  |
| 7/6/09 | 24.58 |  |
| 7/6/09 | 24.49 |  |
| 7/6/09 | 24.39 |  |
| 7/6/09 | 24.41 |  |
| 7/6/09 | 24.38 |  |
| 7/6/09 | 24.31 |  |
| 7/6/09 | 24.27 |  |
| 7/6/09 | 24.25 |  |
| 7/6/09 | 24.27 |  |
| 7/6/09 | 24.32 |  |
| 7/6/09 | 24.38 |  |
| 7/6/09 | 24.46 |  |
| 7/6/09 | 24.56 |  |
| 7/6/09 | 24.65 |  |
| 7/6/09 | 24.72 |  |
| 7/6/09 | 24.82 |  |
| 7/6/09 | 24.89 |  |
| 7/6/09 | 24.94 |  |
| 7/6/09 | 24.89 |  |
| 7/6/09 | 24.86 |  |
| 7/6/09 | 24.68 |  |
| 7/6/09 | 24.72 |  |
| 7/6/09 | 24.69 |  |
| 7/6/09 | 24.75 |  |
| 7/5/09 | 24.74 |  |
| 7/5/09 | 24.69 |  |
| 7/5/09 | 24.76 |  |
| 7/5/09 | 24.78 |  |
| 7/5/09 | 24.73 |  |
| 7/5/09 | 24.7 |  |
| 7/5/09 | 24.7 |  |
| 7/5/09 | 24.57 |  |
| 7/5/09 | 24.66 |  |
| 7/5/09 | 24.49 |  |
| 7/5/09 | 24.54 |  |
| 7/5/09 | 24.7 |  |
| 7/5/09 | 24.52 |  |
| 7/5/09 | 24.42 |  |
| 7/5/09 | 24.32 |  |
| 7/5/09 | 24.39 |  |
| 7/5/09 | 24.45 |  |
| 7/5/09 | 24.41 |  |
| 7/5/09 | 24.33 |  |
| 7/5/09 | 24.26 |  |
| 7/5/09 | 24.29 |  |
| 7/5/09 | 24.08 |  |
| 7/5/09 | 23.91 |  |
| 7/5/09 | 23.94 |  |
| 7/5/09 | 23.84 |  |
| 7/5/09 | 23.72 |  |
| 7/5/09 | 23.7 |  |
| 7/5/09 | 23.64 |  |
| 7/5/09 | 23.59 |  |
| 7/5/09 | 23.57 |  |
| 7/5/09 | 23.56 |  |
| 7/5/09 | 23.56 |  |
| 7/5/09 | 23.57 |  |
| 7/5/09 | 23.58 |  |
| 7/5/09 | 23.6 |  |
| 7/5/09 | 23.61 |  |
| 7/5/09 | 23.63 |  |
| 7/5/09 | 23.7 |  |
| 7/5/09 | 23.77 |  |
| 7/5/09 | 23.83 |  |
| 7/5/09 | 23.89 |  |
| 7/5/09 | 23.96 |  |
| 7/5/09 | 24.02 |  |
| 7/5/09 | 24.09 |  |
| 7/5/09 | 24.17 |  |
| 7/5/09 | 24.25 |  |
| 7/5/09 | 24.33 |  |
| 7/5/09 | 24.41 |  |
| 7/4/09 | 24.5 |  |
| 7/4/09 | 24.6 |  |
| 7/4/09 | 24.71 |  |
| 7/4/09 | 24.8 |  |
| 7/4/09 | 24.84 |  |
| 7/4/09 | 24.9 |  |
| 7/4/09 | 24.87 |  |
| 7/4/09 | 24.67 |  |
| 7/4/09 | 24.77 |  |
| 7/4/09 | 24.74 |  |
| 7/4/09 | 24.58 |  |
| 7/4/09 | 24.5 |  |
| 7/4/09 | 24.62 |  |
| 7/4/09 | 24.55 |  |
| 7/4/09 | 24.66 |  |
| 7/4/09 | 24.54 |  |
| 7/4/09 | 24.3 |  |
| 7/4/09 | 24.36 |  |
| 7/4/09 | 24.35 |  |
| 7/4/09 | 24 |  |
| 7/4/09 | 24.16 |  |
| 7/4/09 | 24.13 |  |
| 7/4/09 | 23.92 |  |
| 7/4/09 | 23.89 |  |
| 7/4/09 | 23.58 |  |
| 7/4/09 | 23.57 |  |
| 7/4/09 | 23.61 |  |
| 7/4/09 | 23.58 |  |
| 7/4/09 | 23.57 |  |
| 7/4/09 | 23.57 |  |
| 7/4/09 | 23.57 |  |
| 7/4/09 | 23.54 |  |
| 7/4/09 | 23.54 |  |
| 7/4/09 | 23.55 |  |
| 7/4/09 | 23.57 |  |
| 7/4/09 | 23.59 |  |
| 7/4/09 | 23.63 |  |
| 7/4/09 | 23.66 |  |
| 7/4/09 | 23.69 |  |
| 7/4/09 | 23.73 |  |
| 7/4/09 | 23.76 |  |
| 7/4/09 | 23.8 |  |
| 7/4/09 | 23.84 |  |
| 7/4/09 | 23.89 |  |
| 7/4/09 | 23.94 |  |
| 7/4/09 | 23.99 |  |
| 7/4/09 | 24.03 |  |
| 7/4/09 | 24.09 |  |
| 7/3/09 | 24.14 |  |
| 7/3/09 | 24.19 |  |
| 7/3/09 | 24.23 |  |
| 7/3/09 | 24.28 |  |
| 7/3/09 | 24.32 |  |
| 7/3/09 | 24.34 |  |
| 7/3/09 | 24.38 |  |
| 7/3/09 | 24.42 |  |
| 7/3/09 | 24.38 |  |
| 7/3/09 | 24.26 |  |
| 7/3/09 | 24.19 |  |
| 7/3/09 | 24.2 |  |
| 7/3/09 | 24.12 |  |
| 7/3/09 | 23.94 |  |
| 7/3/09 | 24.09 |  |
| 7/3/09 | 23.93 |  |
| 7/3/09 | 24.17 |  |
| 7/3/09 | 24.06 |  |
| 7/3/09 | 23.98 |  |
| 7/3/09 | 24.04 |  |
| 7/3/09 | 24.06 |  |
| 7/3/09 | 23.91 |  |
| 7/3/09 | 23.76 |  |
| 7/3/09 | 23.79 |  |
| 7/3/09 | 23.79 |  |
| 7/3/09 | 23.81 |  |
| 7/3/09 | 23.85 |  |
| 7/3/09 | 23.84 |  |
| 7/3/09 | 23.83 |  |
| 7/3/09 | 23.83 |  |
| 7/3/09 | 23.86 |  |
| 7/3/09 | 23.89 |  |
| 7/3/09 | 23.92 |  |
| 7/3/09 | 23.95 |  |
| 7/3/09 | 23.98 |  |
| 7/3/09 | 24.03 |  |
| 7/3/09 | 24.06 |  |
| 7/3/09 | 24.1 |  |
| 7/3/09 | 24.13 |  |
| 7/3/09 | 24.17 |  |
| 7/3/09 | 24.19 |  |
| 7/3/09 | 24.23 |  |
| 7/3/09 | 24.28 |  |
| 7/3/09 | 24.31 |  |
| 7/3/09 | 24.34 |  |
| 7/3/09 | 24.37 |  |
| 7/3/09 | 24.4 |  |
| 7/3/09 | 24.44 |  |
| 7/2/09 | 24.47 |  |
| 7/2/09 | 24.49 |  |
| 7/2/09 | 24.53 |  |
| 7/2/09 | 24.54 |  |
| 7/2/09 | 24.58 |  |
| 7/2/09 | 24.61 |  |
| 7/2/09 | 24.64 |  |
| 7/2/09 | 24.67 |  |
| 7/2/09 | 24.73 |  |
| 7/2/09 | 24.79 |  |
| 7/2/09 | 24.85 |  |
| 7/2/09 | 24.91 |  |
| 7/2/09 | 24.92 |  |
| 7/2/09 | 24.88 |  |
| 7/2/09 | 24.86 |  |
| 7/2/09 | 24.86 |  |
| 7/2/09 | 24.88 |  |
| 7/2/09 | 24.91 |  |
| 7/2/09 | 24.9 |  |
| 7/2/09 | 24.81 |  |
| 7/2/09 | 24.84 |  |
| 7/2/09 | 24.9 |  |
| 7/2/09 | 24.86 |  |
| 7/2/09 | 24.82 |  |
| 7/2/09 | 24.83 |  |
| 7/2/09 | 24.8 |  |
| 7/2/09 | 24.78 |  |
| 7/2/09 | 24.76 |  |
| 7/2/09 | 24.78 |  |
| 7/2/09 | 24.78 |  |
| 7/2/09 | 24.79 |  |
| 7/2/09 | 24.8 |  |
| 7/2/09 | 24.82 |  |
| 7/2/09 | 24.84 |  |
| 7/2/09 | 24.88 |  |
| 7/2/09 | 24.9 |  |
| 7/2/09 | 24.94 |  |
| 7/2/09 | 24.98 |  |
| 7/2/09 | 25.01 |  |
| 7/2/09 | 25.06 |  |
| 7/2/09 | 25.11 |  |
| 7/2/09 | 25.16 |  |
| 7/2/09 | 25.21 |  |
| 7/2/09 | 25.27 |  |
| 7/2/09 | 25.34 |  |
| 7/2/09 | 25.4 |  |
| 7/2/09 | 25.46 |  |
| 7/2/09 | 25.53 |  |
| 7/1/09 | 25.59 |  |
| 7/1/09 | 25.65 |  |
| 7/1/09 | 25.69 |  |
| 7/1/09 | 25.69 |  |
| 7/1/09 | 25.71 |  |
| 7/1/09 | 25.6 |  |
| 7/1/09 | 25.69 |  |
| 7/1/09 | 25.6 |  |
| 7/1/09 | 25.48 |  |
| 7/1/09 | 25.52 |  |
| 7/1/09 | 25.52 |  |
| 7/1/09 | 25.46 |  |
| 7/1/09 | 25.34 |  |
| 7/1/09 | 25.51 |  |
| 7/1/09 | 25.42 |  |
| 7/1/09 | 25.35 |  |
| 7/1/09 | 25.26 |  |
| 7/1/09 | 25.29 |  |
| 7/1/09 | 25.08 |  |
| 7/1/09 | 25.08 |  |
| 7/1/09 | 25.06 |  |
| 7/1/09 | 25.1 |  |
| 7/1/09 | 25.19 |  |
| 7/1/09 | 25.08 |  |
| 7/1/09 | 25.05 |  |
| 7/1/09 | 25.08 |  |
| 7/1/09 | 25.01 |  |
| 7/1/09 | 24.94 |  |
| 7/1/09 | 24.91 |  |
| 7/1/09 | 24.9 |  |
| 7/1/09 | 24.92 |  |
| 7/1/09 | 24.92 |  |
| 7/1/09 | 24.93 |  |
| 7/1/09 | 24.95 |  |
| 7/1/09 | 25.01 |  |
| 7/1/09 | 25.03 |  |
| 7/1/09 | 25.06 |  |
| 7/1/09 | 25.08 |  |
| 7/1/09 | 25.13 |  |
| 7/1/09 | 25.18 |  |
| 7/1/09 | 25.2 |  |
| 7/1/09 | 25.24 |  |
| 7/1/09 | 25.27 |  |
| 7/1/09 | 25.31 |  |
| 7/1/09 | 25.36 |  |
| 7/1/09 | 25.42 |  |
| 7/1/09 | 25.45 |  |
| 7/1/09 | 25.49 |  |
| 6/30/09 | 25.54 |  |
| 6/30/09 | 25.58 |  |
| 6/30/09 | 25.63 |  |
| 6/30/09 | 25.7 |  |
| 6/30/09 | 25.77 |  |
| 6/30/09 | 25.81 |  |
| 6/30/09 | 25.86 |  |
| 6/30/09 | 25.92 |  |
| 6/30/09 | 25.97 |  |
| 6/30/09 | 25.98 |  |
| 6/30/09 | 25.94 |  |
| 6/30/09 | 25.98 |  |
| 6/30/09 | 25.9 |  |
| 6/30/09 | 25.98 |  |
| 6/30/09 | 25.91 |  |
| 6/30/09 | 25.87 |  |
| 6/30/09 | 25.83 |  |
| 6/30/09 | 25.82 |  |
| 6/30/09 | 25.73 |  |
| 6/30/09 | 25.71 |  |
| 6/30/09 | 25.76 |  |
| 6/30/09 | 25.68 |  |
| 6/30/09 | 25.7 |  |
| 6/30/09 | 25.63 |  |
| 6/30/09 | 25.59 |  |
| 6/30/09 | 25.61 |  |
| 6/30/09 | 25.58 |  |
| 6/30/09 | 25.56 |  |
| 6/30/09 | 25.54 |  |
| 6/30/09 | 25.54 |  |
| 6/30/09 | 25.53 |  |
| 6/30/09 | 25.54 |  |
| 6/30/09 | 25.58 |  |
| 6/30/09 | 25.61 |  |
| 6/30/09 | 25.66 |  |
| 6/30/09 | 25.71 |  |
| 6/30/09 | 25.76 |  |
| 6/30/09 | 25.82 |  |
| 6/30/09 | 25.9 |  |
| 6/30/09 | 25.94 |  |
| 6/30/09 | 25.99 |  |
| 6/30/09 | 26.04 |  |
| 6/30/09 | 26.09 |  |
| 6/30/09 | 26.13 |  |
| 6/30/09 | 26.18 |  |
| 6/30/09 | 26.23 |  |
| 6/30/09 | 26.3 |  |
| 6/30/09 | 26.37 |  |
| 6/29/09 | 26.45 |  |
| 6/29/09 | 26.52 |  |
| 6/29/09 | 26.58 |  |
| 6/29/09 | 26.62 |  |
| 6/29/09 | 26.61 |  |
| 6/29/09 | 26.63 |  |
| 6/29/09 | 26.63 |  |
| 6/29/09 | 26.55 |  |
| 6/29/09 | 26.53 |  |
| 6/29/09 | 26.48 |  |
| 6/29/09 | 26.53 |  |
| 6/29/09 | 26.36 |  |
| 6/29/09 | 26.17 |  |
| 6/29/09 | 26.25 |  |
| 6/29/09 | 25.97 |  |
| 6/29/09 | 26.05 |  |
| 6/29/09 | 25.95 |  |
| 6/29/09 | 25.95 |  |
| 6/29/09 | 26.04 |  |
| 6/29/09 | 25.81 |  |
| 6/29/09 | 25.71 |  |
| 6/29/09 | 25.69 |  |
| 6/29/09 | 25.71 |  |
| 6/29/09 | 25.72 |  |
| 6/29/09 | 25.78 |  |
| 6/29/09 | 25.63 |  |
| 6/29/09 | 25.62 |  |
| 6/29/09 | 25.6 |  |
| 6/29/09 | 25.54 |  |
| 6/29/09 | 25.5 |  |
| 6/29/09 | 25.49 |  |
| 6/29/09 | 25.51 |  |
| 6/29/09 | 25.51 |  |
| 6/29/09 | 25.53 |  |
| 6/29/09 | 25.56 |  |
| 6/29/09 | 25.62 |  |
| 6/29/09 | 25.66 |  |
| 6/29/09 | 25.73 |  |
| 6/29/09 | 25.78 |  |
| 6/29/09 | 25.87 |  |
| 6/29/09 | 25.94 |  |
| 6/29/09 | 26.01 |  |
| 6/29/09 | 26.07 |  |
| 6/29/09 | 26.13 |  |
| 6/29/09 | 26.21 |  |
| 6/29/09 | 26.28 |  |
| 6/29/09 | 26.34 |  |
| 6/29/09 | 26.4 |  |
| 6/28/09 | 26.47 |  |
| 6/28/09 | 26.56 |  |
| 6/28/09 | 26.64 |  |
| 6/28/09 | 26.72 |  |
| 6/28/09 | 26.78 |  |
| 6/28/09 | 26.81 |  |
| 6/28/09 | 26.83 |  |
| 6/28/09 | 26.85 |  |
| 6/28/09 | 26.81 |  |
| 6/28/09 | 26.74 |  |
| 6/28/09 | 26.67 |  |
| 6/28/09 | 26.75 |  |
| 6/28/09 | 26.79 |  |
| 6/28/09 | 26.71 |  |
| 6/28/09 | 26.65 |  |
| 6/28/09 | 26.5 |  |
| 6/28/09 | 26.46 |  |
| 6/28/09 | 26.52 |  |
| 6/28/09 | 26.52 |  |
| 6/28/09 | 26.61 |  |
| 6/28/09 | 26.62 |  |
| 6/28/09 | 26.56 |  |
| 6/28/09 | 26.55 |  |
| 6/28/09 | 26.53 |  |
| 6/28/09 | 26.45 |  |
| 6/28/09 | 26.38 |  |
| 6/28/09 | 26.35 |  |
| 6/28/09 | 26.33 |  |
| 6/28/09 | 26.31 |  |
| 6/28/09 | 26.28 |  |
| 6/28/09 | 26.3 |  |
| 6/28/09 | 26.33 |  |
| 6/28/09 | 26.38 |  |
| 6/28/09 | 26.42 |  |
| 6/28/09 | 26.47 |  |
| 6/28/09 | 26.54 |  |
| 6/28/09 | 26.58 |  |
| 6/28/09 | 26.65 |  |
| 6/28/09 | 26.72 |  |
| 6/28/09 | 26.79 |  |
| 6/28/09 | 26.87 |  |
| 6/28/09 | 26.95 |  |
| 6/28/09 | 27.03 |  |
| 6/28/09 | 27.13 |  |
| 6/28/09 | 27.22 |  |
| 6/28/09 | 27.34 |  |
| 6/28/09 | 27.46 |  |
| 6/28/09 | 27.56 |  |
| 6/27/09 | 27.66 |  |
| 6/27/09 | 27.77 |  |
| 6/27/09 | 27.86 |  |
| 6/27/09 | 27.76 |  |
| 6/27/09 | 27.67 |  |
| 6/27/09 | 27.6 |  |
| 6/27/09 | 27.53 |  |
| 6/27/09 | 27.41 |  |
| 6/27/09 | 27.35 |  |
| 6/27/09 | 27.39 |  |
| 6/27/09 | 27.42 |  |
| 6/27/09 | 27.39 |  |
| 6/27/09 | 27.21 |  |
| 6/27/09 | 27.36 |  |
| 6/27/09 | 27.26 |  |
| 6/27/09 | 27.19 |  |
| 6/27/09 | 27.08 |  |
| 6/27/09 | 27.08 |  |
| 6/27/09 | 26.98 |  |
| 6/27/09 | 26.84 |  |
| 6/27/09 | 26.7 |  |
| 6/27/09 | 26.69 |  |
| 6/27/09 | 26.54 |  |
| 6/27/09 | 26.49 |  |
| 6/27/09 | 26.52 |  |
| 6/27/09 | 26.45 |  |
| 6/27/09 | 26.28 |  |
| 6/27/09 | 26.2 |  |
| 6/27/09 | 26.16 |  |
| 6/27/09 | 26.17 |  |
| 6/27/09 | 26.16 |  |
| 6/27/09 | 26.15 |  |
| 6/27/09 | 26.15 |  |
| 6/27/09 | 26.18 |  |
| 6/27/09 | 26.22 |  |
| 6/27/09 | 26.29 |  |
| 6/27/09 | 26.35 |  |
| 6/27/09 | 26.44 |  |
| 6/27/09 | 26.5 |  |
| 6/27/09 | 26.58 |  |
| 6/27/09 | 26.65 |  |
| 6/27/09 | 26.72 |  |
| 6/27/09 | 26.8 |  |
| 6/27/09 | 26.88 |  |
| 6/27/09 | 26.97 |  |
| 6/27/09 | 27.05 |  |
| 6/27/09 | 27.11 |  |
| 6/27/09 | 27.18 |  |
| 6/26/09 | 27.26 |  |
| 6/26/09 | 27.35 |  |
| 6/26/09 | 27.45 |  |
| 6/26/09 | 27.54 |  |
| 6/26/09 | 27.6 |  |
| 6/26/09 | 27.68 |  |
| 6/26/09 | 27.72 |  |
| 6/26/09 | 27.68 |  |
| 6/26/09 | 27.71 |  |
| 6/26/09 | 27.56 |  |
| 6/26/09 | 27.72 |  |
| 6/26/09 | 27.65 |  |
| 6/26/09 | 27.59 |  |
| 6/26/09 | 27.52 |  |
| 6/26/09 | 27.49 |  |
| 6/26/09 | 27.5 |  |
| 6/26/09 | 27.52 |  |
| 6/26/09 | 27.38 |  |
| 6/26/09 | 27.34 |  |
| 6/26/09 | 27.26 |  |
| 6/26/09 | 27.3 |  |
| 6/26/09 | 27.26 |  |
| 6/26/09 | 27.2 |  |
| 6/26/09 | 27.11 |  |
| 6/26/09 | 26.98 |  |
| 6/26/09 | 27.23 |  |
| 6/26/09 | 27.2 |  |
| 6/26/09 | 27.23 |  |
| 6/26/09 | 27.23 |  |
| 6/26/09 | 27.23 |  |
| 6/26/09 | 27.25 |  |
| 6/26/09 | 27.27 |  |
| 6/26/09 | 27.31 |  |
| 6/26/09 | 27.36 |  |
| 6/26/09 | 27.42 |  |
| 6/26/09 | 27.48 |  |
| 6/26/09 | 27.55 |  |
| 6/26/09 | 27.62 |  |
| 6/26/09 | 27.68 |  |
| 6/26/09 | 27.67 |  |
| 6/26/09 | 27.66 |  |
| 6/26/09 | 27.79 |  |
| 6/26/09 | 27.76 |  |
| 6/26/09 | 27.64 |  |
| 6/26/09 | 27.62 |  |
| 6/26/09 | 27.82 |  |
| 6/26/09 | 27.85 |  |
| 6/25/09 | 27.8 |  |
| 6/25/09 | 27.63 |  |
| 6/25/09 | 27.87 |  |
| 6/25/09 | 28.19 |  |
| 6/25/09 | 28.39 |  |
| 6/25/09 | 27.97 |  |
| 6/25/09 | 27.79 |  |
| 6/25/09 | 27.69 |  |
| 6/25/09 | 27.71 |  |
| 6/25/09 | 27.68 |  |
| 6/25/09 | 27.65 |  |
| 6/25/09 | 27.57 |  |
| 6/25/09 | 27.6 |  |
| 6/25/09 | 27.58 |  |
| 6/25/09 | 27.47 |  |
| 6/25/09 | 27.45 |  |
| 6/25/09 | 27.37 |  |
| 6/25/09 | 27.25 |  |
| 6/25/09 | 27.18 |  |
| 6/25/09 | 27.06 |  |
| 6/25/09 | 26.95 |  |
| 6/25/09 | 26.9 |  |
| 6/25/09 | 26.8 |  |
| 6/25/09 | 26.84 |  |
| 6/25/09 | 26.74 |  |
| 6/25/09 | 26.61 |  |
| 6/25/09 | 26.52 |  |
| 6/25/09 | 26.52 |  |
| 6/25/09 | 26.5 |  |
| 6/25/09 | 26.44 |  |
| 6/25/09 | 26.39 |  |
| 6/25/09 | 26.36 |  |
| 6/25/09 | 26.39 |  |
| 6/25/09 | 26.43 |  |
| 6/25/09 | 26.48 |  |
| 6/25/09 | 26.54 |  |
| 6/25/09 | 26.62 |  |
| 6/25/09 | 26.71 |  |
| 6/25/09 | 26.8 |  |
| 6/25/09 | 26.88 |  |
| 6/25/09 | 26.96 |  |
| 6/25/09 | 27.05 |  |
| 6/25/09 | 27.12 |  |
| 6/25/09 | 27.2 |  |
| 6/25/09 | 27.28 |  |
| 6/25/09 | 27.26 |  |
| 6/25/09 | 27.19 |  |
| 6/25/09 | 27.07 |  |
| 6/24/09 | 27.06 |  |
| 6/24/09 | 27.09 |  |
| 6/24/09 | 27.09 |  |
| 6/24/09 | 27.12 |  |
| 6/24/09 | 27.16 |  |
| 6/24/09 | 27.22 |  |
| 6/24/09 | 27.16 |  |
| 6/24/09 | 27.13 |  |
| 6/24/09 | 26.99 |  |
| 6/24/09 | 26.87 |  |
| 6/24/09 | 26.85 |  |
| 6/24/09 | 26.94 |  |
| 6/24/09 | 26.79 |  |
| 6/24/09 | 26.74 |  |
| 6/24/09 | 26.58 |  |
| 6/24/09 | 26.66 |  |
| 6/24/09 | 26.72 |  |
| 6/24/09 | 26.47 |  |
| 6/24/09 | 26.42 |  |
| 6/24/09 | 26.32 |  |
| 6/24/09 | 26.23 |  |
| 6/24/09 | 26.27 |  |
| 6/24/09 | 26.1 |  |
| 6/24/09 | 25.98 |  |
| 6/24/09 | 25.91 |  |
| 6/24/09 | 25.83 |  |
| 6/24/09 | 25.74 |  |
| 6/24/09 | 25.68 |  |
| 6/24/09 | 25.64 |  |
| 6/24/09 | 25.6 |  |
| 6/24/09 | 25.54 |  |
| 6/24/09 | 25.51 |  |
| 6/24/09 | 25.49 |  |
| 6/24/09 | 25.53 |  |
| 6/24/09 | 25.58 |  |
| 6/24/09 | 25.65 |  |
| 6/24/09 | 25.72 |  |
| 6/24/09 | 25.78 |  |
| 6/24/09 | 25.85 |  |
| 6/24/09 | 25.94 |  |
| 6/24/09 | 26.03 |  |
| 6/24/09 | 26.1 |  |
| 6/24/09 | 26.21 |  |
| 6/24/09 | 26.32 |  |
| 6/24/09 | 26.42 |  |
| 6/24/09 | 26.52 |  |
| 6/24/09 | 26.61 |  |
| 6/24/09 | 26.71 |  |
| 6/23/09 | 26.8 |  |
| 6/23/09 | 26.87 |  |
| 6/23/09 | 26.88 |  |
| 6/23/09 | 26.89 |  |
| 6/23/09 | 26.8 |  |
| 6/23/09 | 26.78 |  |
| 6/23/09 | 26.75 |  |
| 6/23/09 | 26.55 |  |
| 6/23/09 | 26.42 |  |
| 6/23/09 | 26.42 |  |
| 6/23/09 | 26.38 |  |
| 6/23/09 | 26.59 |  |
| 6/23/09 | 26.41 |  |
| 6/23/09 | 26.37 |  |
| 6/23/09 | 26.16 |  |
| 6/23/09 | 26.18 |  |
| 6/23/09 | 26.05 |  |
| 6/23/09 | 25.79 |  |
| 6/23/09 | 26.02 |  |
| 6/23/09 | 25.95 |  |
| 6/23/09 | 26.07 |  |
| 6/23/09 | 25.97 |  |
| 6/23/09 | 25.79 |  |
| 6/23/09 | 25.74 |  |
| 6/23/09 | 25.52 |  |
| 6/23/09 | 25.3 |  |
| 6/23/09 | 25.2 |  |
| 6/23/09 | 25.15 |  |
| 6/23/09 | 25.11 |  |
| 6/23/09 | 25.08 |  |
| 6/23/09 | 25.05 |  |
| 6/23/09 | 25.01 |  |
| 6/23/09 | 24.99 |  |
| 6/23/09 | 25.03 |  |
| 6/23/09 | 25.07 |  |
| 6/23/09 | 25.14 |  |
| 6/23/09 | 25.19 |  |
| 6/23/09 | 25.26 |  |
| 6/23/09 | 25.34 |  |
| 6/23/09 | 25.41 |  |
| 6/23/09 | 25.51 |  |
| 6/23/09 | 25.59 |  |
| 6/23/09 | 25.65 |  |
| 6/23/09 | 25.75 |  |
| 6/23/09 | 25.84 |  |
| 6/23/09 | 25.91 |  |
| 6/23/09 | 26 |  |
| 6/23/09 | 26.06 |  |
| 6/22/09 | 26.04 |  |
| 6/22/09 | 25.88 |  |
| 6/22/09 | 25.88 |  |
| 6/22/09 | 25.87 |  |
| 6/22/09 | 25.86 |  |
| 6/22/09 | 25.86 |  |
| 6/22/09 | 25.88 |  |
| 6/22/09 | 25.77 |  |
| 6/22/09 | 25.66 |  |
| 6/22/09 | 25.7 |  |
| 6/22/09 | 25.62 |  |
| 6/22/09 | 25.58 |  |
| 6/22/09 | 25.71 |  |
| 6/22/09 | 25.71 |  |
| 6/22/09 | 25.53 |  |
| 6/22/09 | 25.38 |  |
| 6/22/09 | 25.26 |  |
| 6/22/09 | 25.11 |  |
| 6/22/09 | 24.89 |  |
| 6/22/09 | 24.87 |  |
| 6/22/09 | 24.78 |  |
| 6/22/09 | 24.8 |  |
| 6/22/09 | 24.74 |  |
| 6/22/09 | 24.65 |  |
| 6/22/09 | 24.57 |  |
| 6/22/09 | 24.54 |  |
| 6/22/09 | 24.49 |  |
| 6/22/09 | 24.48 |  |
| 6/22/09 | 24.47 |  |
| 6/22/09 | 24.47 |  |
| 6/22/09 | 24.47 |  |
| 6/22/09 | 24.49 |  |
| 6/22/09 | 24.51 |  |
| 6/22/09 | 24.52 |  |
| 6/22/09 | 24.57 |  |
| 6/22/09 | 24.61 |  |
| 6/22/09 | 24.66 |  |
| 6/22/09 | 24.72 |  |
| 6/22/09 | 24.79 |  |
| 6/22/09 | 24.84 |  |
| 6/22/09 | 24.92 |  |
| 6/22/09 | 24.98 |  |
| 6/22/09 | 25.05 |  |
| 6/22/09 | 25.11 |  |
| 6/22/09 | 25.19 |  |
| 6/22/09 | 25.26 |  |
| 6/22/09 | 25.32 |  |
| 6/22/09 | 25.4 |  |
| 6/21/09 | 25.44 |  |
| 6/21/09 | 25.5 |  |
| 6/21/09 | 25.55 |  |
| 6/21/09 | 25.5 |  |
| 6/21/09 | 25.59 |  |
| 6/21/09 | 25.42 |  |
| 6/21/09 | 25.29 |  |
| 6/21/09 | 25.18 |  |
| 6/21/09 | 25.15 |  |
| 6/21/09 | 25.09 |  |
| 6/21/09 | 25.06 |  |
| 6/21/09 | 25.01 |  |
| 6/21/09 | 25.03 |  |
| 6/21/09 | 24.99 |  |
| 6/21/09 | 24.93 |  |
| 6/21/09 | 25.06 |  |
| 6/21/09 | 24.97 |  |
| 6/21/09 | 24.87 |  |
| 6/21/09 | 24.75 |  |
| 6/21/09 | 24.67 |  |
| 6/21/09 | 24.55 |  |
| 6/21/09 | 24.42 |  |
| 6/21/09 | 24.41 |  |
| 6/21/09 | 24.34 |  |
| 6/21/09 | 24.23 |  |
| 6/21/09 | 24.21 |  |
| 6/21/09 | 24.22 |  |
| 6/21/09 | 24.2 |  |
| 6/21/09 | 24.18 |  |
| 6/21/09 | 24.14 |  |
| 6/21/09 | 24.13 |  |
| 6/21/09 | 24.18 |  |
| 6/21/09 | 24.21 |  |
| 6/21/09 | 24.23 |  |
| 6/21/09 | 24.26 |  |
| 6/21/09 | 24.3 |  |
| 6/21/09 | 24.33 |  |
| 6/21/09 | 24.37 |  |
| 6/21/09 | 24.41 |  |
| 6/21/09 | 24.46 |  |
| 6/21/09 | 24.54 |  |
| 6/21/09 | 24.58 |  |
| 6/21/09 | 24.62 |  |
| 6/21/09 | 24.65 |  |
| 6/21/09 | 24.68 |  |
| 6/21/09 | 24.73 |  |
| 6/21/09 | 24.78 |  |
| 6/21/09 | 24.86 |  |
| 6/20/09 | 24.91 |  |
| 6/20/09 | 24.92 |  |
| 6/20/09 | 24.98 |  |
| 6/20/09 | 25.02 |  |
| 6/20/09 | 25.05 |  |
| 6/20/09 | 25.08 |  |
| 6/20/09 | 25.05 |  |
| 6/20/09 | 25.04 |  |
| 6/20/09 | 25 |  |
| 6/20/09 | 24.82 |  |
| 6/20/09 | 24.73 |  |
| 6/20/09 | 24.9 |  |
| 6/20/09 | 24.69 |  |
| 6/20/09 | 24.66 |  |
| 6/20/09 | 24.74 |  |
| 6/20/09 | 24.68 |  |
| 6/20/09 | 24.51 |  |
| 6/20/09 | 24.51 |  |
| 6/20/09 | 24.44 |  |
| 6/20/09 | 24.43 |  |
| 6/20/09 | 24.32 |  |
| 6/20/09 | 24.26 |  |
| 6/20/09 | 24.17 |  |
| 6/20/09 | 24.09 |  |
| 6/20/09 | 24.02 |  |
| 6/20/09 | 23.92 |  |
| 6/20/09 | 23.95 |  |
| 6/20/09 | 23.98 |  |
| 6/20/09 | 24.01 |  |
| 6/20/09 | 24.06 |  |
| 6/20/09 | 24.07 |  |
| 6/20/09 | 24.03 |  |
| 6/20/09 | 24.04 |  |
| 6/20/09 | 23.98 |  |
| 6/20/09 | 23.94 |  |
| 6/20/09 | 23.88 |  |
| 6/20/09 | 24.05 |  |
| 6/20/09 | 24.14 |  |
| 6/20/09 | 24.13 |  |
| 6/20/09 | 24.05 |  |
| 6/20/09 | 24.08 |  |
| 6/20/09 | 24.07 |  |
| 6/20/09 | 24.02 |  |
| 6/20/09 | 24.02 |  |
| 6/20/09 | 23.99 |  |
| 6/20/09 | 24 |  |
| 6/20/09 | 23.98 |  |
| 6/20/09 | 23.97 |  |
| 6/19/09 | 24 |  |
| 6/19/09 | 24.02 |  |
| 6/19/09 | 24.08 |  |
| 6/19/09 | 24.22 |  |
| 6/19/09 | 24.27 |  |
| 6/19/09 | 24.19 |  |
| 6/19/09 | 24.12 |  |
| 6/19/09 | 24.07 |  |
| 6/19/09 | 24 |  |
| 6/19/09 | 23.99 |  |
| 6/19/09 | 24.01 |  |
| 6/19/09 | 23.88 |  |
| 6/19/09 | 23.91 |  |
| 6/19/09 | 23.96 |  |
| 6/19/09 | 23.89 |  |
| 6/19/09 | 23.93 |  |
| 6/19/09 | 23.94 |  |
| 6/19/09 | 23.82 |  |
| 6/19/09 | 23.67 |  |
| 6/19/09 | 23.55 |  |
| 6/19/09 | 23.5 |  |
| 6/19/09 | 23.41 |  |
| 6/19/09 | 23.37 |  |
| 6/19/09 | 23.37 |  |
| 6/19/09 | 23.33 |  |
| 6/19/09 | 23.32 |  |
| 6/19/09 | 23.31 |  |
| 6/19/09 | 23.31 |  |
| 6/19/09 | 23.32 |  |
| 6/19/09 | 23.33 |  |
| 6/19/09 | 23.34 |  |
| 6/19/09 | 23.36 |  |
| 6/19/09 | 23.38 |  |
| 6/19/09 | 23.4 |  |
| 6/19/09 | 23.43 |  |
| 6/19/09 | 23.45 |  |
| 6/19/09 | 23.48 |  |
| 6/19/09 | 23.51 |  |
| 6/19/09 | 23.54 |  |
| 6/19/09 | 23.57 |  |
| 6/19/09 | 23.6 |  |
| 6/19/09 | 23.65 |  |
| 6/19/09 | 23.68 |  |
| 6/19/09 | 23.71 |  |
| 6/19/09 | 23.76 |  |
| 6/19/09 | 23.8 |  |
| 6/19/09 | 23.83 |  |
| 6/19/09 | 23.87 |  |
| 6/18/09 | 23.91 |  |
| 6/18/09 | 23.95 |  |
| 6/18/09 | 24 |  |
| 6/18/09 | 24.06 |  |
| 6/18/09 | 24.1 |  |
| 6/18/09 | 24.14 |  |
| 6/18/09 | 24.19 |  |
| 6/18/09 | 24.2 |  |
| 6/18/09 | 24.15 |  |
| 6/18/09 | 24.05 |  |
| 6/18/09 | 24.04 |  |
| 6/18/09 | 24.06 |  |
| 6/18/09 | 24.03 |  |
| 6/18/09 | 24 |  |
| 6/18/09 | 24 |  |
| 6/18/09 | 23.94 |  |
| 6/18/09 | 23.94 |  |
| 6/18/09 | 23.94 |  |
| 6/18/09 | 24.01 |  |
| 6/18/09 | 24.03 |  |
| 6/18/09 | 23.92 |  |
| 6/18/09 | 23.76 |  |
| 6/18/09 | 23.8 |  |
| 6/18/09 | 23.82 |  |
| 6/18/09 | 23.79 |  |
| 6/18/09 | 23.77 |  |
| 6/18/09 | 23.74 |  |
| 6/18/09 | 23.73 |  |
| 6/18/09 | 23.73 |  |
| 6/18/09 | 23.75 |  |
| 6/18/09 | 23.76 |  |
| 6/18/09 | 23.77 |  |
| 6/18/09 | 23.77 |  |
| 6/18/09 | 23.79 |  |
| 6/18/09 | 23.8 |  |
| 6/18/09 | 23.8 |  |
| 6/18/09 | 23.85 |  |
| 6/18/09 | 23.87 |  |
| 6/18/09 | 23.91 |  |
| 6/18/09 | 23.93 |  |
| 6/18/09 | 23.95 |  |
| 6/18/09 | 23.97 |  |
| 6/18/09 | 23.99 |  |
| 6/18/09 | 24.01 |  |
| 6/18/09 | 24.04 |  |
| 6/18/09 | 24.08 |  |
| 6/18/09 | 24.1 |  |
| 6/18/09 | 24.13 |  |
| 6/17/09 | 24.15 |  |
| 6/17/09 | 24.18 |  |
| 6/17/09 | 24.21 |  |
| 6/17/09 | 24.25 |  |
| 6/17/09 | 24.27 |  |
| 6/17/09 | 24.33 |  |
| 6/17/09 | 24.36 |  |
| 6/17/09 | 24.39 |  |
| 6/17/09 | 24.42 |  |
| 6/17/09 | 24.45 |  |
| 6/17/09 | 24.48 |  |
| 6/17/09 | 24.51 |  |
| 6/17/09 | 24.54 |  |
| 6/17/09 | 24.53 |  |
| 6/17/09 | 24.51 |  |
| 6/17/09 | 24.43 |  |
| 6/17/09 | 24.43 |  |
| 6/17/09 | 24.48 |  |
| 6/17/09 | 24.51 |  |
| 6/17/09 | 24.52 |  |
| 6/17/09 | 24.57 |  |
| 6/17/09 | 24.62 |  |
| 6/17/09 | 24.65 |  |
| 6/17/09 | 24.64 |  |
| 6/17/09 | 24.69 |  |
| 6/17/09 | 24.74 |  |
| 6/17/09 | 24.8 |  |
| 6/17/09 | 24.85 |  |
| 6/17/09 | 24.9 |  |
| 6/17/09 | 24.92 |  |
| 6/17/09 | 24.96 |  |
| 6/17/09 | 25.01 |  |
| 6/17/09 | 25.06 |  |
| 6/17/09 | 25.12 |  |
| 6/17/09 | 25.16 |  |
| 6/17/09 | 25.27 |  |
| 6/17/09 | 25.34 |  |
| 6/17/09 | 25.43 |  |
| 6/17/09 | 25.48 |  |
| 6/17/09 | 25.53 |  |
| 6/17/09 | 25.57 |  |
| 6/17/09 | 25.6 |  |
| 6/17/09 | 25.65 |  |
| 6/17/09 | 25.71 |  |
| 6/17/09 | 25.76 |  |
| 6/17/09 | 25.81 |  |
| 6/17/09 | 25.86 |  |
| 6/17/09 | 25.91 |  |
| 6/16/09 | 25.98 |  |
| 6/16/09 | 26.04 |  |
| 6/16/09 | 26.07 |  |
| 6/16/09 | 26.07 |  |
| 6/16/09 | 26.11 |  |
| 6/16/09 | 26.16 |  |
| 6/16/09 | 26.25 |  |
| 6/16/09 | 26.21 |  |
| 6/16/09 | 26.21 |  |
| 6/16/09 | 26.26 |  |
| 6/16/09 | 26.34 |  |
| 6/16/09 | 26.38 |  |
| 6/16/09 | 26.41 |  |
| 6/16/09 | 26.36 |  |
| 6/16/09 | 26.26 |  |
| 6/16/09 | 26.2 |  |
| 6/16/09 | 26.12 |  |
| 6/16/09 | 25.93 |  |
| 6/16/09 | 25.82 |  |
| 6/16/09 | 25.77 |  |
| 6/16/09 | 25.61 |  |
| 6/16/09 | 25.48 |  |
| 6/16/09 | 25.31 |  |
| 6/16/09 | 25.19 |  |
| 6/16/09 | 25.05 |  |
| 6/16/09 | 24.89 |  |
| 6/16/09 | 24.79 |  |
| 6/16/09 | 24.68 |  |
| 6/16/09 | 24.61 |  |
| 6/16/09 | 24.55 |  |
| 6/16/09 | 24.55 |  |
| 6/16/09 | 24.53 |  |
| 6/16/09 | 24.54 |  |
| 6/16/09 | 24.58 |  |
| 6/16/09 | 24.63 |  |
| 6/16/09 | 24.69 |  |
| 6/16/09 | 24.76 |  |
| 6/16/09 | 24.83 |  |
| 6/16/09 | 24.91 |  |
| 6/16/09 | 24.99 |  |
| 6/16/09 | 25.07 |  |
| 6/16/09 | 25.15 |  |
| 6/16/09 | 25.24 |  |
| 6/16/09 | 25.35 |  |
| 6/16/09 | 25.43 |  |
| 6/16/09 | 25.54 |  |
| 6/16/09 | 25.62 |  |
| 6/16/09 | 25.7 |  |
| 6/15/09 | 25.73 |  |
| 6/15/09 | 25.79 |  |
| 6/15/09 | 25.69 |  |
| 6/15/09 | 25.63 |  |
| 6/15/09 | 25.65 |  |
| 6/15/09 | 25.62 |  |
| 6/15/09 | 25.63 |  |
| 6/15/09 | 25.62 |  |
| 6/15/09 | 25.56 |  |
| 6/15/09 | 25.53 |  |
| 6/15/09 | 25.51 |  |
| 6/15/09 | 25.45 |  |
| 6/15/09 | 25.46 |  |
| 6/15/09 | 25.57 |  |
| 6/15/09 | 25.29 |  |
| 6/15/09 | 25.28 |  |
| 6/15/09 | 25.31 |  |
| 6/15/09 | 25.38 |  |
| 6/15/09 | 25.19 |  |
| 6/15/09 | 25.31 |  |
| 6/15/09 | 25.3 |  |
| 6/15/09 | 25.18 |  |
| 6/15/09 | 24.95 |  |
| 6/15/09 | 24.83 |  |
| 6/15/09 | 24.54 |  |
| 6/15/09 | 24.4 |  |
| 6/15/09 | 24.3 |  |
| 6/15/09 | 24.28 |  |
| 6/15/09 | 24.23 |  |
| 6/15/09 | 24.17 |  |
| 6/15/09 | 24.12 |  |
| 6/15/09 | 24.12 |  |
| 6/15/09 | 24.13 |  |
| 6/15/09 | 24.17 |  |
| 6/15/09 | 24.24 |  |
| 6/15/09 | 24.29 |  |
| 6/15/09 | 24.36 |  |
| 6/15/09 | 24.44 |  |
| 6/15/09 | 24.52 |  |
| 6/15/09 | 24.6 |  |
| 6/15/09 | 24.68 |  |
| 6/15/09 | 24.77 |  |
| 6/15/09 | 24.85 |  |
| 6/15/09 | 24.93 |  |
| 6/15/09 | 25.04 |  |
| 6/15/09 | 25.12 |  |
| 6/15/09 | 25.22 |  |
| 6/15/09 | 25.33 |  |
| 6/14/09 | 25.38 |  |
| 6/14/09 | 25.29 |  |
| 6/14/09 | 25.29 |  |
| 6/14/09 | 25.39 |  |
| 6/14/09 | 25.43 |  |
| 6/14/09 | 25.5 |  |
| 6/14/09 | 25.42 |  |
| 6/14/09 | 25.28 |  |
| 6/14/09 | 25.21 |  |
| 6/14/09 | 24.99 |  |
| 6/14/09 | 24.99 |  |
| 6/14/09 | 25.05 |  |
| 6/14/09 | 24.87 |  |
| 6/14/09 | 24.74 |  |
| 6/14/09 | 24.69 |  |
| 6/14/09 | 24.68 |  |
| 6/14/09 | 24.68 |  |
| 6/14/09 | 24.55 |  |
| 6/14/09 | 24.77 |  |
| 6/14/09 | 24.74 |  |
| 6/14/09 | 24.36 |  |
| 6/14/09 | 24.47 |  |
| 6/14/09 | 24.43 |  |
| 6/14/09 | 24.21 |  |
| 6/14/09 | 24 |  |
| 6/14/09 | 23.85 |  |
| 6/14/09 | 23.69 |  |
| 6/14/09 | 23.62 |  |
| 6/14/09 | 23.58 |  |
| 6/14/09 | 23.54 |  |
| 6/14/09 | 23.51 |  |
| 6/14/09 | 23.51 |  |
| 6/14/09 | 23.52 |  |
| 6/14/09 | 23.55 |  |
| 6/14/09 | 23.59 |  |
| 6/14/09 | 23.63 |  |
| 6/14/09 | 23.67 |  |
| 6/14/09 | 23.74 |  |
| 6/14/09 | 23.79 |  |
| 6/14/09 | 23.84 |  |
| 6/14/09 | 23.89 |  |
| 6/14/09 | 23.96 |  |
| 6/14/09 | 24.02 |  |
| 6/14/09 | 24.07 |  |
| 6/14/09 | 24.12 |  |
| 6/14/09 | 24.19 |  |
| 6/14/09 | 24.27 |  |
| 6/14/09 | 24.34 |  |
| 6/13/09 | 24.4 |  |
| 6/13/09 | 24.45 |  |
| 6/13/09 | 24.54 |  |
| 6/13/09 | 24.72 |  |
| 6/13/09 | 24.75 |  |
| 6/13/09 | 24.74 |  |
| 6/13/09 | 24.75 |  |
| 6/13/09 | 24.67 |  |
| 6/13/09 | 24.58 |  |
| 6/13/09 | 24.73 |  |
| 6/13/09 | 24.73 |  |
| 6/13/09 | 24.44 |  |
| 6/13/09 | 24.53 |  |
| 6/13/09 | 24.61 |  |
| 6/13/09 | 24.5 |  |
| 6/13/09 | 24.44 |  |
| 6/13/09 | 24.36 |  |
| 6/13/09 | 24.43 |  |
| 6/13/09 | 24.32 |  |
| 6/13/09 | 24.28 |  |
| 6/13/09 | 24.15 |  |
| 6/13/09 | 24.14 |  |
| 6/13/09 | 24.15 |  |
| 6/13/09 | 24.16 |  |
| 6/13/09 | 23.99 |  |
| 6/13/09 | 23.94 |  |
| 6/13/09 | 23.88 |  |
| 6/13/09 | 23.79 |  |
| 6/13/09 | 23.73 |  |
| 6/13/09 | 23.71 |  |
| 6/13/09 | 23.68 |  |
| 6/13/09 | 23.66 |  |
| 6/13/09 | 23.66 |  |
| 6/13/09 | 23.67 |  |
| 6/13/09 | 23.7 |  |
| 6/13/09 | 23.74 |  |
| 6/13/09 | 23.78 |  |
| 6/13/09 | 23.83 |  |
| 6/13/09 | 23.87 |  |
| 6/13/09 | 23.91 |  |
| 6/13/09 | 23.95 |  |
| 6/13/09 | 24 |  |
| 6/13/09 | 24.04 |  |
| 6/13/09 | 24.09 |  |
| 6/13/09 | 24.14 |  |
| 6/13/09 | 24.18 |  |
| 6/13/09 | 24.22 |  |
| 6/13/09 | 24.27 |  |
| 6/12/09 | 24.31 |  |
| 6/12/09 | 24.36 |  |
| 6/12/09 | 24.4 |  |
| 6/12/09 | 24.43 |  |
| 6/12/09 | 24.46 |  |
| 6/12/09 | 24.47 |  |
| 6/12/09 | 24.45 |  |
| 6/12/09 | 24.39 |  |
| 6/12/09 | 24.38 |  |
| 6/12/09 | 24.38 |  |
| 6/12/09 | 24.35 |  |
| 6/12/09 | 24.33 |  |
| 6/12/09 | 24.33 |  |
| 6/12/09 | 24.3 |  |
| 6/12/09 | 24.28 |  |
| 6/12/09 | 24.26 |  |
| 6/12/09 | 24.21 |  |
| 6/12/09 | 24.17 |  |
| 6/12/09 | 24.19 |  |
| 6/12/09 | 24.19 |  |
| 6/12/09 | 24.14 |  |
| 6/12/09 | 24.12 |  |
| 6/12/09 | 24.1 |  |
| 6/12/09 | 24.1 |  |
| 6/12/09 | 24.11 |  |
| 6/12/09 | 24.11 |  |
| 6/12/09 | 24.11 |  |
| 6/12/09 | 24.12 |  |
| 6/12/09 | 24.14 |  |
| 6/12/09 | 24.16 |  |
| 6/12/09 | 24.18 |  |
| 6/12/09 | 24.19 |  |
| 6/12/09 | 24.23 |  |
| 6/12/09 | 24.25 |  |
| 6/12/09 | 24.28 |  |
| 6/12/09 | 24.31 |  |
| 6/12/09 | 24.34 |  |
| 6/12/09 | 24.37 |  |
| 6/12/09 | 24.41 |  |
| 6/12/09 | 24.43 |  |
| 6/12/09 | 24.46 |  |
| 6/12/09 | 24.49 |  |
| 6/12/09 | 24.52 |  |
| 6/12/09 | 24.56 |  |
| 6/12/09 | 24.59 |  |
| 6/12/09 | 24.61 |  |
| 6/12/09 | 24.64 |  |
| 6/12/09 | 24.67 |  |
| 6/11/09 | 24.69 |  |
| 6/11/09 | 24.72 |  |
| 6/11/09 | 24.76 |  |
| 6/11/09 | 24.79 |  |
| 6/11/09 | 24.83 |  |
| 6/11/09 | 24.87 |  |
| 6/11/09 | 24.91 |  |
| 6/11/09 | 24.94 |  |
| 6/11/09 | 24.97 |  |
| 6/11/09 | 24.97 |  |
| 6/11/09 | 24.97 |  |
| 6/11/09 | 25 |  |
| 6/11/09 | 25 |  |
| 6/11/09 | 24.99 |  |
| 6/11/09 | 24.95 |  |
| 6/11/09 | 25 |  |
| 6/11/09 | 24.93 |  |
| 6/11/09 | 24.9 |  |
| 6/11/09 | 24.93 |  |
| 6/11/09 | 24.87 |  |
| 6/11/09 | 24.85 |  |
| 6/11/09 | 24.81 |  |
| 6/11/09 | 24.74 |  |
| 6/11/09 | 24.7 |  |
| 6/11/09 | 24.66 |  |
| 6/11/09 | 24.64 |  |
| 6/11/09 | 24.62 |  |
| 6/11/09 | 24.61 |  |
| 6/11/09 | 24.59 |  |
| 6/11/09 | 24.57 |  |
| 6/11/09 | 24.57 |  |
| 6/11/09 | 24.57 |  |
| 6/11/09 | 24.57 |  |
| 6/11/09 | 24.58 |  |
| 6/11/09 | 24.61 |  |
| 6/11/09 | 24.64 |  |
| 6/11/09 | 24.68 |  |
| 6/11/09 | 24.72 |  |
| 6/11/09 | 24.76 |  |
| 6/11/09 | 24.8 |  |
| 6/11/09 | 24.84 |  |
| 6/11/09 | 24.87 |  |
| 6/11/09 | 24.91 |  |
| 6/11/09 | 24.99 |  |
| 6/11/09 | 25.06 |  |
| 6/11/09 | 25.1 |  |
| 6/11/09 | 25.14 |  |
| 6/11/09 | 25.19 |  |
| 6/10/09 | 25.23 |  |
| 6/10/09 | 25.27 |  |
| 6/10/09 | 25.27 |  |
| 6/10/09 | 25.23 |  |
| 6/10/09 | 25.22 |  |
| 6/10/09 | 25.2 |  |
| 6/10/09 | 25.2 |  |
| 6/10/09 | 25.2 |  |
| 6/10/09 | 25.19 |  |
| 6/10/09 | 25.2 |  |
| 6/10/09 | 25.21 |  |
| 6/10/09 | 25.18 |  |
| 6/10/09 | 25.18 |  |
| 6/10/09 | 25.1 |  |
| 6/10/09 | 25.08 |  |
| 6/10/09 | 25.09 |  |
| 6/10/09 | 25.06 |  |
| 6/10/09 | 25.02 |  |
| 6/10/09 | 25 |  |
| 6/10/09 | 25.02 |  |
| 6/10/09 | 25.02 |  |
| 6/10/09 | 25.02 |  |
| 6/10/09 | 24.98 |  |
| 6/10/09 | 24.9 |  |
| 6/10/09 | 24.85 |  |
| 6/10/09 | 24.83 |  |
| 6/10/09 | 24.81 |  |
| 6/10/09 | 24.77 |  |
| 6/10/09 | 24.72 |  |
| 6/10/09 | 24.67 |  |
| 6/10/09 | 24.66 |  |
| 6/10/09 | 24.67 |  |
| 6/10/09 | 24.71 |  |
| 6/10/09 | 24.73 |  |
| 6/10/09 | 24.78 |  |
| 6/10/09 | 24.83 |  |
| 6/10/09 | 24.89 |  |
| 6/10/09 | 24.95 |  |
| 6/10/09 | 25.02 |  |
| 6/10/09 | 25.08 |  |
| 6/10/09 | 25.15 |  |
| 6/10/09 | 25.23 |  |
| 6/10/09 | 25.3 |  |
| 6/10/09 | 25.37 |  |
| 6/10/09 | 25.44 |  |
| 6/10/09 | 25.53 |  |
| 6/10/09 | 25.6 |  |
| 6/10/09 | 25.67 |  |
| 6/9/09 | 25.73 |  |
| 6/9/09 | 25.77 |  |
| 6/9/09 | 25.81 |  |
| 6/9/09 | 25.81 |  |
| 6/9/09 | 25.81 |  |
| 6/9/09 | 25.72 |  |
| 6/9/09 | 25.67 |  |
| 6/9/09 | 25.63 |  |
| 6/9/09 | 25.46 |  |
| 6/9/09 | 25.4 |  |
| 6/9/09 | 25.34 |  |
| 6/9/09 | 25.17 |  |
| 6/9/09 | 25.21 |  |
| 6/9/09 | 25.35 |  |
| 6/9/09 | 25.16 |  |
| 6/9/09 | 25.02 |  |
| 6/9/09 | 24.83 |  |
| 6/9/09 | 24.64 |  |
| 6/9/09 | 24.38 |  |
| 6/9/09 | 24.39 |  |
| 6/9/09 | 24.29 |  |
| 6/9/09 | 24.34 |  |
| 6/9/09 | 24.33 |  |
| 6/9/09 | 24.22 |  |
| 6/9/09 | 24.24 |  |
| 6/9/09 | 24.19 |  |
| 6/9/09 | 24.21 |  |
| 6/9/09 | 24.13 |  |
| 6/9/09 | 24.13 |  |
| 6/9/09 | 24.13 |  |
| 6/9/09 | 24.13 |  |
| 6/9/09 | 24.13 |  |
| 6/9/09 | 24.12 |  |
| 6/9/09 | 24.13 |  |
| 6/9/09 | 24.14 |  |
| 6/9/09 | 24.2 |  |
| 6/9/09 | 24.24 |  |
| 6/9/09 | 24.31 |  |
| 6/9/09 | 24.36 |  |
| 6/9/09 | 24.41 |  |
| 6/9/09 | 24.44 |  |
| 6/9/09 | 24.45 |  |
| 6/9/09 | 24.43 |  |
| 6/9/09 | 24.38 |  |
| 6/9/09 | 24.33 |  |
| 6/9/09 | 24.36 |  |
| 6/9/09 | 24.37 |  |
| 6/9/09 | 24.36 |  |
| 6/8/09 | 24.4 |  |
| 6/8/09 | 24.45 |  |
| 6/8/09 | 24.49 |  |
| 6/8/09 | 24.43 |  |
| 6/8/09 | 24.48 |  |
| 6/8/09 | 24.54 |  |
| 6/8/09 | 24.59 |  |
| 6/8/09 | 24.59 |  |
| 6/8/09 | 24.53 |  |
| 6/8/09 | 24.44 |  |
| 6/8/09 | 24.35 |  |
| 6/8/09 | 24.37 |  |
| 6/8/09 | 24.47 |  |
| 6/8/09 | 24.35 |  |
| 6/8/09 | 24.23 |  |
| 6/8/09 | 24.19 |  |
| 6/8/09 | 24.34 |  |
| 6/8/09 | 24.3 |  |
| 6/8/09 | 24.17 |  |
| 6/8/09 | 23.98 |  |
| 6/8/09 | 23.84 |  |
| 6/8/09 | 23.84 |  |
| 6/8/09 | 23.9 |  |
| 6/8/09 | 23.83 |  |
| 6/8/09 | 23.78 |  |
| 6/8/09 | 23.73 |  |
| 6/8/09 | 23.6 |  |
| 6/8/09 | 23.53 |  |
| 6/8/09 | 23.48 |  |
| 6/8/09 | 23.45 |  |
| 6/8/09 | 23.47 |  |
| 6/8/09 | 23.46 |  |
| 6/8/09 | 23.46 |  |
| 6/8/09 | 23.49 |  |
| 6/8/09 | 23.52 |  |
| 6/8/09 | 23.53 |  |
| 6/8/09 | 23.55 |  |
| 6/8/09 | 23.58 |  |
| 6/8/09 | 23.51 |  |
| 6/8/09 | 23.54 |  |
| 6/8/09 | 23.58 |  |
| 6/8/09 | 23.6 |  |
| 6/8/09 | 23.65 |  |
| 6/8/09 | 23.68 |  |
| 6/8/09 | 23.68 |  |
| 6/8/09 | 23.68 |  |
| 6/8/09 | 23.68 |  |
| 6/8/09 | 23.61 |  |
| 6/7/09 | 23.53 |  |
| 6/7/09 | 23.7 |  |
| 6/7/09 | 23.9 |  |
| 6/7/09 | 23.87 |  |
| 6/7/09 | 23.9 |  |
| 6/7/09 | 23.81 |  |
| 6/7/09 | 23.61 |  |
| 6/7/09 | 23.5 |  |
| 6/7/09 | 23.43 |  |
| 6/7/09 | 23.52 |  |
| 6/7/09 | 23.4 |  |
| 6/7/09 | 23.38 |  |
| 6/7/09 | 23.34 |  |
| 6/7/09 | 23.34 |  |
| 6/7/09 | 23.29 |  |
| 6/7/09 | 23.31 |  |
| 6/7/09 | 23.23 |  |
| 6/7/09 | 23.08 |  |
| 6/7/09 | 22.92 |  |
| 6/7/09 | 22.88 |  |
| 6/7/09 | 22.85 |  |
| 6/7/09 | 22.73 |  |
| 6/7/09 | 22.77 |  |
| 6/7/09 | 22.65 |  |
| 6/7/09 | 22.53 |  |
| 6/7/09 | 22.43 |  |
| 6/7/09 | 22.35 |  |
| 6/7/09 | 22.31 |  |
| 6/7/09 | 22.27 |  |
| 6/7/09 | 22.27 |  |
| 6/7/09 | 22.28 |  |
| 6/7/09 | 22.27 |  |
| 6/7/09 | 22.29 |  |
| 6/7/09 | 22.32 |  |
| 6/7/09 | 22.36 |  |
| 6/7/09 | 22.39 |  |
| 6/7/09 | 22.44 |  |
| 6/7/09 | 22.52 |  |
| 6/7/09 | 22.59 |  |
| 6/7/09 | 22.65 |  |
| 6/7/09 | 22.67 |  |
| 6/7/09 | 22.63 |  |
| 6/7/09 | 22.52 |  |
| 6/7/09 | 22.48 |  |
| 6/7/09 | 22.48 |  |
| 6/7/09 | 22.43 |  |
| 6/7/09 | 22.44 |  |
| 6/7/09 | 22.41 |  |
| 6/6/09 | 22.37 |  |
| 6/6/09 | 22.39 |  |
| 6/6/09 | 22.48 |  |
| 6/6/09 | 22.58 |  |
| 6/6/09 | 22.59 |  |
| 6/6/09 | 22.55 |  |
| 6/6/09 | 22.58 |  |
| 6/6/09 | 22.63 |  |
| 6/6/09 | 22.66 |  |
| 6/6/09 | 22.54 |  |
| 6/6/09 | 22.53 |  |
| 6/6/09 | 22.46 |  |
| 6/6/09 | 22.4 |  |
| 6/6/09 | 22.5 |  |
| 6/6/09 | 22.02 |  |
| 6/6/09 | 22.09 |  |
| 6/6/09 | 21.91 |  |
| 6/6/09 | 21.86 |  |
| 6/6/09 | 21.81 |  |
| 6/6/09 | 21.81 |  |
| 6/6/09 | 21.78 |  |
| 6/6/09 | 21.73 |  |
| 6/6/09 | 21.65 |  |
| 6/6/09 | 21.55 |  |
| 6/6/09 | 21.42 |  |
| 6/6/09 | 21.32 |  |
| 6/6/09 | 21.27 |  |
| 6/6/09 | 21.21 |  |
| 6/6/09 | 21.18 |  |
| 6/6/09 | 21.16 |  |
| 6/6/09 | 21.16 |  |
| 6/6/09 | 21.16 |  |
| 6/6/09 | 21.18 |  |
| 6/6/09 | 21.19 |  |
| 6/6/09 | 21.21 |  |
| 6/6/09 | 21.23 |  |
| 6/6/09 | 21.26 |  |
| 6/6/09 | 21.28 |  |
| 6/6/09 | 21.3 |  |
| 6/6/09 | 21.33 |  |
| 6/6/09 | 21.35 |  |
| 6/6/09 | 21.38 |  |
| 6/6/09 | 21.4 |  |
| 6/6/09 | 21.44 |  |
| 6/6/09 | 21.48 |  |
| 6/6/09 | 21.51 |  |
| 6/6/09 | 21.54 |  |
| 6/6/09 | 21.56 |  |
| 6/5/09 | 21.58 |  |
| 6/5/09 | 21.61 |  |
| 6/5/09 | 21.64 |  |
| 6/5/09 | 21.65 |  |
| 6/5/09 | 21.68 |  |
| 6/5/09 | 21.71 |  |
| 6/5/09 | 21.73 |  |
| 6/5/09 | 21.75 |  |
| 6/5/09 | 21.77 |  |
| 6/5/09 | 21.79 |  |
| 6/5/09 | 21.8 |  |
| 6/5/09 | 21.82 |  |
| 6/5/09 | 21.82 |  |
| 6/5/09 | 21.83 |  |
| 6/5/09 | 21.84 |  |
| 6/5/09 | 21.84 |  |
| 6/5/09 | 21.85 |  |
| 6/5/09 | 21.84 |  |
| 6/5/09 | 21.86 |  |
| 6/5/09 | 21.85 |  |
| 6/5/09 | 21.84 |  |
| 6/5/09 | 21.83 |  |
| 6/5/09 | 21.81 |  |
| 6/5/09 | 21.8 |  |
| 6/5/09 | 21.77 |  |
| 6/5/09 | 21.76 |  |
| 6/5/09 | 21.77 |  |
| 6/5/09 | 21.77 |  |
| 6/5/09 | 21.77 |  |
| 6/5/09 | 21.79 |  |
| 6/5/09 | 21.82 |  |
| 6/5/09 | 21.85 |  |
| 6/5/09 | 21.89 |  |
| 6/5/09 | 21.94 |  |
| 6/5/09 | 22.01 |  |
| 6/5/09 | 22.08 |  |
| 6/5/09 | 22.15 |  |
| 6/5/09 | 22.22 |  |
| 6/5/09 | 22.27 |  |
| 6/5/09 | 22.32 |  |
| 6/5/09 | 22.37 |  |
| 6/5/09 | 22.42 |  |
| 6/5/09 | 22.46 |  |
| 6/5/09 | 22.51 |  |
| 6/5/09 | 22.56 |  |
| 6/5/09 | 22.61 |  |
| 6/5/09 | 22.67 |  |
| 6/5/09 | 22.75 |  |
| 6/4/09 | 22.8 |  |
| 6/4/09 | 22.87 |  |
| 6/4/09 | 22.9 |  |
| 6/4/09 | 22.96 |  |
| 6/4/09 | 23.03 |  |
| 6/4/09 | 23.08 |  |
| 6/4/09 | 23.12 |  |
| 6/4/09 | 23.2 |  |
| 6/4/09 | 23.23 |  |
| 6/4/09 | 23.2 |  |
| 6/4/09 | 23.18 |  |
| 6/4/09 | 23.19 |  |
| 6/4/09 | 23.11 |  |
| 6/4/09 | 23.06 |  |
| 6/4/09 | 23.02 |  |
| 6/4/09 | 23 |  |
| 6/4/09 | 22.87 |  |
| 6/4/09 | 22.59 |  |
| 6/4/09 | 22.45 |  |
| 6/4/09 | 22.37 |  |
| 6/4/09 | 22.33 |  |
| 6/4/09 | 22.27 |  |
| 6/4/09 | 22.15 |  |
| 6/4/09 | 22.08 |  |
| 6/4/09 | 21.96 |  |
| 6/4/09 | 21.82 |  |
| 6/4/09 | 21.76 |  |
| 6/4/09 | 21.67 |  |
| 6/4/09 | 21.67 |  |
| 6/4/09 | 21.65 |  |
| 6/4/09 | 21.61 |  |
| 6/4/09 | 21.59 |  |
| 6/4/09 | 21.61 |  |
| 6/4/09 | 21.63 |  |
| 6/4/09 | 21.68 |  |
| 6/4/09 | 21.72 |  |
| 6/4/09 | 21.77 |  |
| 6/4/09 | 21.82 |  |
| 6/4/09 | 21.86 |  |
| 6/4/09 | 21.9 |  |
| 6/4/09 | 21.93 |  |
| 6/4/09 | 21.96 |  |
| 6/4/09 | 21.99 |  |
| 6/4/09 | 22.03 |  |
| 6/4/09 | 22.06 |  |
| 6/4/09 | 22.09 |  |
| 6/4/09 | 22.12 |  |
| 6/4/09 | 22.14 |  |
| 6/3/09 | 22.17 |  |
| 6/3/09 | 22.22 |  |
| 6/3/09 | 22.26 |  |
| 6/3/09 | 22.3 |  |
| 6/3/09 | 22.33 |  |
| 6/3/09 | 22.35 |  |
| 6/3/09 | 22.39 |  |
| 6/3/09 | 22.42 |  |
| 6/3/09 | 22.46 |  |
| 6/3/09 | 22.49 |  |
| 6/3/09 | 22.52 |  |
| 6/3/09 | 22.55 |  |
| 6/3/09 | 22.59 |  |
| 6/3/09 | 22.62 |  |
| 6/3/09 | 22.66 |  |
| 6/3/09 | 22.69 |  |
| 6/3/09 | 22.73 |  |
| 6/3/09 | 22.76 |  |
| 6/3/09 | 22.78 |  |
| 6/3/09 | 22.81 |  |
| 6/3/09 | 22.87 |  |
| 6/3/09 | 22.92 |  |
| 6/3/09 | 22.95 |  |
| 6/3/09 | 23 |  |
| 6/3/09 | 23.03 |  |
| 6/3/09 | 23.01 |  |
| 6/3/09 | 23.02 |  |
| 6/3/09 | 23.01 |  |
| 6/3/09 | 23.04 |  |
| 6/3/09 | 23.08 |  |
| 6/3/09 | 23.12 |  |
| 6/3/09 | 23.16 |  |
| 6/3/09 | 23.2 |  |
| 6/3/09 | 23.25 |  |
| 6/3/09 | 23.3 |  |
| 6/3/09 | 23.35 |  |
| 6/3/09 | 23.4 |  |
| 6/3/09 | 23.46 |  |
| 6/3/09 | 23.5 |  |
| 6/3/09 | 23.56 |  |
| 6/3/09 | 23.62 |  |
| 6/3/09 | 23.67 |  |
| 6/3/09 | 23.72 |  |
| 6/3/09 | 23.76 |  |
| 6/3/09 | 23.79 |  |
| 6/3/09 | 23.83 |  |
| 6/3/09 | 23.88 |  |
| 6/3/09 | 23.92 |  |
| 6/2/09 | 23.97 |  |
| 6/2/09 | 23.99 |  |
| 6/2/09 | 23.96 |  |
| 6/2/09 | 23.9 |  |
| 6/2/09 | 23.81 |  |
| 6/2/09 | 23.74 |  |
| 6/2/09 | 23.77 |  |
| 6/2/09 | 23.75 |  |
| 6/2/09 | 23.69 |  |
| 6/2/09 | 23.66 |  |
| 6/2/09 | 23.66 |  |
| 6/2/09 | 23.57 |  |
| 6/2/09 | 23.55 |  |
| 6/2/09 | 23.56 |  |
| 6/2/09 | 23.45 |  |
| 6/2/09 | 23.44 |  |
| 6/2/09 | 23.32 |  |
| 6/2/09 | 23.25 |  |
| 6/2/09 | 23.18 |  |
| 6/2/09 | 23.02 |  |
| 6/2/09 | 22.83 |  |
| 6/2/09 | 22.76 |  |
| 6/2/09 | 22.68 |  |
| 6/2/09 | 22.62 |  |
| 6/2/09 | 22.56 |  |
| 6/2/09 | 22.57 |  |
| 6/2/09 | 22.56 |  |
| 6/2/09 | 22.56 |  |
| 6/2/09 | 22.56 |  |
| 6/2/09 | 22.57 |  |
| 6/2/09 | 22.56 |  |
| 6/2/09 | 22.55 |  |
| 6/2/09 | 22.55 |  |
| 6/2/09 | 22.56 |  |
| 6/2/09 | 22.59 |  |
| 6/2/09 | 22.63 |  |
| 6/2/09 | 22.64 |  |
| 6/2/09 | 22.65 |  |
| 6/2/09 | 22.67 |  |
| 6/2/09 | 22.7 |  |
| 6/2/09 | 22.72 |  |
| 6/2/09 | 22.75 |  |
| 6/2/09 | 22.76 |  |
| 6/2/09 | 22.74 |  |
| 6/2/09 | 22.9 |  |
| 6/2/09 | 23.1 |  |
| 6/2/09 | 23.15 |  |
| 6/2/09 | 23.2 |  |
| 6/1/09 | 23.22 |  |
| 6/1/09 | 23.19 |  |
| 6/1/09 | 23.16 |  |
| 6/1/09 | 23.11 |  |
| 6/1/09 | 23.08 |  |
| 6/1/09 | 23.05 |  |
| 6/1/09 | 22.96 |  |
| 6/1/09 | 22.96 |  |
| 6/1/09 | 22.89 |  |
| 6/1/09 | 22.83 |  |
| 6/1/09 | 22.8 |  |
| 6/1/09 | 22.94 |  |
| 6/1/09 | 22.87 |  |
| 6/1/09 | 22.8 |  |
| 6/1/09 | 22.9 |  |
| 6/1/09 | 22.74 |  |
| 6/1/09 | 22.55 |  |
| 6/1/09 | 22.46 |  |
| 6/1/09 | 22.49 |  |
| 6/1/09 | 22.52 |  |
| 6/1/09 | 22.56 |  |
| 6/1/09 | 22.62 |  |
| 6/1/09 | 22.59 |  |
| 6/1/09 | 22.45 |  |
| 6/1/09 | 22.32 |  |
| 6/1/09 | 22.25 |  |
| 6/1/09 | 22.17 |  |
| 6/1/09 | 22.11 |  |
| 6/1/09 | 22.02 |  |
| 6/1/09 | 22.04 |  |
| 6/1/09 | 22.03 |  |
| 6/1/09 | 22.03 |  |
| 6/1/09 | 22.06 |  |
| 6/1/09 | 22.1 |  |
| 6/1/09 | 22.14 |  |
| 6/1/09 | 22.19 |  |
| 6/1/09 | 22.26 |  |
| 6/1/09 | 22.31 |  |
| 6/1/09 | 22.37 |  |
| 6/1/09 | 22.43 |  |
| 6/1/09 | 22.48 |  |
| 6/1/09 | 22.56 |  |
| 6/1/09 | 22.64 |  |
| 6/1/09 | 22.7 |  |
| 6/1/09 | 22.76 |  |
| 6/1/09 | 22.84 |  |
| 6/1/09 | 22.88 |  |
| 6/1/09 | 22.96 |  |
| 5/31/09 | 23.04 |  |
| 5/31/09 | 23.11 |  |
| 5/31/09 | 23.18 |  |
| 5/31/09 | 23.25 |  |
| 5/31/09 | 23.34 |  |
| 5/31/09 | 23.42 |  |
| 5/31/09 | 23.5 |  |
| 5/31/09 | 23.59 |  |
| 5/31/09 | 23.71 |  |
| 5/31/09 | 23.8 |  |
| 5/31/09 | 23.84 |  |
| 5/31/09 | 23.86 |  |
| 5/31/09 | 23.83 |  |
| 5/31/09 | 23.76 |  |
| 5/31/09 | 23.71 |  |
| 5/31/09 | 23.58 |  |
| 5/31/09 | 23.59 |  |
| 5/31/09 | 23.55 |  |
| 5/31/09 | 23.44 |  |
| 5/31/09 | 23.2 |  |
| 5/31/09 | 22.97 |  |
| 5/31/09 | 22.81 |  |
| 5/31/09 | 22.86 |  |
| 5/31/09 | 22.81 |  |
| 5/31/09 | 22.78 |  |
| 5/31/09 | 22.71 |  |
| 5/31/09 | 22.66 |  |
| 5/31/09 | 22.62 |  |
| 5/31/09 | 22.59 |  |
| 5/31/09 | 22.56 |  |
| 5/31/09 | 22.56 |  |
| 5/31/09 | 22.61 |  |
| 5/31/09 | 22.62 |  |
| 5/31/09 | 22.63 |  |
| 5/31/09 | 22.65 |  |
| 5/31/09 | 22.7 |  |
| 5/31/09 | 22.75 |  |
| 5/31/09 | 22.82 |  |
| 5/31/09 | 22.86 |  |
| 5/31/09 | 22.92 |  |
| 5/31/09 | 22.97 |  |
| 5/31/09 | 23.01 |  |
| 5/31/09 | 23.07 |  |
| 5/31/09 | 23.12 |  |
| 5/31/09 | 23.18 |  |
| 5/31/09 | 23.24 |  |
| 5/31/09 | 23.3 |  |
| 5/31/09 | 23.37 |  |
| 5/30/09 | 23.44 |  |
| 5/30/09 | 23.51 |  |
| 5/30/09 | 23.59 |  |
| 5/30/09 | 23.68 |  |
| 5/30/09 | 23.76 |  |
| 5/30/09 | 23.85 |  |
| 5/30/09 | 23.9 |  |
| 5/30/09 | 23.91 |  |
| 5/30/09 | 23.91 |  |
| 5/30/09 | 23.98 |  |
| 5/30/09 | 24.05 |  |
| 5/30/09 | 23.96 |  |
| 5/30/09 | 23.86 |  |
| 5/30/09 | 23.72 |  |
| 5/30/09 | 23.61 |  |
| 5/30/09 | 23.51 |  |
| 5/30/09 | 23.37 |  |
| 5/30/09 | 23.51 |  |
| 5/30/09 | 23.48 |  |
| 5/30/09 | 23.28 |  |
| 5/30/09 | 23.23 |  |
| 5/30/09 | 23.1 |  |
| 5/30/09 | 22.98 |  |
| 5/30/09 | 22.89 |  |
| 5/30/09 | 22.88 |  |
| 5/30/09 | 22.79 |  |
| 5/30/09 | 22.69 |  |
| 5/30/09 | 22.64 |  |
| 5/30/09 | 22.59 |  |
| 5/30/09 | 22.57 |  |
| 5/30/09 | 22.57 |  |
| 5/30/09 | 22.55 |  |
| 5/30/09 | 22.56 |  |
| 5/30/09 | 22.59 |  |
| 5/30/09 | 22.63 |  |
| 5/30/09 | 22.66 |  |
| 5/30/09 | 22.68 |  |
| 5/30/09 | 22.72 |  |
| 5/30/09 | 22.75 |  |
| 5/30/09 | 22.79 |  |
| 5/30/09 | 22.84 |  |
| 5/30/09 | 22.89 |  |
| 5/30/09 | 22.94 |  |
| 5/30/09 | 22.98 |  |
| 5/30/09 | 23.03 |  |
| 5/30/09 | 23.07 |  |
| 5/30/09 | 23.11 |  |
| 5/30/09 | 23.16 |  |
| 5/29/09 | 23.22 |  |
| 5/29/09 | 23.29 |  |
| 5/29/09 | 23.33 |  |
| 5/29/09 | 23.39 |  |
| 5/29/09 | 23.44 |  |
| 5/29/09 | 23.5 |  |
| 5/29/09 | 23.57 |  |
| 5/29/09 | 23.66 |  |
| 5/29/09 | 23.71 |  |
| 5/29/09 | 23.74 |  |
| 5/29/09 | 23.74 |  |
| 5/29/09 | 23.7 |  |
| 5/29/09 | 23.58 |  |
| 5/29/09 | 23.55 |  |
| 5/29/09 | 23.55 |  |
| 5/29/09 | 23.49 |  |
| 5/29/09 | 23.41 |  |
| 5/29/09 | 23.38 |  |
| 5/29/09 | 23.37 |  |
| 5/29/09 | 23.39 |  |
| 5/29/09 | 23.33 |  |
| 5/29/09 | 23.32 |  |
| 5/29/09 | 23.34 |  |
| 5/29/09 | 23.38 |  |
| 5/29/09 | 23.42 |  |
| 5/29/09 | 23.42 |  |
| 5/29/09 | 23.44 |  |
| 5/29/09 | 23.47 |  |
| 5/29/09 | 23.51 |  |
| 5/29/09 | 23.54 |  |
| 5/29/09 | 23.57 |  |
| 5/29/09 | 23.61 |  |
| 5/29/09 | 23.65 |  |
| 5/29/09 | 23.72 |  |
| 5/29/09 | 23.76 |  |
| 5/29/09 | 23.74 |  |
| 5/29/09 | 23.67 |  |
| 5/29/09 | 23.87 |  |
| 5/29/09 | 23.91 |  |
| 5/29/09 | 23.89 |  |
| 5/29/09 | 23.9 |  |
| 5/29/09 | 23.95 |  |
| 5/29/09 | 24.04 |  |
| 5/29/09 | 24.09 |  |
| 5/29/09 | 24.14 |  |
| 5/29/09 | 24.06 |  |
| 5/29/09 | 24.01 |  |
| 5/29/09 | 24.05 |  |
| 5/28/09 | 24.04 |  |
| 5/28/09 | 24.05 |  |
| 5/28/09 | 23.98 |  |
| 5/28/09 | 23.9 |  |
| 5/28/09 | 23.95 |  |
| 5/28/09 | 24.06 |  |
| 5/28/09 | 24.13 |  |
| 5/28/09 | 24.19 |  |
| 5/28/09 | 24.21 |  |
| 5/28/09 | 24.22 |  |
| 5/28/09 | 24.14 |  |
| 5/28/09 | 24.07 |  |
| 5/28/09 | 23.93 |  |
| 5/28/09 | 24 |  |
| 5/28/09 | 23.99 |  |
| 5/28/09 | 23.9 |  |
| 5/28/09 | 23.8 |  |
| 5/28/09 | 23.74 |  |
| 5/28/09 | 23.63 |  |
| 5/28/09 | 23.63 |  |
| 5/28/09 | 23.54 |  |
| 5/28/09 | 23.58 |  |
| 5/28/09 | 23.4 |  |
| 5/28/09 | 23.34 |  |
| 5/28/09 | 23.27 |  |
| 5/28/09 | 23.18 |  |
| 5/28/09 | 23.19 |  |
| 5/28/09 | 23.13 |  |
| 5/28/09 | 23.13 |  |
| 5/28/09 | 23.11 |  |
| 5/28/09 | 23.09 |  |
| 5/28/09 | 23.12 |  |
| 5/28/09 | 23.11 |  |
| 5/28/09 | 23.11 |  |
| 5/28/09 | 23.13 |  |
| 5/28/09 | 23.16 |  |
| 5/28/09 | 23.19 |  |
| 5/28/09 | 23.22 |  |
| 5/28/09 | 23.25 |  |
| 5/28/09 | 23.27 |  |
| 5/28/09 | 23.27 |  |
| 5/28/09 | 23.25 |  |
| 5/28/09 | 23.27 |  |
| 5/28/09 | 23.27 |  |
| 5/28/09 | 23.26 |  |
| 5/28/09 | 23.26 |  |
| 5/28/09 | 23.29 |  |
| 5/28/09 | 23.34 |  |
| 5/27/09 | 23.37 |  |
| 5/27/09 | 23.44 |  |
| 5/27/09 | 23.46 |  |
| 5/27/09 | 23.49 |  |
| 5/27/09 | 23.67 |  |
| 5/27/09 | 23.5 |  |
| 5/27/09 | 23.29 |  |
| 5/27/09 | 23.25 |  |
| 5/27/09 | 22.93 |  |
| 5/27/09 | 22.83 |  |
| 5/27/09 | 22.67 |  |
| 5/27/09 | 22.61 |  |
| 5/27/09 | 22.48 |  |
| 5/27/09 | 22.81 |  |
| 5/27/09 | 22.83 |  |
| 5/27/09 | 22.87 |  |
| 5/27/09 | 22.76 |  |
| 5/27/09 | 22.58 |  |
| 5/27/09 | 22.62 |  |
| 5/27/09 | 22.6 |  |
| 5/27/09 | 22.48 |  |
| 5/27/09 | 22.51 |  |
| 5/27/09 | 22.48 |  |
| 5/27/09 | 22.33 |  |
| 5/27/09 | 22.23 |  |
| 5/27/09 | 22.14 |  |
| 5/27/09 | 22.11 |  |
| 5/27/09 | 22.1 |  |
| 5/27/09 | 22.08 |  |
| 5/27/09 | 22.06 |  |
| 5/27/09 | 22.04 |  |
| 5/27/09 | 22.05 |  |
| 5/27/09 | 22.07 |  |
| 5/27/09 | 22.09 |  |
| 5/27/09 | 22.13 |  |
| 5/27/09 | 22.16 |  |
| 5/27/09 | 22.19 |  |
| 5/27/09 | 22.22 |  |
| 5/27/09 | 22.25 |  |
| 5/27/09 | 22.28 |  |
| 5/27/09 | 22.31 |  |
| 5/27/09 | 22.35 |  |
| 5/27/09 | 22.38 |  |
| 5/27/09 | 22.4 |  |
| 5/27/09 | 22.44 |  |
| 5/27/09 | 22.47 |  |
| 5/27/09 | 22.51 |  |
| 5/26/09 | 22.54 |  |
| 5/26/09 | 22.59 |  |
| 5/26/09 | 22.64 |  |
| 5/26/09 | 22.7 |  |
| 5/26/09 | 22.75 |  |
| 5/26/09 | 22.8 |  |
| 5/26/09 | 22.85 |  |
| 5/26/09 | 22.89 |  |
| 5/26/09 | 22.93 |  |
| 5/26/09 | 22.96 |  |
| 5/26/09 | 23 |  |
| 5/26/09 | 23.01 |  |
| 5/26/09 | 23.02 |  |
| 5/26/09 | 23.01 |  |
| 5/26/09 | 23.01 |  |
| 5/26/09 | 22.99 |  |
| 5/26/09 | 23.01 |  |
| 5/26/09 | 23.02 |  |
| 5/26/09 | 23.05 |  |
| 5/26/09 | 23.08 |  |
| 5/26/09 | 23.13 |  |
| 5/26/09 | 23.2 |  |
| 5/26/09 | 23.22 |  |
| 5/26/09 | 23.26 |  |
| 5/26/09 | 23.3 |  |
| 5/26/09 | 23.36 |  |
| 5/26/09 | 23.39 |  |
| 5/26/09 | 23.46 |  |
| 5/26/09 | 23.54 |  |
| 5/26/09 | 23.63 |  |
| 5/26/09 | 23.66 |  |
| 5/26/09 | 23.71 |  |
| 5/26/09 | 23.78 |  |
| 5/26/09 | 23.82 |  |
| 5/26/09 | 23.9 |  |
| 5/26/09 | 23.98 |  |
| 5/26/09 | 24.04 |  |
| 5/26/09 | 24.08 |  |
| 5/26/09 | 24.15 |  |
| 5/26/09 | 24.22 |  |
| 5/26/09 | 24.27 |  |
| 5/26/09 | 24.35 |  |
| 5/26/09 | 24.53 |  |
| 5/26/09 | 24.74 |  |
| 5/26/09 | 24.93 |  |
| 5/26/09 | 25.09 |  |
| 5/26/09 | 25.19 |  |
| 5/26/09 | 25.23 |  |
| 5/25/09 | 25.26 |  |
| 5/25/09 | 25.14 |  |
| 5/25/09 | 25.04 |  |
| 5/25/09 | 25.07 |  |
| 5/25/09 | 25.11 |  |
| 5/25/09 | 25.16 |  |
| 5/25/09 | 25.09 |  |
| 5/25/09 | 25.12 |  |
| 5/25/09 | 25.69 |  |
| 5/25/09 | 26.01 |  |
| 5/25/09 | 25.93 |  |
| 5/25/09 | 25.66 |  |
| 5/25/09 | 25.38 |  |
| 5/25/09 | 25.1 |  |
| 5/25/09 | 25.16 |  |
| 5/25/09 | 25.43 |  |
| 5/25/09 | 25.33 |  |
| 5/25/09 | 25.16 |  |
| 5/25/09 | 24.96 |  |
| 5/25/09 | 24.72 |  |
| 5/25/09 | 24.54 |  |
| 5/25/09 | 24.24 |  |
| 5/25/09 | 24.08 |  |
| 5/25/09 | 23.92 |  |
| 5/25/09 | 23.74 |  |
| 5/25/09 | 23.64 |  |
| 5/25/09 | 23.59 |  |
| 5/25/09 | 23.5 |  |
| 5/25/09 | 23.44 |  |
| 5/25/09 | 23.36 |  |
| 5/25/09 | 23.39 |  |
| 5/25/09 | 23.37 |  |
| 5/25/09 | 23.39 |  |
| 5/25/09 | 23.39 |  |
| 5/25/09 | 23.4 |  |
| 5/25/09 | 23.49 |  |
| 5/25/09 | 23.57 |  |
| 5/25/09 | 23.64 |  |
| 5/25/09 | 23.7 |  |
| 5/25/09 | 23.76 |  |
| 5/25/09 | 23.82 |  |
| 5/25/09 | 23.87 |  |
| 5/25/09 | 23.92 |  |
| 5/25/09 | 23.92 |  |
| 5/25/09 | 23.88 |  |
| 5/25/09 | 23.85 |  |
| 5/25/09 | 23.84 |  |
| 5/25/09 | 23.84 |  |
| 5/24/09 | 23.88 |  |
| 5/24/09 | 23.93 |  |
| 5/24/09 | 23.96 |  |
| 5/24/09 | 24.01 |  |
| 5/24/09 | 24.04 |  |
| 5/24/09 | 24.03 |  |
| 5/24/09 | 23.95 |  |
| 5/24/09 | 23.88 |  |
| 5/24/09 | 23.78 |  |
| 5/24/09 | 23.75 |  |
| 5/24/09 | 23.8 |  |
| 5/24/09 | 23.8 |  |
| 5/24/09 | 23.64 |  |
| 5/24/09 | 23.53 |  |
| 5/24/09 | 23.45 |  |
| 5/24/09 | 23.62 |  |
| 5/24/09 | 23.41 |  |
| 5/24/09 | 23.51 |  |
| 5/24/09 | 23.55 |  |
| 5/24/09 | 23.42 |  |
| 5/24/09 | 23.37 |  |
| 5/24/09 | 23.46 |  |
| 5/24/09 | 23.43 |  |
| 5/24/09 | 23.29 |  |
| 5/24/09 | 23.21 |  |
| 5/24/09 | 23.07 |  |
| 5/24/09 | 22.93 |  |
| 5/24/09 | 22.94 |  |
| 5/24/09 | 22.85 |  |
| 5/24/09 | 22.85 |  |
| 5/24/09 | 22.77 |  |
| 5/24/09 | 22.73 |  |
| 5/24/09 | 22.76 |  |
| 5/24/09 | 22.78 |  |
| 5/24/09 | 22.81 |  |
| 5/24/09 | 22.85 |  |
| 5/24/09 | 22.9 |  |
| 5/24/09 | 22.97 |  |
| 5/24/09 | 23.02 |  |
| 5/24/09 | 23.09 |  |
| 5/24/09 | 23.16 |  |
| 5/24/09 | 23.23 |  |
| 5/24/09 | 23.28 |  |
| 5/24/09 | 23.3 |  |
| 5/24/09 | 23.27 |  |
| 5/24/09 | 23.26 |  |
| 5/24/09 | 23.26 |  |
| 5/24/09 | 23.25 |  |
| 5/23/09 | 23.25 |  |
| 5/23/09 | 23.27 |  |
| 5/23/09 | 23.28 |  |
| 5/23/09 | 23.3 |  |
| 5/23/09 | 23.31 |  |
| 5/23/09 | 23.3 |  |
| 5/23/09 | 23.28 |  |
| 5/23/09 | 23.31 |  |
| 5/23/09 | 23.33 |  |
| 5/23/09 | 23.32 |  |
| 5/23/09 | 23.31 |  |
| 5/23/09 | 23.38 |  |
| 5/23/09 | 23.38 |  |
| 5/23/09 | 23.23 |  |
| 5/23/09 | 23.14 |  |
| 5/23/09 | 23.14 |  |
| 5/23/09 | 23.12 |  |
| 5/23/09 | 23.06 |  |
| 5/23/09 | 23.04 |  |
| 5/23/09 | 23.02 |  |
| 5/23/09 | 22.97 |  |
| 5/23/09 | 22.87 |  |
| 5/23/09 | 22.81 |  |
| 5/23/09 | 22.72 |  |
| 5/23/09 | 22.66 |  |
| 5/23/09 | 22.58 |  |
| 5/23/09 | 22.54 |  |
| 5/23/09 | 22.53 |  |
| 5/23/09 | 22.53 |  |
| 5/23/09 | 22.52 |  |
| 5/23/09 | 22.51 |  |
| 5/23/09 | 22.53 |  |
| 5/23/09 | 22.57 |  |
| 5/23/09 | 22.6 |  |
| 5/23/09 | 22.63 |  |
| 5/23/09 | 22.68 |  |
| 5/23/09 | 22.75 |  |
| 5/23/09 | 22.79 |  |
| 5/23/09 | 22.79 |  |
| 5/23/09 | 22.76 |  |
| 5/23/09 | 22.74 |  |
| 5/23/09 | 22.75 |  |
| 5/23/09 | 22.74 |  |
| 5/23/09 | 22.75 |  |
| 5/23/09 | 22.77 |  |
| 5/23/09 | 22.76 |  |
| 5/23/09 | 22.76 |  |
| 5/23/09 | 22.8 |  |
| 5/22/09 | 22.81 |  |
| 5/22/09 | 22.84 |  |
| 5/22/09 | 22.81 |  |
| 5/22/09 | 22.82 |  |
| 5/22/09 | 22.81 |  |
| 5/22/09 | 22.79 |  |
| 5/22/09 | 22.77 |  |
| 5/22/09 | 22.74 |  |
| 5/22/09 | 22.81 |  |
| 5/22/09 | 22.83 |  |
| 5/22/09 | 22.86 |  |
| 5/22/09 | 22.93 |  |
| 5/22/09 | 22.96 |  |
| 5/22/09 | 23.03 |  |
| 5/22/09 | 22.86 |  |
| 5/22/09 | 22.75 |  |
| 5/22/09 | 22.64 |  |
| 5/22/09 | 22.52 |  |
| 5/22/09 | 22.45 |  |
| 5/22/09 | 22.34 |  |
| 5/22/09 | 22.43 |  |
| 5/22/09 | 22.34 |  |
| 5/22/09 | 22.37 |  |
| 5/22/09 | 22.28 |  |
| 5/22/09 | 22.18 |  |
| 5/22/09 | 22 |  |
| 5/22/09 | 21.92 |  |
| 5/22/09 | 21.83 |  |
| 5/22/09 | 21.8 |  |
| 5/22/09 | 21.75 |  |
| 5/22/09 | 21.69 |  |
| 5/22/09 | 21.68 |  |
| 5/22/09 | 21.68 |  |
| 5/22/09 | 21.7 |  |
| 5/22/09 | 21.73 |  |
| 5/22/09 | 21.81 |  |
| 5/22/09 | 21.89 |  |
| 5/22/09 | 21.98 |  |
| 5/22/09 | 22.06 |  |
| 5/22/09 | 22.14 |  |
| 5/22/09 | 22.22 |  |
| 5/22/09 | 22.3 |  |
| 5/22/09 | 22.36 |  |
| 5/22/09 | 22.45 |  |
| 5/22/09 | 22.52 |  |
| 5/22/09 | 22.57 |  |
| 5/22/09 | 22.57 |  |
| 5/22/09 | 22.39 |  |
| 5/21/09 | 22.3 |  |
| 5/21/09 | 22.31 |  |
| 5/21/09 | 22.3 |  |
| 5/21/09 | 22.26 |  |
| 5/21/09 | 22.22 |  |
| 5/21/09 | 22.19 |  |
| 5/21/09 | 22.21 |  |
| 5/21/09 | 22.25 |  |
| 5/21/09 | 22.3 |  |
| 5/21/09 | 22.31 |  |
| 5/21/09 | 22.41 |  |
| 5/21/09 | 22.38 |  |
| 5/21/09 | 22.19 |  |
| 5/21/09 | 22.18 |  |
| 5/21/09 | 22.05 |  |
| 5/21/09 | 21.94 |  |
| 5/21/09 | 21.88 |  |
| 5/21/09 | 21.73 |  |
| 5/21/09 | 21.51 |  |
| 5/21/09 | 21.38 |  |
| 5/21/09 | 21.35 |  |
| 5/21/09 | 21.3 |  |
| 5/21/09 | 21.21 |  |
| 5/21/09 | 21.17 |  |
| 5/21/09 | 21.1 |  |
| 5/21/09 | 20.94 |  |
| 5/21/09 | 20.83 |  |
| 5/21/09 | 20.78 |  |
| 5/21/09 | 20.73 |  |
| 5/21/09 | 20.69 |  |
| 5/21/09 | 20.67 |  |
| 5/21/09 | 20.67 |  |
| 5/21/09 | 20.66 |  |
| 5/21/09 | 20.71 |  |
| 5/21/09 | 20.78 |  |
| 5/21/09 | 20.84 |  |
| 5/21/09 | 20.92 |  |
| 5/21/09 | 21 |  |
| 5/21/09 | 21.05 |  |
| 5/21/09 | 21.08 |  |
| 5/21/09 | 21.08 |  |
| 5/21/09 | 21.04 |  |
| 5/21/09 | 21.03 |  |
| 5/21/09 | 21.01 |  |
| 5/21/09 | 21 |  |
| 5/21/09 | 20.97 |  |
| 5/21/09 | 21.06 |  |
| 5/21/09 | 21.14 |  |
| 5/20/09 | 21.17 |  |
| 5/20/09 | 21.19 |  |
| 5/20/09 | 21.18 |  |
| 5/20/09 | 21.15 |  |
| 5/20/09 | 21.14 |  |
| 5/20/09 | 21.09 |  |
| 5/20/09 | 21.12 |  |
| 5/20/09 | 21.07 |  |
| 5/20/09 | 21.03 |  |
| 5/20/09 | 21.09 |  |
| 5/20/09 | 21.15 |  |
| 5/20/09 | 21.08 |  |
| 5/20/09 | 21.18 |  |
| 5/20/09 | 21.29 |  |
| 5/20/09 | 20.99 |  |
| 5/20/09 | 20.97 |  |
| 5/20/09 | 20.73 |  |
| 5/20/09 | 20.67 |  |
| 5/20/09 | 20.74 |  |
| 5/20/09 | 20.52 |  |
| 5/20/09 | 20.4 |  |
| 5/20/09 | 20.19 |  |
| 5/20/09 | 20.17 |  |
| 5/20/09 | 20.2 |  |
| 5/20/09 | 20 |  |
| 5/20/09 | 19.83 |  |
| 5/20/09 | 19.75 |  |
| 5/20/09 | 19.67 |  |
| 5/20/09 | 19.59 |  |
| 5/20/09 | 19.55 |  |
| 5/20/09 | 19.52 |  |
| 5/20/09 | 19.5 |  |
| 5/20/09 | 19.5 |  |
| 5/20/09 | 19.52 |  |
| 5/20/09 | 19.57 |  |
| 5/20/09 | 19.62 |  |
| 5/20/09 | 19.69 |  |
| 5/20/09 | 19.77 |  |
| 5/20/09 | 19.85 |  |
| 5/20/09 | 19.94 |  |
| 5/20/09 | 20.03 |  |
| 5/20/09 | 20.11 |  |
| 5/20/09 | 20.19 |  |
| 5/20/09 | 20.28 |  |
| 5/20/09 | 20.38 |  |
| 5/20/09 | 20.47 |  |
| 5/20/09 | 20.59 |  |
| 5/20/09 | 20.71 |  |
| 5/19/09 | 20.81 |  |
| 5/19/09 | 20.84 |  |
| 5/19/09 | 20.73 |  |
| 5/19/09 | 20.58 |  |
| 5/19/09 | 20.56 |  |
| 5/19/09 | 20.55 |  |
| 5/19/09 | 20.6 |  |
| 5/19/09 | 20.73 |  |
| 5/19/09 | 20.76 |  |
| 5/19/09 | 20.8 |  |
| 5/19/09 | 20.81 |  |
| 5/19/09 | 20.63 |  |
| 5/19/09 | 20.49 |  |
| 5/19/09 | 20.36 |  |
| 5/19/09 | 20.21 |  |
| 5/19/09 | 20.04 |  |
| 5/19/09 | 19.97 |  |
| 5/19/09 | 19.95 |  |
| 5/19/09 | 19.63 |  |
| 5/19/09 | 19.48 |  |
| 5/19/09 | 19.41 |  |
| 5/19/09 | 19.33 |  |
| 5/19/09 | 19.27 |  |
| 5/19/09 | 19.19 |  |
| 5/19/09 | 19.22 |  |
| 5/19/09 | 19.1 |  |
| 5/19/09 | 19.01 |  |
| 5/19/09 | 18.94 |  |
| 5/19/09 | 18.91 |  |
| 5/19/09 | 18.85 |  |
| 5/19/09 | 18.86 |  |
| 5/19/09 | 18.85 |  |
| 5/19/09 | 18.87 |  |
| 5/19/09 | 18.89 |  |
| 5/19/09 | 18.93 |  |
| 5/19/09 | 18.98 |  |
| 5/19/09 | 19.02 |  |
| 5/19/09 | 19.08 |  |
| 5/19/09 | 19.13 |  |
| 5/19/09 | 19.18 |  |
| 5/19/09 | 19.25 |  |
| 5/19/09 | 19.31 |  |
| 5/19/09 | 19.4 |  |
| 5/19/09 | 19.49 |  |
| 5/19/09 | 19.57 |  |
| 5/19/09 | 19.65 |  |
| 5/19/09 | 19.74 |  |
| 5/19/09 | 19.83 |  |
| 5/18/09 | 19.9 |  |
| 5/18/09 | 19.96 |  |
| 5/18/09 | 20.02 |  |
| 5/18/09 | 20.08 |  |
| 5/18/09 | 20.17 |  |
| 5/18/09 | 20.24 |  |
| 5/18/09 | 20.28 |  |
| 5/18/09 | 20.22 |  |
| 5/18/09 | 20.42 |  |
| 5/18/09 | 20.13 |  |
| 5/18/09 | 20.03 |  |
| 5/18/09 | 20.07 |  |
| 5/18/09 | 20.37 |  |
| 5/18/09 | 20.06 |  |
| 5/18/09 | 19.72 |  |
| 5/18/09 | 19.85 |  |
| 5/18/09 | 19.86 |  |
| 5/18/09 | 19.8 |  |
| 5/18/09 | 19.83 |  |
| 5/18/09 | 19.75 |  |
| 5/18/09 | 19.5 |  |
| 5/18/09 | 19.49 |  |
| 5/18/09 | 19.32 |  |
| 5/18/09 | 19.31 |  |
| 5/18/09 | 19.17 |  |
| 5/18/09 | 18.94 |  |
| 5/18/09 | 19 |  |
| 5/18/09 | 18.99 |  |
| 5/18/09 | 18.88 |  |
| 5/18/09 | 18.86 |  |
| 5/18/09 | 18.84 |  |
| 5/18/09 | 18.85 |  |
| 5/18/09 | 18.87 |  |
| 5/18/09 | 18.9 |  |
| 5/18/09 | 18.95 |  |
| 5/18/09 | 18.99 |  |
| 5/18/09 | 19.06 |  |
| 5/18/09 | 19.13 |  |
| 5/18/09 | 19.22 |  |
| 5/18/09 | 19.27 |  |
| 5/18/09 | 19.32 |  |
| 5/18/09 | 19.37 |  |
| 5/18/09 | 19.43 |  |
| 5/18/09 | 19.5 |  |
| 5/18/09 | 19.55 |  |
| 5/18/09 | 19.6 |  |
| 5/18/09 | 19.68 |  |
| 5/18/09 | 19.74 |  |
| 5/17/09 | 19.8 |  |
| 5/17/09 | 19.87 |  |
| 5/17/09 | 19.93 |  |
| 5/17/09 | 19.99 |  |
| 5/17/09 | 20.06 |  |
| 5/17/09 | 20.12 |  |
| 5/17/09 | 20.15 |  |
| 5/17/09 | 20.18 |  |
| 5/17/09 | 20.27 |  |
| 5/17/09 | 20.31 |  |
| 5/17/09 | 20.38 |  |
| 5/17/09 | 20.45 |  |
| 5/17/09 | 20.51 |  |
| 5/17/09 | 20.49 |  |
| 5/17/09 | 20.48 |  |
| 5/17/09 | 20.41 |  |
| 5/17/09 | 20.34 |  |
| 5/17/09 | 20.25 |  |
| 5/17/09 | 20.15 |  |
| 5/17/09 | 20.06 |  |
| 5/17/09 | 20.01 |  |
| 5/17/09 | 19.95 |  |
| 5/17/09 | 19.85 |  |
| 5/17/09 | 19.78 |  |
| 5/17/09 | 19.74 |  |
| 5/17/09 | 19.73 |  |
| 5/17/09 | 19.75 |  |
| 5/17/09 | 19.73 |  |
| 5/17/09 | 19.71 |  |
| 5/17/09 | 19.71 |  |
| 5/17/09 | 19.72 |  |
| 5/17/09 | 19.79 |  |
| 5/17/09 | 19.81 |  |
| 5/17/09 | 19.87 |  |
| 5/17/09 | 19.91 |  |
| 5/17/09 | 19.96 |  |
| 5/17/09 | 20.05 |  |
| 5/17/09 | 20.12 |  |
| 5/17/09 | 20.22 |  |
| 5/17/09 | 20.34 |  |
| 5/17/09 | 20.44 |  |
| 5/17/09 | 20.55 |  |
| 5/17/09 | 20.65 |  |
| 5/17/09 | 20.73 |  |
| 5/17/09 | 20.8 |  |
| 5/17/09 | 20.91 |  |
| 5/17/09 | 21.01 |  |
| 5/17/09 | 21.08 |  |
| 5/16/09 | 21.1 |  |
| 5/16/09 | 21.05 |  |
| 5/16/09 | 21.06 |  |
| 5/16/09 | 21.08 |  |
| 5/16/09 | 21 |  |
| 5/16/09 | 21.12 |  |
| 5/16/09 | 20.73 |  |
| 5/16/09 | 20.43 |  |
| 5/16/09 | 20.65 |  |
| 5/16/09 | 20.85 |  |
| 5/16/09 | 20.94 |  |
| 5/16/09 | 21.01 |  |
| 5/16/09 | 20.99 |  |
| 5/16/09 | 20.77 |  |
| 5/16/09 | 20.72 |  |
| 5/16/09 | 20.53 |  |
| 5/16/09 | 20.54 |  |
| 5/16/09 | 20.36 |  |
| 5/16/09 | 20.44 |  |
| 5/16/09 | 20.21 |  |
| 5/16/09 | 20.13 |  |
| 5/16/09 | 20.11 |  |
| 5/16/09 | 20.25 |  |
| 5/16/09 | 20.19 |  |
| 5/16/09 | 20.09 |  |
| 5/16/09 | 19.99 |  |
| 5/16/09 | 20.06 |  |
| 5/16/09 | 20.13 |  |
| 5/16/09 | 20.22 |  |
| 5/16/09 | 20.17 |  |
| 5/16/09 | 20.22 |  |
| 5/16/09 | 20.27 |  |
| 5/16/09 | 20.25 |  |
| 5/16/09 | 20.22 |  |
| 5/16/09 | 20.15 |  |
| 5/16/09 | 20.15 |  |
| 5/16/09 | 20.07 |  |
| 5/16/09 | 20.06 |  |
| 5/16/09 | 20.01 |  |
| 5/16/09 | 20.03 |  |
| 5/16/09 | 20.06 |  |
| 5/16/09 | 20.07 |  |
| 5/16/09 | 20.11 |  |
| 5/16/09 | 20.12 |  |
| 5/16/09 | 20.12 |  |
| 5/16/09 | 20.17 |  |
| 5/16/09 | 20.17 |  |
| 5/16/09 | 20.15 |  |
| 5/15/09 | 20.12 |  |
| 5/15/09 | 20.06 |  |
| 5/15/09 | 20 |  |
| 5/15/09 | 19.93 |  |
| 5/15/09 | 19.93 |  |
| 5/15/09 | 19.91 |  |
| 5/15/09 | 19.87 |  |
| 5/15/09 | 19.98 |  |
| 5/15/09 | 20.09 |  |
| 5/15/09 | 20.2 |  |
| 5/15/09 | 20.13 |  |
| 5/15/09 | 20.14 |  |
| 5/15/09 | 19.89 |  |
| 5/15/09 | 20.1 |  |
| 5/15/09 | 19.99 |  |
| 5/15/09 | 19.88 |  |
| 5/15/09 | 19.97 |  |
| 5/15/09 | 20.05 |  |
| 5/15/09 | 19.54 |  |
| 5/15/09 | 19.79 |  |
| 5/15/09 | 19.53 |  |
| 5/15/09 | 19.5 |  |
| 5/15/09 | 19.38 |  |
| 5/15/09 | 19.25 |  |
| 5/15/09 | 19.03 |  |
| 5/15/09 | 18.84 |  |
| 5/15/09 | 18.8 |  |
| 5/15/09 | 18.74 |  |
| 5/15/09 | 18.67 |  |
| 5/15/09 | 18.64 |  |
| 5/15/09 | 18.62 |  |
| 5/15/09 | 18.61 |  |
| 5/15/09 | 18.61 |  |
| 5/15/09 | 18.63 |  |
| 5/15/09 | 18.65 |  |
| 5/15/09 | 18.68 |  |
| 5/15/09 | 18.72 |  |
| 5/15/09 | 18.74 |  |
| 5/15/09 | 18.76 |  |
| 5/15/09 | 18.79 |  |
| 5/15/09 | 18.83 |  |
| 5/15/09 | 18.86 |  |
| 5/15/09 | 18.89 |  |
| 5/15/09 | 18.92 |  |
| 5/15/09 | 18.95 |  |
| 5/15/09 | 18.98 |  |
| 5/15/09 | 19.03 |  |
| 5/15/09 | 19.09 |  |
| 5/14/09 | 19.14 |  |
| 5/14/09 | 19.18 |  |
| 5/14/09 | 19.22 |  |
| 5/14/09 | 19.27 |  |
| 5/14/09 | 19.3 |  |
| 5/14/09 | 19.32 |  |
| 5/14/09 | 19.23 |  |
| 5/14/09 | 19.21 |  |
| 5/14/09 | 19.3 |  |
| 5/14/09 | 19.31 |  |
| 5/14/09 | 19.1 |  |
| 5/14/09 | 18.99 |  |
| 5/14/09 | 19.02 |  |
| 5/14/09 | 19.07 |  |
| 5/14/09 | 19.09 |  |
| 5/14/09 | 19.02 |  |
| 5/14/09 | 18.93 |  |
| 5/14/09 | 18.92 |  |
| 5/14/09 | 18.98 |  |
| 5/14/09 | 18.93 |  |
| 5/14/09 | 18.77 |  |
| 5/14/09 | 18.72 |  |
| 5/14/09 | 18.69 |  |
| 5/14/09 | 18.65 |  |
| 5/14/09 | 18.5 |  |
| 5/14/09 | 18.49 |  |
| 5/14/09 | 18.48 |  |
| 5/14/09 | 18.46 |  |
| 5/14/09 | 18.42 |  |
| 5/14/09 | 18.4 |  |
| 5/14/09 | 18.39 |  |
| 5/14/09 | 18.4 |  |
| 5/14/09 | 18.42 |  |
| 5/14/09 | 18.45 |  |
| 5/14/09 | 18.47 |  |
| 5/14/09 | 18.49 |  |
| 5/14/09 | 18.53 |  |
| 5/14/09 | 18.55 |  |
| 5/14/09 | 18.56 |  |
| 5/14/09 | 18.57 |  |
| 5/14/09 | 18.59 |  |
| 5/14/09 | 18.62 |  |
| 5/14/09 | 18.64 |  |
| 5/14/09 | 18.67 |  |
| 5/14/09 | 18.71 |  |
| 5/14/09 | 18.73 |  |
| 5/14/09 | 18.75 |  |
| 5/14/09 | 18.76 |  |
| 5/13/09 | 18.77 |  |
| 5/13/09 | 18.79 |  |
| 5/13/09 | 18.8 |  |
| 5/13/09 | 18.81 |  |
| 5/13/09 | 18.85 |  |
| 5/13/09 | 18.89 |  |
| 5/13/09 | 18.93 |  |
| 5/13/09 | 18.95 |  |
| 5/13/09 | 19 |  |
| 5/13/09 | 19.02 |  |
| 5/13/09 | 19.08 |  |
| 5/13/09 | 19.13 |  |
| 5/13/09 | 19.09 |  |
| 5/13/09 | 19.05 |  |
| 5/13/09 | 18.94 |  |
| 5/13/09 | 18.95 |  |
| 5/13/09 | 18.92 |  |
| 5/13/09 | 18.81 |  |
| 5/13/09 | 18.75 |  |
| 5/13/09 | 18.72 |  |
| 5/13/09 | 18.65 |  |
| 5/13/09 | 18.57 |  |
| 5/13/09 | 18.39 |  |
| 5/13/09 | 18.31 |  |
| 5/13/09 | 18.12 |  |
| 5/13/09 | 18.05 |  |
| 5/13/09 | 17.92 |  |
| 5/13/09 | 17.87 |  |
| 5/13/09 | 17.88 |  |
| 5/13/09 | 17.87 |  |
| 5/13/09 | 17.84 |  |
| 5/13/09 | 17.85 |  |
| 5/13/09 | 17.86 |  |
| 5/13/09 | 17.89 |  |
| 5/13/09 | 17.94 |  |
| 5/13/09 | 17.99 |  |
| 5/13/09 | 18.06 |  |
| 5/13/09 | 18.11 |  |
| 5/13/09 | 18.17 |  |
| 5/13/09 | 18.24 |  |
| 5/13/09 | 18.31 |  |
| 5/13/09 | 18.38 |  |
| 5/13/09 | 18.44 |  |
| 5/13/09 | 18.52 |  |
| 5/13/09 | 18.58 |  |
| 5/13/09 | 18.66 |  |
| 5/13/09 | 18.75 |  |
| 5/13/09 | 18.82 |  |
| 5/12/09 | 18.91 |  |
| 5/12/09 | 18.98 |  |
| 5/12/09 | 19.06 |  |
| 5/12/09 | 19.14 |  |
| 5/12/09 | 19.23 |  |
| 5/12/09 | 19.31 |  |
| 5/12/09 | 19.35 |  |
| 5/12/09 | 19.37 |  |
| 5/12/09 | 19.45 |  |
| 5/12/09 | 19.11 |  |
| 5/12/09 | 19.18 |  |
| 5/12/09 | 19.09 |  |
| 5/12/09 | 18.82 |  |
| 5/12/09 | 19.02 |  |
| 5/12/09 | 18.57 |  |
| 5/12/09 | 18.76 |  |
| 5/12/09 | 18.56 |  |
| 5/12/09 | 18.23 |  |
| 5/12/09 | 18.28 |  |
| 5/12/09 | 17.9 |  |
| 5/12/09 | 17.93 |  |
| 5/12/09 | 17.84 |  |
| 5/12/09 | 17.83 |  |
| 5/12/09 | 17.81 |  |
| 5/12/09 | 17.77 |  |
| 5/12/09 | 17.67 |  |
| 5/12/09 | 17.59 |  |
| 5/12/09 | 17.56 |  |
| 5/12/09 | 17.51 |  |
| 5/12/09 | 17.47 |  |
| 5/12/09 | 17.45 |  |
| 5/12/09 | 17.44 |  |
| 5/12/09 | 17.45 |  |
| 5/12/09 | 17.49 |  |
| 5/12/09 | 17.51 |  |
| 5/12/09 | 17.56 |  |
| 5/12/09 | 17.6 |  |
| 5/12/09 | 17.64 |  |
| 5/12/09 | 17.67 |  |
| 5/12/09 | 17.72 |  |
| 5/12/09 | 17.79 |  |
| 5/12/09 | 17.84 |  |
| 5/12/09 | 17.88 |  |
| 5/12/09 | 17.94 |  |
| 5/12/09 | 18.01 |  |
| 5/12/09 | 18.07 |  |
| 5/12/09 | 18.13 |  |
| 5/12/09 | 18.2 |  |
| 5/11/09 | 18.27 |  |
| 5/11/09 | 18.35 |  |
| 5/11/09 | 18.41 |  |
| 5/11/09 | 18.44 |  |
| 5/11/09 | 18.35 |  |
| 5/11/09 | 18.44 |  |
| 5/11/09 | 18.48 |  |
| 5/11/09 | 18.28 |  |
| 5/11/09 | 18.15 |  |
| 5/11/09 | 18.21 |  |
| 5/11/09 | 18.45 |  |
| 5/11/09 | 18.38 |  |
| 5/11/09 | 18.14 |  |
| 5/11/09 | 18.16 |  |
| 5/11/09 | 18.38 |  |
| 5/11/09 | 18.36 |  |
| 5/11/09 | 18.26 |  |
| 5/11/09 | 18.28 |  |
| 5/11/09 | 18.27 |  |
| 5/11/09 | 18.13 |  |
| 5/11/09 | 18.07 |  |
| 5/11/09 | 17.96 |  |
| 5/11/09 | 17.93 |  |
| 5/11/09 | 17.94 |  |
| 5/11/09 | 17.85 |  |
| 5/11/09 | 17.78 |  |
| 5/11/09 | 17.75 |  |
| 5/11/09 | 17.73 |  |
| 5/11/09 | 17.73 |  |
| 5/11/09 | 17.73 |  |
| 5/11/09 | 17.76 |  |
| 5/11/09 | 17.78 |  |
| 5/11/09 | 17.8 |  |
| 5/11/09 | 17.83 |  |
| 5/11/09 | 17.86 |  |
| 5/11/09 | 17.89 |  |
| 5/11/09 | 17.92 |  |
| 5/11/09 | 17.94 |  |
| 5/11/09 | 17.97 |  |
| 5/11/09 | 18.01 |  |
| 5/11/09 | 18.04 |  |
| 5/11/09 | 18.08 |  |
| 5/11/09 | 18.13 |  |
| 5/11/09 | 18.15 |  |
| 5/11/09 | 18.17 |  |
| 5/11/09 | 18.2 |  |
| 5/11/09 | 18.24 |  |
| 5/11/09 | 18.28 |  |
| 5/10/09 | 18.3 |  |
| 5/10/09 | 18.34 |  |
| 5/10/09 | 18.38 |  |
| 5/10/09 | 18.41 |  |
| 5/10/09 | 18.45 |  |
| 5/10/09 | 18.5 |  |
| 5/10/09 | 18.55 |  |
| 5/10/09 | 18.6 |  |
| 5/10/09 | 18.63 |  |
| 5/10/09 | 18.64 |  |
| 5/10/09 | 18.67 |  |
| 5/10/09 | 18.71 |  |
| 5/10/09 | 18.72 |  |
| 5/10/09 | 18.71 |  |
| 5/10/09 | 18.69 |  |
| 5/10/09 | 18.69 |  |
| 5/10/09 | 18.7 |  |
| 5/10/09 | 18.69 |  |
| 5/10/09 | 18.62 |  |
| 5/10/09 | 18.55 |  |
| 5/10/09 | 18.47 |  |
| 5/10/09 | 18.38 |  |
| 5/10/09 | 18.36 |  |
| 5/10/09 | 18.33 |  |
| 5/10/09 | 18.34 |  |
| 5/10/09 | 18.34 |  |
| 5/10/09 | 18.34 |  |
| 5/10/09 | 18.31 |  |
| 5/10/09 | 18.33 |  |
| 5/10/09 | 18.34 |  |
| 5/10/09 | 18.35 |  |
| 5/10/09 | 18.36 |  |
| 5/10/09 | 18.37 |  |
| 5/10/09 | 18.4 |  |
| 5/10/09 | 18.43 |  |
| 5/10/09 | 18.46 |  |
| 5/10/09 | 18.49 |  |
| 5/10/09 | 18.53 |  |
| 5/10/09 | 18.57 |  |
| 5/10/09 | 18.61 |  |
| 5/10/09 | 18.65 |  |
| 5/10/09 | 18.68 |  |
| 5/10/09 | 18.71 |  |
| 5/10/09 | 18.76 |  |
| 5/10/09 | 18.81 |  |
| 5/10/09 | 18.87 |  |
| 5/10/09 | 18.93 |  |
| 5/10/09 | 18.97 |  |
| 5/9/09 | 18.99 |  |
| 5/9/09 | 19.01 |  |
| 5/9/09 | 19.06 |  |
| 5/9/09 | 19.1 |  |
| 5/9/09 | 19.1 |  |
| 5/9/09 | 19.11 |  |
| 5/9/09 | 19.15 |  |
| 5/9/09 | 19.18 |  |
| 5/9/09 | 19.25 |  |
| 5/9/09 | 19.31 |  |
| 5/9/09 | 19.35 |  |
| 5/9/09 | 19.38 |  |
| 5/9/09 | 19.32 |  |
| 5/9/09 | 19.31 |  |
| 5/9/09 | 19.31 |  |
| 5/9/09 | 19.32 |  |
| 5/9/09 | 19.34 |  |
| 5/9/09 | 19.45 |  |
| 5/9/09 | 19.35 |  |
| 5/9/09 | 19.3 |  |
| 5/9/09 | 19.21 |  |
| 5/9/09 | 19.14 |  |
| 5/9/09 | 19.07 |  |
| 5/9/09 | 18.83 |  |
| 5/9/09 | 18.79 |  |
| 5/9/09 | 18.51 |  |
| 5/9/09 | 18.65 |  |
| 5/9/09 | 18.76 |  |
| 5/9/09 | 18.83 |  |
| 5/9/09 | 18.89 |  |
| 5/9/09 | 18.9 |  |
| 5/9/09 | 18.9 |  |
| 5/9/09 | 18.91 |  |
| 5/9/09 | 18.93 |  |
| 5/9/09 | 18.95 |  |
| 5/9/09 | 18.97 |  |
| 5/9/09 | 19 |  |
| 5/9/09 | 19.05 |  |
| 5/9/09 | 19.05 |  |
| 5/9/09 | 19.04 |  |
| 5/9/09 | 19 |  |
| 5/9/09 | 19.01 |  |
| 5/9/09 | 19.05 |  |
| 5/9/09 | 19.05 |  |
| 5/9/09 | 19.04 |  |
| 5/9/09 | 19.03 |  |
| 5/9/09 | 18.98 |  |
| 5/9/09 | 18.97 |  |
| 5/8/09 | 18.96 |  |
| 5/8/09 | 18.99 |  |
| 5/8/09 | 18.95 |  |
| 5/8/09 | 18.95 |  |
| 5/8/09 | 18.99 |  |
| 5/8/09 | 19.03 |  |
| 5/8/09 | 19.05 |  |
| 5/8/09 | 19.11 |  |
| 5/8/09 | 19.13 |  |
| 5/8/09 | 19.22 |  |
| 5/8/09 | 19.12 |  |
| 5/8/09 | 18.98 |  |
| 5/8/09 | 18.86 |  |
| 5/8/09 | 18.58 |  |
| 5/8/09 | 18.53 |  |
| 5/8/09 | 18.69 |  |
| 5/8/09 | 18.8 |  |
| 5/8/09 | 18.66 |  |
| 5/8/09 | 18.36 |  |
| 5/8/09 | 18.37 |  |
| 5/8/09 | 18.35 |  |
| 5/8/09 | 18.35 |  |
| 5/8/09 | 18.27 |  |
| 5/8/09 | 18.24 |  |
| 5/8/09 | 18.16 |  |
| 5/8/09 | 18.05 |  |
| 5/8/09 | 18 |  |
| 5/8/09 | 17.93 |  |
| 5/8/09 | 17.91 |  |
| 5/8/09 | 17.91 |  |
| 5/8/09 | 17.87 |  |
| 5/8/09 | 17.84 |  |
| 5/8/09 | 17.85 |  |
| 5/8/09 | 17.86 |  |
| 5/8/09 | 17.88 |  |
| 5/8/09 | 17.92 |  |
| 5/8/09 | 17.95 |  |
| 5/8/09 | 17.99 |  |
| 5/8/09 | 18.03 |  |
| 5/8/09 | 18.06 |  |
| 5/8/09 | 18.11 |  |
| 5/8/09 | 18.13 |  |
| 5/8/09 | 18.18 |  |
| 5/8/09 | 18.24 |  |
| 5/8/09 | 18.3 |  |
| 5/8/09 | 18.38 |  |
| 5/8/09 | 18.46 |  |
| 5/8/09 | 18.5 |  |
| 5/7/09 | 18.58 |  |
| 5/7/09 | 18.64 |  |
| 5/7/09 | 18.67 |  |
| 5/7/09 | 18.66 |  |
| 5/7/09 | 18.59 |  |
| 5/7/09 | 18.56 |  |
| 5/7/09 | 18.62 |  |
| 5/7/09 | 18.39 |  |
| 5/7/09 | 18.41 |  |
| 5/7/09 | 18.07 |  |
| 5/7/09 | 18.15 |  |
| 5/7/09 | 18.02 |  |
| 5/7/09 | 17.96 |  |
| 5/7/09 | 17.92 |  |
| 5/7/09 | 17.91 |  |
| 5/7/09 | 17.72 |  |
| 5/7/09 | 17.73 |  |
| 5/7/09 | 17.73 |  |
| 5/7/09 | 17.8 |  |
| 5/7/09 | 17.75 |  |
| 5/7/09 | 17.69 |  |
| 5/7/09 | 17.59 |  |
| 5/7/09 | 17.52 |  |
| 5/7/09 | 17.46 |  |
| 5/7/09 | 17.47 |  |
| 5/7/09 | 17.45 |  |
| 5/7/09 | 17.43 |  |
| 5/7/09 | 17.42 |  |
| 5/7/09 | 17.43 |  |
| 5/7/09 | 17.42 |  |
| 5/7/09 | 17.42 |  |
| 5/7/09 | 17.42 |  |
| 5/7/09 | 17.43 |  |
| 5/7/09 | 17.46 |  |
| 5/7/09 | 17.48 |  |
| 5/7/09 | 17.52 |  |
| 5/7/09 | 17.57 |  |
| 5/7/09 | 17.6 |  |
| 5/7/09 | 17.64 |  |
| 5/7/09 | 17.68 |  |
| 5/7/09 | 17.72 |  |
| 5/7/09 | 17.73 |  |
| 5/7/09 | 17.8 |  |
| 5/7/09 | 17.86 |  |
| 5/7/09 | 17.95 |  |
| 5/7/09 | 17.93 |  |
| 5/7/09 | 17.98 |  |
| 5/7/09 | 18.11 |  |
| 5/6/09 | 18.11 |  |
| 5/6/09 | 18.05 |  |
| 5/6/09 | 17.99 |  |
| 5/6/09 | 18.09 |  |
| 5/6/09 | 18.16 |  |
| 5/6/09 | 18.19 |  |
| 5/6/09 | 18.24 |  |
| 5/6/09 | 18.24 |  |
| 5/6/09 | 18.27 |  |
| 5/6/09 | 18.33 |  |
| 5/6/09 | 18.33 |  |
| 5/6/09 | 18.33 |  |
| 5/6/09 | 18.38 |  |
| 5/6/09 | 18.4 |  |
| 5/6/09 | 18.4 |  |
| 5/6/09 | 18.42 |  |
| 5/6/09 | 18.34 |  |
| 5/6/09 | 18.3 |  |
| 5/6/09 | 18.22 |  |
| 5/6/09 | 17.97 |  |
| 5/6/09 | 17.76 |  |
| 5/6/09 | 17.38 |  |
| 5/6/09 | 17.26 |  |
| 5/6/09 | 17.18 |  |
| 5/6/09 | 17.13 |  |
| 5/6/09 | 17.14 |  |
| 5/6/09 | 17.13 |  |
| 5/6/09 | 17.09 |  |
| 5/6/09 | 17.06 |  |
| 5/6/09 | 17.04 |  |
| 5/6/09 | 17.03 |  |
| 5/6/09 | 17.02 |  |
| 5/6/09 | 17.02 |  |
| 5/6/09 | 17.03 |  |
| 5/6/09 | 17.04 |  |
| 5/6/09 | 17.04 |  |
| 5/6/09 | 17.05 |  |
| 5/6/09 | 17.06 |  |
| 5/6/09 | 17.09 |  |
| 5/6/09 | 17.1 |  |
| 5/6/09 | 17.11 |  |
| 5/6/09 | 17.12 |  |
| 5/6/09 | 17.14 |  |
| 5/6/09 | 17.14 |  |
| 5/6/09 | 17.16 |  |
| 5/6/09 | 17.17 |  |
| 5/6/09 | 17.18 |  |
| 5/6/09 | 17.2 |  |
| 5/5/09 | 17.21 |  |
| 5/5/09 | 17.24 |  |
| 5/5/09 | 17.27 |  |
| 5/5/09 | 17.29 |  |
| 5/5/09 | 17.3 |  |
| 5/5/09 | 17.3 |  |
| 5/5/09 | 17.31 |  |
| 5/5/09 | 17.34 |  |
| 5/5/09 | 17.37 |  |
| 5/5/09 | 17.42 |  |
| 5/5/09 | 17.44 |  |
| 5/5/09 | 17.46 |  |
| 5/5/09 | 17.47 |  |
| 5/5/09 | 17.51 |  |
| 5/5/09 | 17.49 |  |
| 5/5/09 | 17.43 |  |
| 5/5/09 | 17.41 |  |
| 5/5/09 | 17.42 |  |
| 5/5/09 | 17.35 |  |
| 5/5/09 | 17.35 |  |
| 5/5/09 | 17.35 |  |
| 5/5/09 | 17.34 |  |
| 5/5/09 | 17.35 |  |
| 5/5/09 | 17.3 |  |
| 5/5/09 | 17.24 |  |
| 5/5/09 | 17.21 |  |
| 5/5/09 | 17.22 |  |
| 5/5/09 | 17.2 |  |
| 5/5/09 | 17.18 |  |
| 5/5/09 | 17.17 |  |
| 5/5/09 | 17.16 |  |
| 5/5/09 | 17.16 |  |
| 5/5/09 | 17.17 |  |
| 5/5/09 | 17.18 |  |
| 5/5/09 | 17.2 |  |
| 5/5/09 | 17.21 |  |
| 5/5/09 | 17.23 |  |
| 5/5/09 | 17.25 |  |
| 5/5/09 | 17.3 |  |
| 5/5/09 | 17.32 |  |
| 5/5/09 | 17.35 |  |
| 5/5/09 | 17.38 |  |
| 5/5/09 | 17.4 |  |
| 5/5/09 | 17.41 |  |
| 5/5/09 | 17.43 |  |
| 5/5/09 | 17.46 |  |
| 5/5/09 | 17.48 |  |
| 5/5/09 | 17.52 |  |
| 5/4/09 | 17.54 |  |
| 5/4/09 | 17.56 |  |
| 5/4/09 | 17.58 |  |
| 5/4/09 | 17.6 |  |
| 5/4/09 | 17.62 |  |
| 5/4/09 | 17.65 |  |
| 5/4/09 | 17.66 |  |
| 5/4/09 | 17.71 |  |
| 5/4/09 | 17.72 |  |
| 5/4/09 | 17.77 |  |
| 5/4/09 | 17.78 |  |
| 5/4/09 | 17.78 |  |
| 5/4/09 | 17.77 |  |
| 5/4/09 | 17.76 |  |
| 5/4/09 | 17.75 |  |
| 5/4/09 | 17.71 |  |
| 5/4/09 | 17.72 |  |
| 5/4/09 | 17.72 |  |
| 5/4/09 | 17.72 |  |
| 5/4/09 | 17.74 |  |
| 5/4/09 | 17.76 |  |
| 5/4/09 | 17.76 |  |
| 5/4/09 | 17.78 |  |
| 5/4/09 | 17.8 |  |
| 5/4/09 | 17.82 |  |
| 5/4/09 | 17.84 |  |
| 5/4/09 | 17.85 |  |
| 5/4/09 | 17.9 |  |
| 5/4/09 | 17.92 |  |
| 5/4/09 | 17.95 |  |
| 5/4/09 | 17.99 |  |
| 5/4/09 | 18.02 |  |
| 5/4/09 | 18.04 |  |
| 5/4/09 | 18.06 |  |
| 5/4/09 | 18.09 |  |
| 5/4/09 | 18.11 |  |
| 5/4/09 | 18.14 |  |
| 5/4/09 | 18.18 |  |
| 5/4/09 | 18.21 |  |
| 5/4/09 | 18.25 |  |
| 5/4/09 | 18.28 |  |
| 5/4/09 | 18.32 |  |
| 5/4/09 | 18.37 |  |
| 5/4/09 | 18.41 |  |
| 5/4/09 | 18.45 |  |
| 5/4/09 | 18.51 |  |
| 5/4/09 | 18.57 |  |
| 5/4/09 | 18.61 |  |
| 5/3/09 | 18.65 |  |
| 5/3/09 | 18.68 |  |
| 5/3/09 | 18.59 |  |
| 5/3/09 | 18.55 |  |
| 5/3/09 | 18.58 |  |
| 5/3/09 | 18.57 |  |
| 5/3/09 | 18.56 |  |
| 5/3/09 | 18.67 |  |
| 5/3/09 | 18.81 |  |
| 5/3/09 | 18.72 |  |
| 5/3/09 | 18.68 |  |
| 5/3/09 | 18.75 |  |
| 5/3/09 | 18.71 |  |
| 5/3/09 | 18.77 |  |
| 5/3/09 | 18.87 |  |
| 5/3/09 | 18.77 |  |
| 5/3/09 | 18.68 |  |
| 5/3/09 | 18.58 |  |
| 5/3/09 | 18.48 |  |
| 5/3/09 | 18.13 |  |
| 5/3/09 | 18.05 |  |
| 5/3/09 | 17.98 |  |
| 5/3/09 | 17.97 |  |
| 5/3/09 | 17.92 |  |
| 5/3/09 | 17.9 |  |
| 5/3/09 | 17.9 |  |
| 5/3/09 | 17.89 |  |
| 5/3/09 | 17.9 |  |
| 5/3/09 | 17.93 |  |
| 5/3/09 | 17.94 |  |
| 5/3/09 | 17.95 |  |
| 5/3/09 | 17.97 |  |
| 5/3/09 | 17.98 |  |
| 5/3/09 | 18.01 |  |
| 5/3/09 | 18.02 |  |
| 5/3/09 | 18.05 |  |
| 5/3/09 | 18.08 |  |
| 5/3/09 | 18.1 |  |
| 5/3/09 | 18.14 |  |
| 5/3/09 | 18.18 |  |
| 5/3/09 | 18.22 |  |
| 5/3/09 | 18.26 |  |
| 5/3/09 | 18.31 |  |
| 5/3/09 | 18.35 |  |
| 5/3/09 | 18.4 |  |
| 5/3/09 | 18.44 |  |
| 5/3/09 | 18.48 |  |
| 5/3/09 | 18.53 |  |
| 5/2/09 | 18.58 |  |
| 5/2/09 | 18.62 |  |
| 5/2/09 | 18.67 |  |
| 5/2/09 | 18.72 |  |
| 5/2/09 | 18.72 |  |
| 5/2/09 | 18.72 |  |
| 5/2/09 | 18.77 |  |
| 5/2/09 | 18.84 |  |
| 5/2/09 | 18.89 |  |
| 5/2/09 | 18.94 |  |
| 5/2/09 | 18.96 |  |
| 5/2/09 | 18.96 |  |
| 5/2/09 | 18.97 |  |
| 5/2/09 | 18.97 |  |
| 5/2/09 | 18.89 |  |
| 5/2/09 | 18.83 |  |
| 5/2/09 | 18.79 |  |
| 5/2/09 | 18.74 |  |
| 5/2/09 | 18.55 |  |
| 5/2/09 | 18.32 |  |
| 5/2/09 | 18.33 |  |
| 5/2/09 | 18.33 |  |
| 5/2/09 | 18.29 |  |
| 5/2/09 | 18.29 |  |
| 5/2/09 | 18.31 |  |
| 5/2/09 | 18.28 |  |
| 5/2/09 | 18.23 |  |
| 5/2/09 | 18.18 |  |
| 5/2/09 | 18.13 |  |
| 5/2/09 | 18.12 |  |
| 5/2/09 | 18.11 |  |
| 5/2/09 | 18.12 |  |
| 5/2/09 | 18.14 |  |
| 5/2/09 | 18.16 |  |
| 5/2/09 | 18.2 |  |
| 5/2/09 | 18.23 |  |
| 5/2/09 | 18.26 |  |
| 5/2/09 | 18.29 |  |
| 5/2/09 | 18.34 |  |
| 5/2/09 | 18.37 |  |
| 5/2/09 | 18.4 |  |
| 5/2/09 | 18.42 |  |
| 5/2/09 | 18.48 |  |
| 5/2/09 | 18.53 |  |
| 5/2/09 | 18.53 |  |
| 5/2/09 | 18.53 |  |
| 5/2/09 | 18.53 |  |
| 5/2/09 | 18.56 |  |
| 5/1/09 | 18.57 |  |
| 5/1/09 | 18.61 |  |
| 5/1/09 | 18.64 |  |
| 5/1/09 | 18.64 |  |
| 5/1/09 | 18.59 |  |
| 5/1/09 | 18.48 |  |
| 5/1/09 | 18.57 |  |
| 5/1/09 | 18.73 |  |
| 5/1/09 | 18.8 |  |
| 5/1/09 | 18.78 |  |
| 5/1/09 | 18.77 |  |
| 5/1/09 | 18.48 |  |
| 5/1/09 | 18.68 |  |
| 5/1/09 | 18.7 |  |
| 5/1/09 | 18.58 |  |
| 5/1/09 | 18.48 |  |
| 5/1/09 | 18.26 |  |
| 5/1/09 | 18.15 |  |
| 5/1/09 | 18.18 |  |
| 5/1/09 | 18.14 |  |
| 5/1/09 | 18.11 |  |
| 5/1/09 | 18.06 |  |
| 5/1/09 | 18.06 |  |
| 5/1/09 | 18.03 |  |
| 5/1/09 | 18 |  |
| 5/1/09 | 17.96 |  |
| 5/1/09 | 17.95 |  |
| 5/1/09 | 17.95 |  |
| 5/1/09 | 17.95 |  |
| 5/1/09 | 17.95 |  |
| 5/1/09 | 17.95 |  |
| 5/1/09 | 17.94 |  |
| 5/1/09 | 17.93 |  |
| 5/1/09 | 17.93 |  |
| 5/1/09 | 17.94 |  |
| 5/1/09 | 17.95 |  |
| 5/1/09 | 17.97 |  |
| 5/1/09 | 17.98 |  |
| 5/1/09 | 17.99 |  |
| 5/1/09 | 18 |  |
| 5/1/09 | 18.03 |  |
| 5/1/09 | 18.05 |  |
| 5/1/09 | 18.07 |  |
| 5/1/09 | 18.08 |  |
| 5/1/09 | 18.09 |  |
| 5/1/09 | 18.09 |  |
| 5/1/09 | 18.07 |  |
| 5/1/09 | 18.08 |  |
| 4/30/09 | 18.1 |  |
| 4/30/09 | 18.12 |  |
| 4/30/09 | 18.15 |  |
| 4/30/09 | 18.2 |  |
| 4/30/09 | 18.24 |  |
| 4/30/09 | 18.26 |  |
| 4/30/09 | 18.28 |  |
| 4/30/09 | 18.27 |  |
| 4/30/09 | 18.26 |  |
| 4/30/09 | 18.28 |  |
| 4/30/09 | 18.27 |  |
| 4/30/09 | 18.28 |  |
| 4/30/09 | 18.26 |  |
| 4/30/09 | 18.27 |  |
| 4/30/09 | 18.26 |  |
| 4/30/09 | 18.25 |  |
| 4/30/09 | 18.27 |  |
| 4/30/09 | 18.3 |  |
| 4/30/09 | 18.28 |  |
| 4/30/09 | 18.25 |  |
| 4/30/09 | 18.22 |  |
| 4/30/09 | 18.08 |  |
| 4/30/09 | 18.08 |  |
| 4/30/09 | 18.06 |  |
| 4/30/09 | 17.96 |  |
| 4/30/09 | 17.88 |  |
| 4/30/09 | 17.81 |  |
| 4/30/09 | 17.78 |  |
| 4/30/09 | 17.77 |  |
| 4/30/09 | 17.75 |  |
| 4/30/09 | 17.73 |  |
| 4/30/09 | 17.73 |  |
| 4/30/09 | 17.76 |  |
| 4/30/09 | 17.79 |  |
| 4/30/09 | 17.82 |  |
| 4/30/09 | 17.86 |  |
| 4/30/09 | 17.88 |  |
| 4/30/09 | 17.91 |  |
| 4/30/09 | 17.95 |  |
| 4/30/09 | 18 |  |
| 4/30/09 | 18.04 |  |
| 4/30/09 | 18.08 |  |
| 4/30/09 | 18.11 |  |
| 4/30/09 | 18.15 |  |
| 4/30/09 | 18.2 |  |
| 4/30/09 | 18.27 |  |
| 4/30/09 | 18.31 |  |
| 4/30/09 | 18.32 |  |
| 4/29/09 | 18.38 |  |
| 4/29/09 | 18.42 |  |
| 4/29/09 | 18.45 |  |
| 4/29/09 | 18.51 |  |
| 4/29/09 | 18.57 |  |
| 4/29/09 | 18.65 |  |
| 4/29/09 | 18.7 |  |
| 4/29/09 | 18.77 |  |
| 4/29/09 | 18.83 |  |
| 4/29/09 | 18.85 |  |
| 4/29/09 | 18.84 |  |
| 4/29/09 | 18.85 |  |
| 4/29/09 | 18.84 |  |
| 4/29/09 | 18.85 |  |
| 4/29/09 | 18.85 |  |
| 4/29/09 | 18.85 |  |
| 4/29/09 | 18.81 |  |
| 4/29/09 | 18.8 |  |
| 4/29/09 | 18.79 |  |
| 4/29/09 | 18.74 |  |
| 4/29/09 | 18.71 |  |
| 4/29/09 | 18.72 |  |
| 4/29/09 | 18.73 |  |
| 4/29/09 | 18.75 |  |
| 4/29/09 | 18.76 |  |
| 4/29/09 | 18.76 |  |
| 4/29/09 | 18.75 |  |
| 4/29/09 | 18.77 |  |
| 4/29/09 | 18.81 |  |
| 4/29/09 | 18.84 |  |
| 4/29/09 | 18.9 |  |
| 4/29/09 | 18.94 |  |
| 4/29/09 | 18.98 |  |
| 4/29/09 | 19.08 |  |
| 4/29/09 | 19.15 |  |
| 4/29/09 | 19.23 |  |
| 4/29/09 | 19.29 |  |
| 4/29/09 | 19.36 |  |
| 4/29/09 | 19.41 |  |
| 4/29/09 | 19.49 |  |
| 4/29/09 | 19.55 |  |
| 4/29/09 | 19.59 |  |
| 4/29/09 | 19.64 |  |
| 4/29/09 | 19.68 |  |
| 4/29/09 | 19.71 |  |
| 4/29/09 | 19.77 |  |
| 4/29/09 | 19.83 |  |
| 4/29/09 | 19.87 |  |
| 4/28/09 | 19.92 |  |
| 4/28/09 | 19.96 |  |
| 4/28/09 | 20.01 |  |
| 4/28/09 | 20.05 |  |
| 4/28/09 | 20.09 |  |
| 4/28/09 | 20.06 |  |
| 4/28/09 | 20.12 |  |
| 4/28/09 | 20.18 |  |
| 4/28/09 | 20.2 |  |
| 4/28/09 | 20.11 |  |
| 4/28/09 | 20.17 |  |
| 4/28/09 | 20.31 |  |
| 4/28/09 | 20.04 |  |
| 4/28/09 | 20.03 |  |
| 4/28/09 | 19.84 |  |
| 4/28/09 | 19.78 |  |
| 4/28/09 | 19.67 |  |
| 4/28/09 | 20.01 |  |
| 4/28/09 | 19.82 |  |
| 4/28/09 | 19.72 |  |
| 4/28/09 | 20.07 |  |
| 4/28/09 | 19.92 |  |
| 4/28/09 | 19.87 |  |
| 4/28/09 | 19.81 |  |
| 4/28/09 | 19.6 |  |
| 4/28/09 | 19.48 |  |
| 4/28/09 | 18.81 |  |
| 4/28/09 | 19.17 |  |
| 4/28/09 | 19.35 |  |
| 4/28/09 | 19.41 |  |
| 4/28/09 | 19.41 |  |
| 4/28/09 | 19.38 |  |
| 4/28/09 | 19.39 |  |
| 4/28/09 | 19.42 |  |
| 4/28/09 | 19.48 |  |
| 4/28/09 | 19.55 |  |
| 4/28/09 | 19.63 |  |
| 4/28/09 | 19.69 |  |
| 4/28/09 | 19.75 |  |
| 4/28/09 | 19.83 |  |
| 4/28/09 | 19.9 |  |
| 4/28/09 | 19.94 |  |
| 4/28/09 | 19.99 |  |
| 4/28/09 | 20.01 |  |
| 4/28/09 | 20.1 |  |
| 4/28/09 | 20.15 |  |
| 4/28/09 | 20.2 |  |
| 4/28/09 | 20.24 |  |
| 4/27/09 | 20.22 |  |
| 4/27/09 | 20.29 |  |
| 4/27/09 | 20.31 |  |
| 4/27/09 | 20.3 |  |
| 4/27/09 | 20.26 |  |
| 4/27/09 | 20.14 |  |
| 4/27/09 | 19.92 |  |
| 4/27/09 | 19.76 |  |
| 4/27/09 | 19.8 |  |
| 4/27/09 | 19.76 |  |
| 4/27/09 | 19.7 |  |
| 4/27/09 | 19.64 |  |
| 4/27/09 | 19.3 |  |
| 4/27/09 | 19.09 |  |
| 4/27/09 | 18.97 |  |
| 4/27/09 | 18.91 |  |
| 4/27/09 | 18.87 |  |
| 4/27/09 | 18.87 |  |